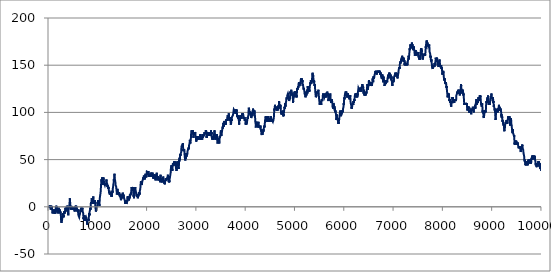
| Category | Series 2 |
|---|---|
| 0.0 | -1 |
| 1.0 | -2 |
| 2.0 | -1 |
| 3.0 | 0 |
| 4.0 | 1 |
| 5.0 | 0 |
| 6.0 | 1 |
| 7.0 | 0 |
| 8.0 | -1 |
| 9.0 | 0 |
| 10.0 | 1 |
| 11.0 | 2 |
| 12.0 | 1 |
| 13.0 | 0 |
| 14.0 | -1 |
| 15.0 | 0 |
| 16.0 | 1 |
| 17.0 | 2 |
| 18.0 | 1 |
| 19.0 | 0 |
| 20.0 | -1 |
| 21.0 | -2 |
| 22.0 | -1 |
| 23.0 | 0 |
| 24.0 | 1 |
| 25.0 | 2 |
| 26.0 | 1 |
| 27.0 | 0 |
| 28.0 | -1 |
| 29.0 | -2 |
| 30.0 | -1 |
| 31.0 | -2 |
| 32.0 | -1 |
| 33.0 | -2 |
| 34.0 | -1 |
| 35.0 | -2 |
| 36.0 | -3 |
| 37.0 | -2 |
| 38.0 | -3 |
| 39.0 | -2 |
| 40.0 | -1 |
| 41.0 | 0 |
| 42.0 | 1 |
| 43.0 | 0 |
| 44.0 | 1 |
| 45.0 | 2 |
| 46.0 | 1 |
| 47.0 | 0 |
| 48.0 | -1 |
| 49.0 | 0 |
| 50.0 | -1 |
| 51.0 | 0 |
| 52.0 | 1 |
| 53.0 | 2 |
| 54.0 | 1 |
| 55.0 | 0 |
| 56.0 | 1 |
| 57.0 | 2 |
| 58.0 | 1 |
| 59.0 | 0 |
| 60.0 | -1 |
| 61.0 | -2 |
| 62.0 | -3 |
| 63.0 | -4 |
| 64.0 | -3 |
| 65.0 | -4 |
| 66.0 | -3 |
| 67.0 | -4 |
| 68.0 | -5 |
| 69.0 | -6 |
| 70.0 | -7 |
| 71.0 | -8 |
| 72.0 | -7 |
| 73.0 | -8 |
| 74.0 | -7 |
| 75.0 | -6 |
| 76.0 | -7 |
| 77.0 | -6 |
| 78.0 | -5 |
| 79.0 | -4 |
| 80.0 | -5 |
| 81.0 | -6 |
| 82.0 | -5 |
| 83.0 | -6 |
| 84.0 | -5 |
| 85.0 | -4 |
| 86.0 | -5 |
| 87.0 | -6 |
| 88.0 | -5 |
| 89.0 | -6 |
| 90.0 | -5 |
| 91.0 | -4 |
| 92.0 | -3 |
| 93.0 | -2 |
| 94.0 | -3 |
| 95.0 | -4 |
| 96.0 | -5 |
| 97.0 | -6 |
| 98.0 | -5 |
| 99.0 | -4 |
| 100.0 | -3 |
| 101.0 | -4 |
| 102.0 | -5 |
| 103.0 | -6 |
| 104.0 | -5 |
| 105.0 | -6 |
| 106.0 | -5 |
| 107.0 | -6 |
| 108.0 | -7 |
| 109.0 | -6 |
| 110.0 | -5 |
| 111.0 | -6 |
| 112.0 | -7 |
| 113.0 | -6 |
| 114.0 | -7 |
| 115.0 | -6 |
| 116.0 | -5 |
| 117.0 | -4 |
| 118.0 | -3 |
| 119.0 | -2 |
| 120.0 | -3 |
| 121.0 | -2 |
| 122.0 | -3 |
| 123.0 | -2 |
| 124.0 | -3 |
| 125.0 | -2 |
| 126.0 | -3 |
| 127.0 | -2 |
| 128.0 | -3 |
| 129.0 | -4 |
| 130.0 | -5 |
| 131.0 | -6 |
| 132.0 | -7 |
| 133.0 | -6 |
| 134.0 | -5 |
| 135.0 | -4 |
| 136.0 | -3 |
| 137.0 | -2 |
| 138.0 | -1 |
| 139.0 | -2 |
| 140.0 | -1 |
| 141.0 | 0 |
| 142.0 | 1 |
| 143.0 | 0 |
| 144.0 | 1 |
| 145.0 | 0 |
| 146.0 | -1 |
| 147.0 | 0 |
| 148.0 | -1 |
| 149.0 | 0 |
| 150.0 | 1 |
| 151.0 | 0 |
| 152.0 | 1 |
| 153.0 | 0 |
| 154.0 | -1 |
| 155.0 | 0 |
| 156.0 | -1 |
| 157.0 | -2 |
| 158.0 | -3 |
| 159.0 | -2 |
| 160.0 | -3 |
| 161.0 | -4 |
| 162.0 | -3 |
| 163.0 | -2 |
| 164.0 | -1 |
| 165.0 | -2 |
| 166.0 | -3 |
| 167.0 | -4 |
| 168.0 | -5 |
| 169.0 | -4 |
| 170.0 | -3 |
| 171.0 | -4 |
| 172.0 | -5 |
| 173.0 | -6 |
| 174.0 | -5 |
| 175.0 | -4 |
| 176.0 | -3 |
| 177.0 | -4 |
| 178.0 | -5 |
| 179.0 | -4 |
| 180.0 | -5 |
| 181.0 | -6 |
| 182.0 | -7 |
| 183.0 | -8 |
| 184.0 | -7 |
| 185.0 | -6 |
| 186.0 | -5 |
| 187.0 | -4 |
| 188.0 | -5 |
| 189.0 | -4 |
| 190.0 | -5 |
| 191.0 | -4 |
| 192.0 | -5 |
| 193.0 | -4 |
| 194.0 | -5 |
| 195.0 | -4 |
| 196.0 | -3 |
| 197.0 | -2 |
| 198.0 | -1 |
| 199.0 | -2 |
| 200.0 | -3 |
| 201.0 | -4 |
| 202.0 | -5 |
| 203.0 | -4 |
| 204.0 | -3 |
| 205.0 | -2 |
| 206.0 | -3 |
| 207.0 | -4 |
| 208.0 | -3 |
| 209.0 | -4 |
| 210.0 | -5 |
| 211.0 | -6 |
| 212.0 | -5 |
| 213.0 | -4 |
| 214.0 | -5 |
| 215.0 | -6 |
| 216.0 | -5 |
| 217.0 | -6 |
| 218.0 | -5 |
| 219.0 | -6 |
| 220.0 | -5 |
| 221.0 | -4 |
| 222.0 | -3 |
| 223.0 | -4 |
| 224.0 | -5 |
| 225.0 | -6 |
| 226.0 | -7 |
| 227.0 | -6 |
| 228.0 | -7 |
| 229.0 | -6 |
| 230.0 | -5 |
| 231.0 | -6 |
| 232.0 | -5 |
| 233.0 | -6 |
| 234.0 | -7 |
| 235.0 | -6 |
| 236.0 | -7 |
| 237.0 | -6 |
| 238.0 | -7 |
| 239.0 | -8 |
| 240.0 | -9 |
| 241.0 | -10 |
| 242.0 | -11 |
| 243.0 | -12 |
| 244.0 | -13 |
| 245.0 | -14 |
| 246.0 | -15 |
| 247.0 | -16 |
| 248.0 | -15 |
| 249.0 | -16 |
| 250.0 | -15 |
| 251.0 | -14 |
| 252.0 | -15 |
| 253.0 | -16 |
| 254.0 | -17 |
| 255.0 | -16 |
| 256.0 | -15 |
| 257.0 | -16 |
| 258.0 | -15 |
| 259.0 | -14 |
| 260.0 | -13 |
| 261.0 | -12 |
| 262.0 | -13 |
| 263.0 | -14 |
| 264.0 | -15 |
| 265.0 | -14 |
| 266.0 | -13 |
| 267.0 | -12 |
| 268.0 | -13 |
| 269.0 | -12 |
| 270.0 | -11 |
| 271.0 | -12 |
| 272.0 | -11 |
| 273.0 | -10 |
| 274.0 | -9 |
| 275.0 | -8 |
| 276.0 | -7 |
| 277.0 | -8 |
| 278.0 | -9 |
| 279.0 | -8 |
| 280.0 | -9 |
| 281.0 | -8 |
| 282.0 | -9 |
| 283.0 | -8 |
| 284.0 | -7 |
| 285.0 | -8 |
| 286.0 | -9 |
| 287.0 | -10 |
| 288.0 | -11 |
| 289.0 | -12 |
| 290.0 | -11 |
| 291.0 | -10 |
| 292.0 | -9 |
| 293.0 | -10 |
| 294.0 | -11 |
| 295.0 | -12 |
| 296.0 | -11 |
| 297.0 | -10 |
| 298.0 | -9 |
| 299.0 | -8 |
| 300.0 | -9 |
| 301.0 | -8 |
| 302.0 | -7 |
| 303.0 | -6 |
| 304.0 | -5 |
| 305.0 | -6 |
| 306.0 | -7 |
| 307.0 | -6 |
| 308.0 | -7 |
| 309.0 | -6 |
| 310.0 | -7 |
| 311.0 | -6 |
| 312.0 | -5 |
| 313.0 | -6 |
| 314.0 | -5 |
| 315.0 | -6 |
| 316.0 | -5 |
| 317.0 | -6 |
| 318.0 | -5 |
| 319.0 | -4 |
| 320.0 | -5 |
| 321.0 | -6 |
| 322.0 | -7 |
| 323.0 | -6 |
| 324.0 | -5 |
| 325.0 | -4 |
| 326.0 | -5 |
| 327.0 | -4 |
| 328.0 | -5 |
| 329.0 | -4 |
| 330.0 | -3 |
| 331.0 | -2 |
| 332.0 | -1 |
| 333.0 | -2 |
| 334.0 | -1 |
| 335.0 | -2 |
| 336.0 | -1 |
| 337.0 | -2 |
| 338.0 | -3 |
| 339.0 | -4 |
| 340.0 | -5 |
| 341.0 | -4 |
| 342.0 | -3 |
| 343.0 | -4 |
| 344.0 | -3 |
| 345.0 | -4 |
| 346.0 | -3 |
| 347.0 | -2 |
| 348.0 | -3 |
| 349.0 | -2 |
| 350.0 | -3 |
| 351.0 | -2 |
| 352.0 | -1 |
| 353.0 | 0 |
| 354.0 | -1 |
| 355.0 | -2 |
| 356.0 | -1 |
| 357.0 | -2 |
| 358.0 | -3 |
| 359.0 | -2 |
| 360.0 | -1 |
| 361.0 | 0 |
| 362.0 | 1 |
| 363.0 | 2 |
| 364.0 | 1 |
| 365.0 | 0 |
| 366.0 | 1 |
| 367.0 | 0 |
| 368.0 | 1 |
| 369.0 | 0 |
| 370.0 | -1 |
| 371.0 | 0 |
| 372.0 | 1 |
| 373.0 | 0 |
| 374.0 | -1 |
| 375.0 | -2 |
| 376.0 | -3 |
| 377.0 | -4 |
| 378.0 | -3 |
| 379.0 | -4 |
| 380.0 | -5 |
| 381.0 | -6 |
| 382.0 | -5 |
| 383.0 | -4 |
| 384.0 | -5 |
| 385.0 | -6 |
| 386.0 | -7 |
| 387.0 | -8 |
| 388.0 | -7 |
| 389.0 | -8 |
| 390.0 | -9 |
| 391.0 | -8 |
| 392.0 | -9 |
| 393.0 | -8 |
| 394.0 | -7 |
| 395.0 | -6 |
| 396.0 | -5 |
| 397.0 | -4 |
| 398.0 | -3 |
| 399.0 | -2 |
| 400.0 | -3 |
| 401.0 | -2 |
| 402.0 | -3 |
| 403.0 | -2 |
| 404.0 | -1 |
| 405.0 | -2 |
| 406.0 | -1 |
| 407.0 | -2 |
| 408.0 | -1 |
| 409.0 | 0 |
| 410.0 | 1 |
| 411.0 | 0 |
| 412.0 | 1 |
| 413.0 | 2 |
| 414.0 | 1 |
| 415.0 | 2 |
| 416.0 | 3 |
| 417.0 | 4 |
| 418.0 | 5 |
| 419.0 | 6 |
| 420.0 | 7 |
| 421.0 | 8 |
| 422.0 | 9 |
| 423.0 | 10 |
| 424.0 | 9 |
| 425.0 | 8 |
| 426.0 | 7 |
| 427.0 | 6 |
| 428.0 | 5 |
| 429.0 | 4 |
| 430.0 | 3 |
| 431.0 | 2 |
| 432.0 | 3 |
| 433.0 | 2 |
| 434.0 | 1 |
| 435.0 | 2 |
| 436.0 | 1 |
| 437.0 | 2 |
| 438.0 | 1 |
| 439.0 | 0 |
| 440.0 | 1 |
| 441.0 | 0 |
| 442.0 | -1 |
| 443.0 | -2 |
| 444.0 | -3 |
| 445.0 | -2 |
| 446.0 | -1 |
| 447.0 | -2 |
| 448.0 | -1 |
| 449.0 | 0 |
| 450.0 | -1 |
| 451.0 | 0 |
| 452.0 | 1 |
| 453.0 | 2 |
| 454.0 | 1 |
| 455.0 | 2 |
| 456.0 | 1 |
| 457.0 | 0 |
| 458.0 | -1 |
| 459.0 | -2 |
| 460.0 | -3 |
| 461.0 | -2 |
| 462.0 | -1 |
| 463.0 | -2 |
| 464.0 | -1 |
| 465.0 | 0 |
| 466.0 | -1 |
| 467.0 | -2 |
| 468.0 | -1 |
| 469.0 | -2 |
| 470.0 | -1 |
| 471.0 | -2 |
| 472.0 | -3 |
| 473.0 | -2 |
| 474.0 | -1 |
| 475.0 | -2 |
| 476.0 | -3 |
| 477.0 | -2 |
| 478.0 | -3 |
| 479.0 | -4 |
| 480.0 | -3 |
| 481.0 | -4 |
| 482.0 | -3 |
| 483.0 | -2 |
| 484.0 | -1 |
| 485.0 | -2 |
| 486.0 | -1 |
| 487.0 | -2 |
| 488.0 | -1 |
| 489.0 | -2 |
| 490.0 | -3 |
| 491.0 | -2 |
| 492.0 | -1 |
| 493.0 | -2 |
| 494.0 | -1 |
| 495.0 | -2 |
| 496.0 | -1 |
| 497.0 | -2 |
| 498.0 | -1 |
| 499.0 | -2 |
| 500.0 | -3 |
| 501.0 | -4 |
| 502.0 | -3 |
| 503.0 | -2 |
| 504.0 | -1 |
| 505.0 | 0 |
| 506.0 | -1 |
| 507.0 | -2 |
| 508.0 | -3 |
| 509.0 | -2 |
| 510.0 | -3 |
| 511.0 | -2 |
| 512.0 | -3 |
| 513.0 | -4 |
| 514.0 | -3 |
| 515.0 | -2 |
| 516.0 | -3 |
| 517.0 | -2 |
| 518.0 | -3 |
| 519.0 | -4 |
| 520.0 | -5 |
| 521.0 | -6 |
| 522.0 | -5 |
| 523.0 | -6 |
| 524.0 | -5 |
| 525.0 | -4 |
| 526.0 | -5 |
| 527.0 | -4 |
| 528.0 | -3 |
| 529.0 | -2 |
| 530.0 | -3 |
| 531.0 | -2 |
| 532.0 | -1 |
| 533.0 | -2 |
| 534.0 | -1 |
| 535.0 | 0 |
| 536.0 | 1 |
| 537.0 | 0 |
| 538.0 | 1 |
| 539.0 | 0 |
| 540.0 | -1 |
| 541.0 | 0 |
| 542.0 | 1 |
| 543.0 | 2 |
| 544.0 | 1 |
| 545.0 | 0 |
| 546.0 | -1 |
| 547.0 | -2 |
| 548.0 | -1 |
| 549.0 | 0 |
| 550.0 | 1 |
| 551.0 | 0 |
| 552.0 | -1 |
| 553.0 | 0 |
| 554.0 | -1 |
| 555.0 | 0 |
| 556.0 | -1 |
| 557.0 | -2 |
| 558.0 | -3 |
| 559.0 | -2 |
| 560.0 | -1 |
| 561.0 | -2 |
| 562.0 | -1 |
| 563.0 | -2 |
| 564.0 | -1 |
| 565.0 | -2 |
| 566.0 | -1 |
| 567.0 | -2 |
| 568.0 | -3 |
| 569.0 | -4 |
| 570.0 | -3 |
| 571.0 | -4 |
| 572.0 | -5 |
| 573.0 | -6 |
| 574.0 | -5 |
| 575.0 | -4 |
| 576.0 | -5 |
| 577.0 | -6 |
| 578.0 | -5 |
| 579.0 | -4 |
| 580.0 | -3 |
| 581.0 | -4 |
| 582.0 | -5 |
| 583.0 | -4 |
| 584.0 | -5 |
| 585.0 | -4 |
| 586.0 | -3 |
| 587.0 | -4 |
| 588.0 | -5 |
| 589.0 | -6 |
| 590.0 | -5 |
| 591.0 | -6 |
| 592.0 | -7 |
| 593.0 | -6 |
| 594.0 | -7 |
| 595.0 | -8 |
| 596.0 | -9 |
| 597.0 | -10 |
| 598.0 | -9 |
| 599.0 | -10 |
| 600.0 | -9 |
| 601.0 | -10 |
| 602.0 | -9 |
| 603.0 | -8 |
| 604.0 | -9 |
| 605.0 | -8 |
| 606.0 | -9 |
| 607.0 | -8 |
| 608.0 | -9 |
| 609.0 | -8 |
| 610.0 | -9 |
| 611.0 | -10 |
| 612.0 | -11 |
| 613.0 | -10 |
| 614.0 | -11 |
| 615.0 | -10 |
| 616.0 | -11 |
| 617.0 | -10 |
| 618.0 | -9 |
| 619.0 | -10 |
| 620.0 | -9 |
| 621.0 | -8 |
| 622.0 | -9 |
| 623.0 | -8 |
| 624.0 | -9 |
| 625.0 | -10 |
| 626.0 | -9 |
| 627.0 | -10 |
| 628.0 | -9 |
| 629.0 | -8 |
| 630.0 | -7 |
| 631.0 | -6 |
| 632.0 | -7 |
| 633.0 | -6 |
| 634.0 | -5 |
| 635.0 | -6 |
| 636.0 | -5 |
| 637.0 | -4 |
| 638.0 | -3 |
| 639.0 | -4 |
| 640.0 | -5 |
| 641.0 | -6 |
| 642.0 | -5 |
| 643.0 | -4 |
| 644.0 | -3 |
| 645.0 | -2 |
| 646.0 | -3 |
| 647.0 | -4 |
| 648.0 | -3 |
| 649.0 | -2 |
| 650.0 | -3 |
| 651.0 | -2 |
| 652.0 | -1 |
| 653.0 | 0 |
| 654.0 | -1 |
| 655.0 | -2 |
| 656.0 | -3 |
| 657.0 | -2 |
| 658.0 | -3 |
| 659.0 | -4 |
| 660.0 | -5 |
| 661.0 | -4 |
| 662.0 | -3 |
| 663.0 | -4 |
| 664.0 | -3 |
| 665.0 | -4 |
| 666.0 | -5 |
| 667.0 | -4 |
| 668.0 | -5 |
| 669.0 | -4 |
| 670.0 | -3 |
| 671.0 | -2 |
| 672.0 | -3 |
| 673.0 | -4 |
| 674.0 | -3 |
| 675.0 | -2 |
| 676.0 | -3 |
| 677.0 | -2 |
| 678.0 | -1 |
| 679.0 | -2 |
| 680.0 | -3 |
| 681.0 | -2 |
| 682.0 | -3 |
| 683.0 | -4 |
| 684.0 | -5 |
| 685.0 | -4 |
| 686.0 | -5 |
| 687.0 | -4 |
| 688.0 | -5 |
| 689.0 | -4 |
| 690.0 | -5 |
| 691.0 | -6 |
| 692.0 | -5 |
| 693.0 | -6 |
| 694.0 | -7 |
| 695.0 | -8 |
| 696.0 | -9 |
| 697.0 | -10 |
| 698.0 | -11 |
| 699.0 | -12 |
| 700.0 | -13 |
| 701.0 | -12 |
| 702.0 | -11 |
| 703.0 | -12 |
| 704.0 | -13 |
| 705.0 | -12 |
| 706.0 | -13 |
| 707.0 | -12 |
| 708.0 | -13 |
| 709.0 | -14 |
| 710.0 | -15 |
| 711.0 | -14 |
| 712.0 | -15 |
| 713.0 | -14 |
| 714.0 | -13 |
| 715.0 | -12 |
| 716.0 | -11 |
| 717.0 | -10 |
| 718.0 | -9 |
| 719.0 | -8 |
| 720.0 | -9 |
| 721.0 | -10 |
| 722.0 | -9 |
| 723.0 | -10 |
| 724.0 | -11 |
| 725.0 | -10 |
| 726.0 | -11 |
| 727.0 | -12 |
| 728.0 | -13 |
| 729.0 | -14 |
| 730.0 | -15 |
| 731.0 | -16 |
| 732.0 | -15 |
| 733.0 | -14 |
| 734.0 | -15 |
| 735.0 | -14 |
| 736.0 | -15 |
| 737.0 | -14 |
| 738.0 | -13 |
| 739.0 | -14 |
| 740.0 | -13 |
| 741.0 | -12 |
| 742.0 | -13 |
| 743.0 | -14 |
| 744.0 | -13 |
| 745.0 | -14 |
| 746.0 | -13 |
| 747.0 | -12 |
| 748.0 | -13 |
| 749.0 | -12 |
| 750.0 | -13 |
| 751.0 | -12 |
| 752.0 | -11 |
| 753.0 | -10 |
| 754.0 | -11 |
| 755.0 | -10 |
| 756.0 | -11 |
| 757.0 | -12 |
| 758.0 | -11 |
| 759.0 | -12 |
| 760.0 | -11 |
| 761.0 | -12 |
| 762.0 | -11 |
| 763.0 | -10 |
| 764.0 | -11 |
| 765.0 | -12 |
| 766.0 | -13 |
| 767.0 | -14 |
| 768.0 | -15 |
| 769.0 | -16 |
| 770.0 | -17 |
| 771.0 | -18 |
| 772.0 | -17 |
| 773.0 | -18 |
| 774.0 | -19 |
| 775.0 | -18 |
| 776.0 | -19 |
| 777.0 | -20 |
| 778.0 | -19 |
| 779.0 | -18 |
| 780.0 | -17 |
| 781.0 | -16 |
| 782.0 | -15 |
| 783.0 | -16 |
| 784.0 | -15 |
| 785.0 | -14 |
| 786.0 | -13 |
| 787.0 | -12 |
| 788.0 | -13 |
| 789.0 | -14 |
| 790.0 | -13 |
| 791.0 | -12 |
| 792.0 | -13 |
| 793.0 | -14 |
| 794.0 | -13 |
| 795.0 | -14 |
| 796.0 | -15 |
| 797.0 | -14 |
| 798.0 | -13 |
| 799.0 | -14 |
| 800.0 | -13 |
| 801.0 | -14 |
| 802.0 | -15 |
| 803.0 | -16 |
| 804.0 | -15 |
| 805.0 | -14 |
| 806.0 | -13 |
| 807.0 | -12 |
| 808.0 | -11 |
| 809.0 | -10 |
| 810.0 | -9 |
| 811.0 | -8 |
| 812.0 | -7 |
| 813.0 | -8 |
| 814.0 | -7 |
| 815.0 | -8 |
| 816.0 | -9 |
| 817.0 | -8 |
| 818.0 | -7 |
| 819.0 | -8 |
| 820.0 | -9 |
| 821.0 | -8 |
| 822.0 | -7 |
| 823.0 | -6 |
| 824.0 | -5 |
| 825.0 | -4 |
| 826.0 | -5 |
| 827.0 | -6 |
| 828.0 | -5 |
| 829.0 | -4 |
| 830.0 | -5 |
| 831.0 | -6 |
| 832.0 | -5 |
| 833.0 | -4 |
| 834.0 | -3 |
| 835.0 | -2 |
| 836.0 | -1 |
| 837.0 | -2 |
| 838.0 | -1 |
| 839.0 | -2 |
| 840.0 | -1 |
| 841.0 | -2 |
| 842.0 | -3 |
| 843.0 | -2 |
| 844.0 | -1 |
| 845.0 | 0 |
| 846.0 | 1 |
| 847.0 | 2 |
| 848.0 | 3 |
| 849.0 | 4 |
| 850.0 | 5 |
| 851.0 | 6 |
| 852.0 | 5 |
| 853.0 | 4 |
| 854.0 | 5 |
| 855.0 | 6 |
| 856.0 | 5 |
| 857.0 | 4 |
| 858.0 | 3 |
| 859.0 | 4 |
| 860.0 | 5 |
| 861.0 | 4 |
| 862.0 | 5 |
| 863.0 | 6 |
| 864.0 | 7 |
| 865.0 | 8 |
| 866.0 | 7 |
| 867.0 | 8 |
| 868.0 | 9 |
| 869.0 | 8 |
| 870.0 | 7 |
| 871.0 | 8 |
| 872.0 | 7 |
| 873.0 | 6 |
| 874.0 | 5 |
| 875.0 | 4 |
| 876.0 | 3 |
| 877.0 | 4 |
| 878.0 | 3 |
| 879.0 | 4 |
| 880.0 | 5 |
| 881.0 | 4 |
| 882.0 | 3 |
| 883.0 | 4 |
| 884.0 | 3 |
| 885.0 | 2 |
| 886.0 | 3 |
| 887.0 | 4 |
| 888.0 | 5 |
| 889.0 | 4 |
| 890.0 | 5 |
| 891.0 | 6 |
| 892.0 | 7 |
| 893.0 | 8 |
| 894.0 | 9 |
| 895.0 | 8 |
| 896.0 | 9 |
| 897.0 | 10 |
| 898.0 | 11 |
| 899.0 | 10 |
| 900.0 | 9 |
| 901.0 | 8 |
| 902.0 | 7 |
| 903.0 | 6 |
| 904.0 | 5 |
| 905.0 | 4 |
| 906.0 | 5 |
| 907.0 | 6 |
| 908.0 | 7 |
| 909.0 | 6 |
| 910.0 | 5 |
| 911.0 | 4 |
| 912.0 | 3 |
| 913.0 | 4 |
| 914.0 | 5 |
| 915.0 | 6 |
| 916.0 | 5 |
| 917.0 | 6 |
| 918.0 | 5 |
| 919.0 | 6 |
| 920.0 | 7 |
| 921.0 | 6 |
| 922.0 | 7 |
| 923.0 | 6 |
| 924.0 | 7 |
| 925.0 | 6 |
| 926.0 | 5 |
| 927.0 | 6 |
| 928.0 | 7 |
| 929.0 | 6 |
| 930.0 | 5 |
| 931.0 | 6 |
| 932.0 | 5 |
| 933.0 | 4 |
| 934.0 | 5 |
| 935.0 | 4 |
| 936.0 | 3 |
| 937.0 | 2 |
| 938.0 | 3 |
| 939.0 | 2 |
| 940.0 | 1 |
| 941.0 | 0 |
| 942.0 | -1 |
| 943.0 | -2 |
| 944.0 | -1 |
| 945.0 | -2 |
| 946.0 | -1 |
| 947.0 | -2 |
| 948.0 | -3 |
| 949.0 | -4 |
| 950.0 | -5 |
| 951.0 | -6 |
| 952.0 | -5 |
| 953.0 | -6 |
| 954.0 | -5 |
| 955.0 | -6 |
| 956.0 | -5 |
| 957.0 | -6 |
| 958.0 | -5 |
| 959.0 | -4 |
| 960.0 | -3 |
| 961.0 | -2 |
| 962.0 | -3 |
| 963.0 | -4 |
| 964.0 | -3 |
| 965.0 | -2 |
| 966.0 | -3 |
| 967.0 | -2 |
| 968.0 | -3 |
| 969.0 | -2 |
| 970.0 | -3 |
| 971.0 | -2 |
| 972.0 | -3 |
| 973.0 | -2 |
| 974.0 | -1 |
| 975.0 | 0 |
| 976.0 | -1 |
| 977.0 | 0 |
| 978.0 | 1 |
| 979.0 | 0 |
| 980.0 | 1 |
| 981.0 | 0 |
| 982.0 | 1 |
| 983.0 | 2 |
| 984.0 | 3 |
| 985.0 | 4 |
| 986.0 | 5 |
| 987.0 | 4 |
| 988.0 | 3 |
| 989.0 | 4 |
| 990.0 | 5 |
| 991.0 | 4 |
| 992.0 | 5 |
| 993.0 | 6 |
| 994.0 | 7 |
| 995.0 | 8 |
| 996.0 | 7 |
| 997.0 | 6 |
| 998.0 | 5 |
| 999.0 | 6 |
| 1000.0 | 5 |
| 1001.0 | 4 |
| 1002.0 | 5 |
| 1003.0 | 6 |
| 1004.0 | 7 |
| 1005.0 | 6 |
| 1006.0 | 5 |
| 1007.0 | 6 |
| 1008.0 | 5 |
| 1009.0 | 6 |
| 1010.0 | 5 |
| 1011.0 | 4 |
| 1012.0 | 5 |
| 1013.0 | 6 |
| 1014.0 | 5 |
| 1015.0 | 4 |
| 1016.0 | 3 |
| 1017.0 | 4 |
| 1018.0 | 3 |
| 1019.0 | 2 |
| 1020.0 | 3 |
| 1021.0 | 2 |
| 1022.0 | 1 |
| 1023.0 | 2 |
| 1024.0 | 3 |
| 1025.0 | 4 |
| 1026.0 | 5 |
| 1027.0 | 6 |
| 1028.0 | 7 |
| 1029.0 | 8 |
| 1030.0 | 9 |
| 1031.0 | 8 |
| 1032.0 | 9 |
| 1033.0 | 10 |
| 1034.0 | 11 |
| 1035.0 | 12 |
| 1036.0 | 11 |
| 1037.0 | 12 |
| 1038.0 | 11 |
| 1039.0 | 12 |
| 1040.0 | 13 |
| 1041.0 | 12 |
| 1042.0 | 13 |
| 1043.0 | 12 |
| 1044.0 | 13 |
| 1045.0 | 14 |
| 1046.0 | 15 |
| 1047.0 | 16 |
| 1048.0 | 17 |
| 1049.0 | 18 |
| 1050.0 | 19 |
| 1051.0 | 20 |
| 1052.0 | 19 |
| 1053.0 | 20 |
| 1054.0 | 21 |
| 1055.0 | 22 |
| 1056.0 | 23 |
| 1057.0 | 24 |
| 1058.0 | 25 |
| 1059.0 | 26 |
| 1060.0 | 27 |
| 1061.0 | 26 |
| 1062.0 | 27 |
| 1063.0 | 26 |
| 1064.0 | 27 |
| 1065.0 | 28 |
| 1066.0 | 29 |
| 1067.0 | 28 |
| 1068.0 | 29 |
| 1069.0 | 28 |
| 1070.0 | 27 |
| 1071.0 | 28 |
| 1072.0 | 29 |
| 1073.0 | 28 |
| 1074.0 | 29 |
| 1075.0 | 28 |
| 1076.0 | 29 |
| 1077.0 | 30 |
| 1078.0 | 31 |
| 1079.0 | 30 |
| 1080.0 | 29 |
| 1081.0 | 30 |
| 1082.0 | 29 |
| 1083.0 | 30 |
| 1084.0 | 31 |
| 1085.0 | 30 |
| 1086.0 | 29 |
| 1087.0 | 28 |
| 1088.0 | 27 |
| 1089.0 | 26 |
| 1090.0 | 27 |
| 1091.0 | 26 |
| 1092.0 | 25 |
| 1093.0 | 24 |
| 1094.0 | 23 |
| 1095.0 | 24 |
| 1096.0 | 25 |
| 1097.0 | 24 |
| 1098.0 | 25 |
| 1099.0 | 26 |
| 1100.0 | 27 |
| 1101.0 | 28 |
| 1102.0 | 27 |
| 1103.0 | 28 |
| 1104.0 | 29 |
| 1105.0 | 30 |
| 1106.0 | 31 |
| 1107.0 | 30 |
| 1108.0 | 29 |
| 1109.0 | 28 |
| 1110.0 | 27 |
| 1111.0 | 28 |
| 1112.0 | 27 |
| 1113.0 | 26 |
| 1114.0 | 25 |
| 1115.0 | 26 |
| 1116.0 | 27 |
| 1117.0 | 26 |
| 1118.0 | 25 |
| 1119.0 | 24 |
| 1120.0 | 23 |
| 1121.0 | 24 |
| 1122.0 | 25 |
| 1123.0 | 26 |
| 1124.0 | 25 |
| 1125.0 | 24 |
| 1126.0 | 25 |
| 1127.0 | 26 |
| 1128.0 | 25 |
| 1129.0 | 26 |
| 1130.0 | 25 |
| 1131.0 | 26 |
| 1132.0 | 25 |
| 1133.0 | 24 |
| 1134.0 | 23 |
| 1135.0 | 22 |
| 1136.0 | 23 |
| 1137.0 | 22 |
| 1138.0 | 23 |
| 1139.0 | 24 |
| 1140.0 | 23 |
| 1141.0 | 24 |
| 1142.0 | 23 |
| 1143.0 | 24 |
| 1144.0 | 25 |
| 1145.0 | 24 |
| 1146.0 | 25 |
| 1147.0 | 24 |
| 1148.0 | 25 |
| 1149.0 | 26 |
| 1150.0 | 25 |
| 1151.0 | 24 |
| 1152.0 | 23 |
| 1153.0 | 24 |
| 1154.0 | 23 |
| 1155.0 | 24 |
| 1156.0 | 25 |
| 1157.0 | 24 |
| 1158.0 | 23 |
| 1159.0 | 24 |
| 1160.0 | 25 |
| 1161.0 | 26 |
| 1162.0 | 27 |
| 1163.0 | 26 |
| 1164.0 | 27 |
| 1165.0 | 28 |
| 1166.0 | 29 |
| 1167.0 | 28 |
| 1168.0 | 27 |
| 1169.0 | 26 |
| 1170.0 | 27 |
| 1171.0 | 28 |
| 1172.0 | 27 |
| 1173.0 | 26 |
| 1174.0 | 25 |
| 1175.0 | 24 |
| 1176.0 | 23 |
| 1177.0 | 24 |
| 1178.0 | 25 |
| 1179.0 | 24 |
| 1180.0 | 23 |
| 1181.0 | 22 |
| 1182.0 | 23 |
| 1183.0 | 24 |
| 1184.0 | 23 |
| 1185.0 | 22 |
| 1186.0 | 21 |
| 1187.0 | 20 |
| 1188.0 | 21 |
| 1189.0 | 22 |
| 1190.0 | 23 |
| 1191.0 | 22 |
| 1192.0 | 21 |
| 1193.0 | 22 |
| 1194.0 | 21 |
| 1195.0 | 22 |
| 1196.0 | 21 |
| 1197.0 | 22 |
| 1198.0 | 21 |
| 1199.0 | 20 |
| 1200.0 | 21 |
| 1201.0 | 20 |
| 1202.0 | 19 |
| 1203.0 | 18 |
| 1204.0 | 19 |
| 1205.0 | 20 |
| 1206.0 | 21 |
| 1207.0 | 20 |
| 1208.0 | 21 |
| 1209.0 | 20 |
| 1210.0 | 21 |
| 1211.0 | 20 |
| 1212.0 | 19 |
| 1213.0 | 18 |
| 1214.0 | 17 |
| 1215.0 | 18 |
| 1216.0 | 17 |
| 1217.0 | 16 |
| 1218.0 | 15 |
| 1219.0 | 16 |
| 1220.0 | 15 |
| 1221.0 | 16 |
| 1222.0 | 17 |
| 1223.0 | 18 |
| 1224.0 | 17 |
| 1225.0 | 16 |
| 1226.0 | 17 |
| 1227.0 | 16 |
| 1228.0 | 15 |
| 1229.0 | 14 |
| 1230.0 | 13 |
| 1231.0 | 12 |
| 1232.0 | 13 |
| 1233.0 | 14 |
| 1234.0 | 15 |
| 1235.0 | 14 |
| 1236.0 | 15 |
| 1237.0 | 16 |
| 1238.0 | 15 |
| 1239.0 | 16 |
| 1240.0 | 15 |
| 1241.0 | 16 |
| 1242.0 | 15 |
| 1243.0 | 14 |
| 1244.0 | 15 |
| 1245.0 | 14 |
| 1246.0 | 13 |
| 1247.0 | 12 |
| 1248.0 | 13 |
| 1249.0 | 12 |
| 1250.0 | 13 |
| 1251.0 | 14 |
| 1252.0 | 13 |
| 1253.0 | 14 |
| 1254.0 | 15 |
| 1255.0 | 14 |
| 1256.0 | 15 |
| 1257.0 | 14 |
| 1258.0 | 13 |
| 1259.0 | 14 |
| 1260.0 | 15 |
| 1261.0 | 14 |
| 1262.0 | 13 |
| 1263.0 | 12 |
| 1264.0 | 11 |
| 1265.0 | 10 |
| 1266.0 | 11 |
| 1267.0 | 12 |
| 1268.0 | 13 |
| 1269.0 | 12 |
| 1270.0 | 11 |
| 1271.0 | 12 |
| 1272.0 | 13 |
| 1273.0 | 12 |
| 1274.0 | 11 |
| 1275.0 | 12 |
| 1276.0 | 13 |
| 1277.0 | 12 |
| 1278.0 | 13 |
| 1279.0 | 12 |
| 1280.0 | 13 |
| 1281.0 | 14 |
| 1282.0 | 15 |
| 1283.0 | 14 |
| 1284.0 | 15 |
| 1285.0 | 16 |
| 1286.0 | 17 |
| 1287.0 | 16 |
| 1288.0 | 15 |
| 1289.0 | 16 |
| 1290.0 | 17 |
| 1291.0 | 18 |
| 1292.0 | 19 |
| 1293.0 | 18 |
| 1294.0 | 19 |
| 1295.0 | 20 |
| 1296.0 | 19 |
| 1297.0 | 18 |
| 1298.0 | 19 |
| 1299.0 | 20 |
| 1300.0 | 21 |
| 1301.0 | 22 |
| 1302.0 | 23 |
| 1303.0 | 22 |
| 1304.0 | 23 |
| 1305.0 | 22 |
| 1306.0 | 23 |
| 1307.0 | 24 |
| 1308.0 | 23 |
| 1309.0 | 24 |
| 1310.0 | 25 |
| 1311.0 | 26 |
| 1312.0 | 27 |
| 1313.0 | 28 |
| 1314.0 | 29 |
| 1315.0 | 28 |
| 1316.0 | 29 |
| 1317.0 | 28 |
| 1318.0 | 27 |
| 1319.0 | 28 |
| 1320.0 | 29 |
| 1321.0 | 30 |
| 1322.0 | 31 |
| 1323.0 | 32 |
| 1324.0 | 31 |
| 1325.0 | 32 |
| 1326.0 | 33 |
| 1327.0 | 34 |
| 1328.0 | 35 |
| 1329.0 | 34 |
| 1330.0 | 33 |
| 1331.0 | 32 |
| 1332.0 | 31 |
| 1333.0 | 32 |
| 1334.0 | 31 |
| 1335.0 | 30 |
| 1336.0 | 29 |
| 1337.0 | 30 |
| 1338.0 | 29 |
| 1339.0 | 28 |
| 1340.0 | 29 |
| 1341.0 | 28 |
| 1342.0 | 29 |
| 1343.0 | 28 |
| 1344.0 | 27 |
| 1345.0 | 28 |
| 1346.0 | 27 |
| 1347.0 | 26 |
| 1348.0 | 25 |
| 1349.0 | 24 |
| 1350.0 | 23 |
| 1351.0 | 24 |
| 1352.0 | 23 |
| 1353.0 | 24 |
| 1354.0 | 23 |
| 1355.0 | 22 |
| 1356.0 | 23 |
| 1357.0 | 24 |
| 1358.0 | 23 |
| 1359.0 | 24 |
| 1360.0 | 23 |
| 1361.0 | 24 |
| 1362.0 | 23 |
| 1363.0 | 22 |
| 1364.0 | 21 |
| 1365.0 | 20 |
| 1366.0 | 19 |
| 1367.0 | 20 |
| 1368.0 | 19 |
| 1369.0 | 18 |
| 1370.0 | 17 |
| 1371.0 | 16 |
| 1372.0 | 17 |
| 1373.0 | 16 |
| 1374.0 | 15 |
| 1375.0 | 14 |
| 1376.0 | 13 |
| 1377.0 | 14 |
| 1378.0 | 13 |
| 1379.0 | 14 |
| 1380.0 | 15 |
| 1381.0 | 16 |
| 1382.0 | 17 |
| 1383.0 | 16 |
| 1384.0 | 15 |
| 1385.0 | 16 |
| 1386.0 | 17 |
| 1387.0 | 18 |
| 1388.0 | 19 |
| 1389.0 | 20 |
| 1390.0 | 19 |
| 1391.0 | 18 |
| 1392.0 | 17 |
| 1393.0 | 18 |
| 1394.0 | 17 |
| 1395.0 | 16 |
| 1396.0 | 17 |
| 1397.0 | 16 |
| 1398.0 | 17 |
| 1399.0 | 16 |
| 1400.0 | 15 |
| 1401.0 | 14 |
| 1402.0 | 13 |
| 1403.0 | 14 |
| 1404.0 | 15 |
| 1405.0 | 16 |
| 1406.0 | 15 |
| 1407.0 | 14 |
| 1408.0 | 15 |
| 1409.0 | 14 |
| 1410.0 | 13 |
| 1411.0 | 14 |
| 1412.0 | 15 |
| 1413.0 | 14 |
| 1414.0 | 13 |
| 1415.0 | 14 |
| 1416.0 | 15 |
| 1417.0 | 14 |
| 1418.0 | 15 |
| 1419.0 | 14 |
| 1420.0 | 15 |
| 1421.0 | 14 |
| 1422.0 | 13 |
| 1423.0 | 14 |
| 1424.0 | 15 |
| 1425.0 | 16 |
| 1426.0 | 15 |
| 1427.0 | 14 |
| 1428.0 | 13 |
| 1429.0 | 14 |
| 1430.0 | 13 |
| 1431.0 | 12 |
| 1432.0 | 13 |
| 1433.0 | 12 |
| 1434.0 | 11 |
| 1435.0 | 12 |
| 1436.0 | 13 |
| 1437.0 | 12 |
| 1438.0 | 13 |
| 1439.0 | 12 |
| 1440.0 | 11 |
| 1441.0 | 12 |
| 1442.0 | 11 |
| 1443.0 | 10 |
| 1444.0 | 11 |
| 1445.0 | 12 |
| 1446.0 | 11 |
| 1447.0 | 10 |
| 1448.0 | 11 |
| 1449.0 | 10 |
| 1450.0 | 11 |
| 1451.0 | 10 |
| 1452.0 | 11 |
| 1453.0 | 10 |
| 1454.0 | 9 |
| 1455.0 | 8 |
| 1456.0 | 9 |
| 1457.0 | 10 |
| 1458.0 | 9 |
| 1459.0 | 8 |
| 1460.0 | 7 |
| 1461.0 | 8 |
| 1462.0 | 7 |
| 1463.0 | 8 |
| 1464.0 | 7 |
| 1465.0 | 8 |
| 1466.0 | 9 |
| 1467.0 | 8 |
| 1468.0 | 9 |
| 1469.0 | 10 |
| 1470.0 | 11 |
| 1471.0 | 12 |
| 1472.0 | 13 |
| 1473.0 | 12 |
| 1474.0 | 11 |
| 1475.0 | 10 |
| 1476.0 | 11 |
| 1477.0 | 10 |
| 1478.0 | 11 |
| 1479.0 | 12 |
| 1480.0 | 11 |
| 1481.0 | 10 |
| 1482.0 | 9 |
| 1483.0 | 10 |
| 1484.0 | 11 |
| 1485.0 | 10 |
| 1486.0 | 11 |
| 1487.0 | 12 |
| 1488.0 | 13 |
| 1489.0 | 12 |
| 1490.0 | 13 |
| 1491.0 | 14 |
| 1492.0 | 13 |
| 1493.0 | 12 |
| 1494.0 | 13 |
| 1495.0 | 14 |
| 1496.0 | 15 |
| 1497.0 | 16 |
| 1498.0 | 15 |
| 1499.0 | 14 |
| 1500.0 | 13 |
| 1501.0 | 14 |
| 1502.0 | 13 |
| 1503.0 | 12 |
| 1504.0 | 13 |
| 1505.0 | 12 |
| 1506.0 | 11 |
| 1507.0 | 10 |
| 1508.0 | 9 |
| 1509.0 | 10 |
| 1510.0 | 11 |
| 1511.0 | 12 |
| 1512.0 | 13 |
| 1513.0 | 14 |
| 1514.0 | 13 |
| 1515.0 | 12 |
| 1516.0 | 11 |
| 1517.0 | 10 |
| 1518.0 | 11 |
| 1519.0 | 10 |
| 1520.0 | 11 |
| 1521.0 | 12 |
| 1522.0 | 11 |
| 1523.0 | 10 |
| 1524.0 | 9 |
| 1525.0 | 10 |
| 1526.0 | 9 |
| 1527.0 | 8 |
| 1528.0 | 9 |
| 1529.0 | 10 |
| 1530.0 | 9 |
| 1531.0 | 10 |
| 1532.0 | 9 |
| 1533.0 | 8 |
| 1534.0 | 9 |
| 1535.0 | 8 |
| 1536.0 | 7 |
| 1537.0 | 6 |
| 1538.0 | 7 |
| 1539.0 | 6 |
| 1540.0 | 7 |
| 1541.0 | 6 |
| 1542.0 | 5 |
| 1543.0 | 4 |
| 1544.0 | 5 |
| 1545.0 | 4 |
| 1546.0 | 3 |
| 1547.0 | 2 |
| 1548.0 | 3 |
| 1549.0 | 4 |
| 1550.0 | 5 |
| 1551.0 | 6 |
| 1552.0 | 7 |
| 1553.0 | 6 |
| 1554.0 | 7 |
| 1555.0 | 8 |
| 1556.0 | 7 |
| 1557.0 | 8 |
| 1558.0 | 7 |
| 1559.0 | 6 |
| 1560.0 | 5 |
| 1561.0 | 4 |
| 1562.0 | 5 |
| 1563.0 | 4 |
| 1564.0 | 3 |
| 1565.0 | 4 |
| 1566.0 | 5 |
| 1567.0 | 4 |
| 1568.0 | 5 |
| 1569.0 | 4 |
| 1570.0 | 3 |
| 1571.0 | 4 |
| 1572.0 | 3 |
| 1573.0 | 4 |
| 1574.0 | 3 |
| 1575.0 | 4 |
| 1576.0 | 3 |
| 1577.0 | 4 |
| 1578.0 | 5 |
| 1579.0 | 6 |
| 1580.0 | 7 |
| 1581.0 | 8 |
| 1582.0 | 7 |
| 1583.0 | 6 |
| 1584.0 | 5 |
| 1585.0 | 6 |
| 1586.0 | 7 |
| 1587.0 | 8 |
| 1588.0 | 9 |
| 1589.0 | 10 |
| 1590.0 | 9 |
| 1591.0 | 10 |
| 1592.0 | 11 |
| 1593.0 | 10 |
| 1594.0 | 11 |
| 1595.0 | 12 |
| 1596.0 | 11 |
| 1597.0 | 10 |
| 1598.0 | 11 |
| 1599.0 | 12 |
| 1600.0 | 11 |
| 1601.0 | 12 |
| 1602.0 | 11 |
| 1603.0 | 12 |
| 1604.0 | 11 |
| 1605.0 | 10 |
| 1606.0 | 9 |
| 1607.0 | 8 |
| 1608.0 | 9 |
| 1609.0 | 10 |
| 1610.0 | 11 |
| 1611.0 | 10 |
| 1612.0 | 11 |
| 1613.0 | 10 |
| 1614.0 | 9 |
| 1615.0 | 8 |
| 1616.0 | 7 |
| 1617.0 | 6 |
| 1618.0 | 7 |
| 1619.0 | 8 |
| 1620.0 | 7 |
| 1621.0 | 8 |
| 1622.0 | 9 |
| 1623.0 | 8 |
| 1624.0 | 7 |
| 1625.0 | 8 |
| 1626.0 | 9 |
| 1627.0 | 10 |
| 1628.0 | 11 |
| 1629.0 | 10 |
| 1630.0 | 11 |
| 1631.0 | 10 |
| 1632.0 | 11 |
| 1633.0 | 10 |
| 1634.0 | 9 |
| 1635.0 | 10 |
| 1636.0 | 11 |
| 1637.0 | 12 |
| 1638.0 | 11 |
| 1639.0 | 12 |
| 1640.0 | 13 |
| 1641.0 | 12 |
| 1642.0 | 13 |
| 1643.0 | 12 |
| 1644.0 | 11 |
| 1645.0 | 12 |
| 1646.0 | 11 |
| 1647.0 | 10 |
| 1648.0 | 11 |
| 1649.0 | 12 |
| 1650.0 | 13 |
| 1651.0 | 14 |
| 1652.0 | 13 |
| 1653.0 | 14 |
| 1654.0 | 13 |
| 1655.0 | 12 |
| 1656.0 | 13 |
| 1657.0 | 12 |
| 1658.0 | 13 |
| 1659.0 | 12 |
| 1660.0 | 13 |
| 1661.0 | 14 |
| 1662.0 | 15 |
| 1663.0 | 14 |
| 1664.0 | 13 |
| 1665.0 | 14 |
| 1666.0 | 15 |
| 1667.0 | 16 |
| 1668.0 | 17 |
| 1669.0 | 16 |
| 1670.0 | 17 |
| 1671.0 | 18 |
| 1672.0 | 19 |
| 1673.0 | 18 |
| 1674.0 | 19 |
| 1675.0 | 20 |
| 1676.0 | 21 |
| 1677.0 | 22 |
| 1678.0 | 21 |
| 1679.0 | 20 |
| 1680.0 | 21 |
| 1681.0 | 20 |
| 1682.0 | 19 |
| 1683.0 | 20 |
| 1684.0 | 19 |
| 1685.0 | 18 |
| 1686.0 | 17 |
| 1687.0 | 18 |
| 1688.0 | 19 |
| 1689.0 | 18 |
| 1690.0 | 17 |
| 1691.0 | 18 |
| 1692.0 | 17 |
| 1693.0 | 18 |
| 1694.0 | 19 |
| 1695.0 | 20 |
| 1696.0 | 21 |
| 1697.0 | 20 |
| 1698.0 | 21 |
| 1699.0 | 20 |
| 1700.0 | 19 |
| 1701.0 | 20 |
| 1702.0 | 21 |
| 1703.0 | 22 |
| 1704.0 | 21 |
| 1705.0 | 20 |
| 1706.0 | 19 |
| 1707.0 | 18 |
| 1708.0 | 17 |
| 1709.0 | 16 |
| 1710.0 | 15 |
| 1711.0 | 14 |
| 1712.0 | 13 |
| 1713.0 | 12 |
| 1714.0 | 13 |
| 1715.0 | 12 |
| 1716.0 | 11 |
| 1717.0 | 12 |
| 1718.0 | 13 |
| 1719.0 | 12 |
| 1720.0 | 11 |
| 1721.0 | 12 |
| 1722.0 | 11 |
| 1723.0 | 10 |
| 1724.0 | 9 |
| 1725.0 | 10 |
| 1726.0 | 11 |
| 1727.0 | 12 |
| 1728.0 | 11 |
| 1729.0 | 12 |
| 1730.0 | 13 |
| 1731.0 | 14 |
| 1732.0 | 13 |
| 1733.0 | 14 |
| 1734.0 | 13 |
| 1735.0 | 12 |
| 1736.0 | 13 |
| 1737.0 | 14 |
| 1738.0 | 15 |
| 1739.0 | 14 |
| 1740.0 | 15 |
| 1741.0 | 14 |
| 1742.0 | 15 |
| 1743.0 | 16 |
| 1744.0 | 17 |
| 1745.0 | 18 |
| 1746.0 | 19 |
| 1747.0 | 20 |
| 1748.0 | 21 |
| 1749.0 | 22 |
| 1750.0 | 21 |
| 1751.0 | 20 |
| 1752.0 | 19 |
| 1753.0 | 18 |
| 1754.0 | 19 |
| 1755.0 | 18 |
| 1756.0 | 19 |
| 1757.0 | 18 |
| 1758.0 | 17 |
| 1759.0 | 18 |
| 1760.0 | 17 |
| 1761.0 | 18 |
| 1762.0 | 17 |
| 1763.0 | 16 |
| 1764.0 | 17 |
| 1765.0 | 16 |
| 1766.0 | 15 |
| 1767.0 | 14 |
| 1768.0 | 13 |
| 1769.0 | 14 |
| 1770.0 | 13 |
| 1771.0 | 14 |
| 1772.0 | 13 |
| 1773.0 | 14 |
| 1774.0 | 13 |
| 1775.0 | 14 |
| 1776.0 | 13 |
| 1777.0 | 14 |
| 1778.0 | 13 |
| 1779.0 | 12 |
| 1780.0 | 11 |
| 1781.0 | 10 |
| 1782.0 | 11 |
| 1783.0 | 12 |
| 1784.0 | 13 |
| 1785.0 | 12 |
| 1786.0 | 11 |
| 1787.0 | 10 |
| 1788.0 | 11 |
| 1789.0 | 12 |
| 1790.0 | 11 |
| 1791.0 | 12 |
| 1792.0 | 13 |
| 1793.0 | 12 |
| 1794.0 | 13 |
| 1795.0 | 14 |
| 1796.0 | 13 |
| 1797.0 | 12 |
| 1798.0 | 11 |
| 1799.0 | 10 |
| 1800.0 | 9 |
| 1801.0 | 8 |
| 1802.0 | 9 |
| 1803.0 | 8 |
| 1804.0 | 9 |
| 1805.0 | 10 |
| 1806.0 | 11 |
| 1807.0 | 12 |
| 1808.0 | 13 |
| 1809.0 | 14 |
| 1810.0 | 13 |
| 1811.0 | 12 |
| 1812.0 | 11 |
| 1813.0 | 10 |
| 1814.0 | 11 |
| 1815.0 | 10 |
| 1816.0 | 11 |
| 1817.0 | 12 |
| 1818.0 | 11 |
| 1819.0 | 12 |
| 1820.0 | 13 |
| 1821.0 | 14 |
| 1822.0 | 15 |
| 1823.0 | 14 |
| 1824.0 | 13 |
| 1825.0 | 14 |
| 1826.0 | 15 |
| 1827.0 | 14 |
| 1828.0 | 13 |
| 1829.0 | 12 |
| 1830.0 | 13 |
| 1831.0 | 14 |
| 1832.0 | 15 |
| 1833.0 | 16 |
| 1834.0 | 15 |
| 1835.0 | 14 |
| 1836.0 | 13 |
| 1837.0 | 12 |
| 1838.0 | 13 |
| 1839.0 | 14 |
| 1840.0 | 15 |
| 1841.0 | 16 |
| 1842.0 | 17 |
| 1843.0 | 18 |
| 1844.0 | 17 |
| 1845.0 | 16 |
| 1846.0 | 17 |
| 1847.0 | 16 |
| 1848.0 | 17 |
| 1849.0 | 16 |
| 1850.0 | 17 |
| 1851.0 | 18 |
| 1852.0 | 19 |
| 1853.0 | 20 |
| 1854.0 | 21 |
| 1855.0 | 22 |
| 1856.0 | 23 |
| 1857.0 | 22 |
| 1858.0 | 23 |
| 1859.0 | 24 |
| 1860.0 | 25 |
| 1861.0 | 24 |
| 1862.0 | 25 |
| 1863.0 | 26 |
| 1864.0 | 27 |
| 1865.0 | 28 |
| 1866.0 | 27 |
| 1867.0 | 26 |
| 1868.0 | 27 |
| 1869.0 | 26 |
| 1870.0 | 25 |
| 1871.0 | 26 |
| 1872.0 | 25 |
| 1873.0 | 24 |
| 1874.0 | 25 |
| 1875.0 | 24 |
| 1876.0 | 25 |
| 1877.0 | 26 |
| 1878.0 | 27 |
| 1879.0 | 26 |
| 1880.0 | 25 |
| 1881.0 | 26 |
| 1882.0 | 25 |
| 1883.0 | 24 |
| 1884.0 | 23 |
| 1885.0 | 24 |
| 1886.0 | 25 |
| 1887.0 | 24 |
| 1888.0 | 25 |
| 1889.0 | 24 |
| 1890.0 | 25 |
| 1891.0 | 26 |
| 1892.0 | 27 |
| 1893.0 | 26 |
| 1894.0 | 27 |
| 1895.0 | 28 |
| 1896.0 | 27 |
| 1897.0 | 26 |
| 1898.0 | 27 |
| 1899.0 | 26 |
| 1900.0 | 27 |
| 1901.0 | 28 |
| 1902.0 | 27 |
| 1903.0 | 28 |
| 1904.0 | 29 |
| 1905.0 | 30 |
| 1906.0 | 31 |
| 1907.0 | 32 |
| 1908.0 | 31 |
| 1909.0 | 32 |
| 1910.0 | 31 |
| 1911.0 | 32 |
| 1912.0 | 31 |
| 1913.0 | 32 |
| 1914.0 | 31 |
| 1915.0 | 30 |
| 1916.0 | 29 |
| 1917.0 | 30 |
| 1918.0 | 31 |
| 1919.0 | 30 |
| 1920.0 | 31 |
| 1921.0 | 30 |
| 1922.0 | 31 |
| 1923.0 | 32 |
| 1924.0 | 33 |
| 1925.0 | 34 |
| 1926.0 | 33 |
| 1927.0 | 32 |
| 1928.0 | 33 |
| 1929.0 | 34 |
| 1930.0 | 33 |
| 1931.0 | 32 |
| 1932.0 | 33 |
| 1933.0 | 32 |
| 1934.0 | 31 |
| 1935.0 | 32 |
| 1936.0 | 33 |
| 1937.0 | 34 |
| 1938.0 | 33 |
| 1939.0 | 32 |
| 1940.0 | 31 |
| 1941.0 | 30 |
| 1942.0 | 31 |
| 1943.0 | 30 |
| 1944.0 | 29 |
| 1945.0 | 30 |
| 1946.0 | 29 |
| 1947.0 | 30 |
| 1948.0 | 29 |
| 1949.0 | 30 |
| 1950.0 | 31 |
| 1951.0 | 30 |
| 1952.0 | 31 |
| 1953.0 | 32 |
| 1954.0 | 31 |
| 1955.0 | 32 |
| 1956.0 | 33 |
| 1957.0 | 34 |
| 1958.0 | 35 |
| 1959.0 | 34 |
| 1960.0 | 33 |
| 1961.0 | 32 |
| 1962.0 | 33 |
| 1963.0 | 32 |
| 1964.0 | 33 |
| 1965.0 | 34 |
| 1966.0 | 33 |
| 1967.0 | 34 |
| 1968.0 | 33 |
| 1969.0 | 32 |
| 1970.0 | 33 |
| 1971.0 | 32 |
| 1972.0 | 33 |
| 1973.0 | 32 |
| 1974.0 | 31 |
| 1975.0 | 32 |
| 1976.0 | 33 |
| 1977.0 | 32 |
| 1978.0 | 33 |
| 1979.0 | 32 |
| 1980.0 | 33 |
| 1981.0 | 34 |
| 1982.0 | 35 |
| 1983.0 | 36 |
| 1984.0 | 37 |
| 1985.0 | 36 |
| 1986.0 | 37 |
| 1987.0 | 38 |
| 1988.0 | 37 |
| 1989.0 | 36 |
| 1990.0 | 37 |
| 1991.0 | 36 |
| 1992.0 | 37 |
| 1993.0 | 36 |
| 1994.0 | 37 |
| 1995.0 | 38 |
| 1996.0 | 37 |
| 1997.0 | 36 |
| 1998.0 | 37 |
| 1999.0 | 38 |
| 2000.0 | 37 |
| 2001.0 | 38 |
| 2002.0 | 37 |
| 2003.0 | 38 |
| 2004.0 | 37 |
| 2005.0 | 36 |
| 2006.0 | 35 |
| 2007.0 | 34 |
| 2008.0 | 35 |
| 2009.0 | 36 |
| 2010.0 | 37 |
| 2011.0 | 36 |
| 2012.0 | 37 |
| 2013.0 | 36 |
| 2014.0 | 37 |
| 2015.0 | 38 |
| 2016.0 | 37 |
| 2017.0 | 36 |
| 2018.0 | 35 |
| 2019.0 | 34 |
| 2020.0 | 33 |
| 2021.0 | 32 |
| 2022.0 | 33 |
| 2023.0 | 32 |
| 2024.0 | 31 |
| 2025.0 | 32 |
| 2026.0 | 33 |
| 2027.0 | 32 |
| 2028.0 | 33 |
| 2029.0 | 34 |
| 2030.0 | 33 |
| 2031.0 | 32 |
| 2032.0 | 31 |
| 2033.0 | 32 |
| 2034.0 | 33 |
| 2035.0 | 32 |
| 2036.0 | 31 |
| 2037.0 | 32 |
| 2038.0 | 31 |
| 2039.0 | 32 |
| 2040.0 | 33 |
| 2041.0 | 32 |
| 2042.0 | 33 |
| 2043.0 | 32 |
| 2044.0 | 31 |
| 2045.0 | 32 |
| 2046.0 | 33 |
| 2047.0 | 32 |
| 2048.0 | 33 |
| 2049.0 | 34 |
| 2050.0 | 33 |
| 2051.0 | 32 |
| 2052.0 | 31 |
| 2053.0 | 32 |
| 2054.0 | 33 |
| 2055.0 | 32 |
| 2056.0 | 33 |
| 2057.0 | 34 |
| 2058.0 | 35 |
| 2059.0 | 36 |
| 2060.0 | 35 |
| 2061.0 | 34 |
| 2062.0 | 35 |
| 2063.0 | 34 |
| 2064.0 | 35 |
| 2065.0 | 34 |
| 2066.0 | 33 |
| 2067.0 | 32 |
| 2068.0 | 33 |
| 2069.0 | 32 |
| 2070.0 | 33 |
| 2071.0 | 34 |
| 2072.0 | 33 |
| 2073.0 | 34 |
| 2074.0 | 33 |
| 2075.0 | 34 |
| 2076.0 | 35 |
| 2077.0 | 36 |
| 2078.0 | 35 |
| 2079.0 | 36 |
| 2080.0 | 35 |
| 2081.0 | 34 |
| 2082.0 | 35 |
| 2083.0 | 34 |
| 2084.0 | 35 |
| 2085.0 | 36 |
| 2086.0 | 35 |
| 2087.0 | 34 |
| 2088.0 | 35 |
| 2089.0 | 34 |
| 2090.0 | 35 |
| 2091.0 | 34 |
| 2092.0 | 33 |
| 2093.0 | 32 |
| 2094.0 | 33 |
| 2095.0 | 34 |
| 2096.0 | 35 |
| 2097.0 | 36 |
| 2098.0 | 37 |
| 2099.0 | 36 |
| 2100.0 | 37 |
| 2101.0 | 36 |
| 2102.0 | 37 |
| 2103.0 | 36 |
| 2104.0 | 35 |
| 2105.0 | 36 |
| 2106.0 | 37 |
| 2107.0 | 36 |
| 2108.0 | 35 |
| 2109.0 | 34 |
| 2110.0 | 33 |
| 2111.0 | 34 |
| 2112.0 | 33 |
| 2113.0 | 32 |
| 2114.0 | 31 |
| 2115.0 | 32 |
| 2116.0 | 31 |
| 2117.0 | 30 |
| 2118.0 | 31 |
| 2119.0 | 32 |
| 2120.0 | 31 |
| 2121.0 | 30 |
| 2122.0 | 31 |
| 2123.0 | 32 |
| 2124.0 | 33 |
| 2125.0 | 32 |
| 2126.0 | 33 |
| 2127.0 | 32 |
| 2128.0 | 33 |
| 2129.0 | 34 |
| 2130.0 | 33 |
| 2131.0 | 34 |
| 2132.0 | 33 |
| 2133.0 | 32 |
| 2134.0 | 33 |
| 2135.0 | 34 |
| 2136.0 | 33 |
| 2137.0 | 32 |
| 2138.0 | 33 |
| 2139.0 | 32 |
| 2140.0 | 31 |
| 2141.0 | 32 |
| 2142.0 | 33 |
| 2143.0 | 34 |
| 2144.0 | 33 |
| 2145.0 | 32 |
| 2146.0 | 33 |
| 2147.0 | 34 |
| 2148.0 | 33 |
| 2149.0 | 32 |
| 2150.0 | 31 |
| 2151.0 | 30 |
| 2152.0 | 29 |
| 2153.0 | 30 |
| 2154.0 | 31 |
| 2155.0 | 32 |
| 2156.0 | 31 |
| 2157.0 | 30 |
| 2158.0 | 29 |
| 2159.0 | 28 |
| 2160.0 | 29 |
| 2161.0 | 28 |
| 2162.0 | 29 |
| 2163.0 | 30 |
| 2164.0 | 31 |
| 2165.0 | 32 |
| 2166.0 | 33 |
| 2167.0 | 32 |
| 2168.0 | 33 |
| 2169.0 | 32 |
| 2170.0 | 33 |
| 2171.0 | 32 |
| 2172.0 | 31 |
| 2173.0 | 32 |
| 2174.0 | 31 |
| 2175.0 | 32 |
| 2176.0 | 31 |
| 2177.0 | 32 |
| 2178.0 | 33 |
| 2179.0 | 32 |
| 2180.0 | 33 |
| 2181.0 | 32 |
| 2182.0 | 33 |
| 2183.0 | 34 |
| 2184.0 | 35 |
| 2185.0 | 36 |
| 2186.0 | 35 |
| 2187.0 | 34 |
| 2188.0 | 33 |
| 2189.0 | 34 |
| 2190.0 | 33 |
| 2191.0 | 34 |
| 2192.0 | 33 |
| 2193.0 | 32 |
| 2194.0 | 31 |
| 2195.0 | 30 |
| 2196.0 | 29 |
| 2197.0 | 30 |
| 2198.0 | 29 |
| 2199.0 | 28 |
| 2200.0 | 29 |
| 2201.0 | 30 |
| 2202.0 | 31 |
| 2203.0 | 32 |
| 2204.0 | 31 |
| 2205.0 | 30 |
| 2206.0 | 29 |
| 2207.0 | 30 |
| 2208.0 | 31 |
| 2209.0 | 32 |
| 2210.0 | 31 |
| 2211.0 | 30 |
| 2212.0 | 31 |
| 2213.0 | 30 |
| 2214.0 | 29 |
| 2215.0 | 30 |
| 2216.0 | 29 |
| 2217.0 | 30 |
| 2218.0 | 31 |
| 2219.0 | 30 |
| 2220.0 | 31 |
| 2221.0 | 32 |
| 2222.0 | 31 |
| 2223.0 | 30 |
| 2224.0 | 29 |
| 2225.0 | 30 |
| 2226.0 | 29 |
| 2227.0 | 30 |
| 2228.0 | 31 |
| 2229.0 | 30 |
| 2230.0 | 29 |
| 2231.0 | 30 |
| 2232.0 | 29 |
| 2233.0 | 28 |
| 2234.0 | 29 |
| 2235.0 | 28 |
| 2236.0 | 29 |
| 2237.0 | 28 |
| 2238.0 | 29 |
| 2239.0 | 30 |
| 2240.0 | 31 |
| 2241.0 | 30 |
| 2242.0 | 31 |
| 2243.0 | 30 |
| 2244.0 | 31 |
| 2245.0 | 30 |
| 2246.0 | 31 |
| 2247.0 | 30 |
| 2248.0 | 29 |
| 2249.0 | 28 |
| 2250.0 | 27 |
| 2251.0 | 28 |
| 2252.0 | 27 |
| 2253.0 | 28 |
| 2254.0 | 27 |
| 2255.0 | 26 |
| 2256.0 | 27 |
| 2257.0 | 28 |
| 2258.0 | 29 |
| 2259.0 | 30 |
| 2260.0 | 31 |
| 2261.0 | 32 |
| 2262.0 | 33 |
| 2263.0 | 34 |
| 2264.0 | 33 |
| 2265.0 | 32 |
| 2266.0 | 33 |
| 2267.0 | 32 |
| 2268.0 | 31 |
| 2269.0 | 30 |
| 2270.0 | 29 |
| 2271.0 | 30 |
| 2272.0 | 29 |
| 2273.0 | 28 |
| 2274.0 | 29 |
| 2275.0 | 30 |
| 2276.0 | 31 |
| 2277.0 | 30 |
| 2278.0 | 29 |
| 2279.0 | 30 |
| 2280.0 | 29 |
| 2281.0 | 28 |
| 2282.0 | 27 |
| 2283.0 | 28 |
| 2284.0 | 27 |
| 2285.0 | 28 |
| 2286.0 | 27 |
| 2287.0 | 26 |
| 2288.0 | 27 |
| 2289.0 | 28 |
| 2290.0 | 29 |
| 2291.0 | 28 |
| 2292.0 | 27 |
| 2293.0 | 26 |
| 2294.0 | 27 |
| 2295.0 | 28 |
| 2296.0 | 27 |
| 2297.0 | 28 |
| 2298.0 | 29 |
| 2299.0 | 30 |
| 2300.0 | 31 |
| 2301.0 | 30 |
| 2302.0 | 31 |
| 2303.0 | 30 |
| 2304.0 | 29 |
| 2305.0 | 30 |
| 2306.0 | 29 |
| 2307.0 | 30 |
| 2308.0 | 29 |
| 2309.0 | 28 |
| 2310.0 | 27 |
| 2311.0 | 28 |
| 2312.0 | 29 |
| 2313.0 | 30 |
| 2314.0 | 31 |
| 2315.0 | 32 |
| 2316.0 | 31 |
| 2317.0 | 32 |
| 2318.0 | 33 |
| 2319.0 | 32 |
| 2320.0 | 31 |
| 2321.0 | 30 |
| 2322.0 | 31 |
| 2323.0 | 30 |
| 2324.0 | 31 |
| 2325.0 | 30 |
| 2326.0 | 31 |
| 2327.0 | 30 |
| 2328.0 | 29 |
| 2329.0 | 28 |
| 2330.0 | 27 |
| 2331.0 | 26 |
| 2332.0 | 27 |
| 2333.0 | 28 |
| 2334.0 | 27 |
| 2335.0 | 26 |
| 2336.0 | 27 |
| 2337.0 | 28 |
| 2338.0 | 27 |
| 2339.0 | 26 |
| 2340.0 | 25 |
| 2341.0 | 24 |
| 2342.0 | 23 |
| 2343.0 | 24 |
| 2344.0 | 23 |
| 2345.0 | 24 |
| 2346.0 | 23 |
| 2347.0 | 24 |
| 2348.0 | 25 |
| 2349.0 | 26 |
| 2350.0 | 25 |
| 2351.0 | 24 |
| 2352.0 | 25 |
| 2353.0 | 26 |
| 2354.0 | 25 |
| 2355.0 | 26 |
| 2356.0 | 27 |
| 2357.0 | 26 |
| 2358.0 | 27 |
| 2359.0 | 26 |
| 2360.0 | 27 |
| 2361.0 | 26 |
| 2362.0 | 27 |
| 2363.0 | 28 |
| 2364.0 | 29 |
| 2365.0 | 28 |
| 2366.0 | 29 |
| 2367.0 | 28 |
| 2368.0 | 29 |
| 2369.0 | 30 |
| 2370.0 | 29 |
| 2371.0 | 30 |
| 2372.0 | 29 |
| 2373.0 | 28 |
| 2374.0 | 27 |
| 2375.0 | 28 |
| 2376.0 | 29 |
| 2377.0 | 28 |
| 2378.0 | 29 |
| 2379.0 | 30 |
| 2380.0 | 29 |
| 2381.0 | 28 |
| 2382.0 | 29 |
| 2383.0 | 28 |
| 2384.0 | 27 |
| 2385.0 | 28 |
| 2386.0 | 27 |
| 2387.0 | 28 |
| 2388.0 | 27 |
| 2389.0 | 28 |
| 2390.0 | 29 |
| 2391.0 | 30 |
| 2392.0 | 29 |
| 2393.0 | 30 |
| 2394.0 | 31 |
| 2395.0 | 30 |
| 2396.0 | 29 |
| 2397.0 | 30 |
| 2398.0 | 31 |
| 2399.0 | 30 |
| 2400.0 | 31 |
| 2401.0 | 30 |
| 2402.0 | 31 |
| 2403.0 | 30 |
| 2404.0 | 31 |
| 2405.0 | 32 |
| 2406.0 | 31 |
| 2407.0 | 32 |
| 2408.0 | 31 |
| 2409.0 | 32 |
| 2410.0 | 33 |
| 2411.0 | 34 |
| 2412.0 | 33 |
| 2413.0 | 32 |
| 2414.0 | 31 |
| 2415.0 | 32 |
| 2416.0 | 33 |
| 2417.0 | 32 |
| 2418.0 | 31 |
| 2419.0 | 30 |
| 2420.0 | 31 |
| 2421.0 | 30 |
| 2422.0 | 29 |
| 2423.0 | 30 |
| 2424.0 | 29 |
| 2425.0 | 28 |
| 2426.0 | 27 |
| 2427.0 | 26 |
| 2428.0 | 27 |
| 2429.0 | 26 |
| 2430.0 | 27 |
| 2431.0 | 26 |
| 2432.0 | 25 |
| 2433.0 | 26 |
| 2434.0 | 25 |
| 2435.0 | 26 |
| 2436.0 | 27 |
| 2437.0 | 28 |
| 2438.0 | 29 |
| 2439.0 | 28 |
| 2440.0 | 27 |
| 2441.0 | 26 |
| 2442.0 | 27 |
| 2443.0 | 28 |
| 2444.0 | 27 |
| 2445.0 | 28 |
| 2446.0 | 29 |
| 2447.0 | 28 |
| 2448.0 | 29 |
| 2449.0 | 30 |
| 2450.0 | 29 |
| 2451.0 | 30 |
| 2452.0 | 29 |
| 2453.0 | 30 |
| 2454.0 | 31 |
| 2455.0 | 32 |
| 2456.0 | 33 |
| 2457.0 | 32 |
| 2458.0 | 33 |
| 2459.0 | 32 |
| 2460.0 | 33 |
| 2461.0 | 34 |
| 2462.0 | 33 |
| 2463.0 | 34 |
| 2464.0 | 35 |
| 2465.0 | 34 |
| 2466.0 | 35 |
| 2467.0 | 36 |
| 2468.0 | 37 |
| 2469.0 | 38 |
| 2470.0 | 39 |
| 2471.0 | 40 |
| 2472.0 | 39 |
| 2473.0 | 40 |
| 2474.0 | 41 |
| 2475.0 | 40 |
| 2476.0 | 41 |
| 2477.0 | 42 |
| 2478.0 | 43 |
| 2479.0 | 42 |
| 2480.0 | 41 |
| 2481.0 | 42 |
| 2482.0 | 43 |
| 2483.0 | 44 |
| 2484.0 | 43 |
| 2485.0 | 42 |
| 2486.0 | 41 |
| 2487.0 | 42 |
| 2488.0 | 41 |
| 2489.0 | 40 |
| 2490.0 | 41 |
| 2491.0 | 42 |
| 2492.0 | 41 |
| 2493.0 | 40 |
| 2494.0 | 39 |
| 2495.0 | 38 |
| 2496.0 | 39 |
| 2497.0 | 40 |
| 2498.0 | 39 |
| 2499.0 | 38 |
| 2500.0 | 37 |
| 2501.0 | 38 |
| 2502.0 | 39 |
| 2503.0 | 38 |
| 2504.0 | 39 |
| 2505.0 | 40 |
| 2506.0 | 41 |
| 2507.0 | 42 |
| 2508.0 | 43 |
| 2509.0 | 44 |
| 2510.0 | 45 |
| 2511.0 | 44 |
| 2512.0 | 45 |
| 2513.0 | 46 |
| 2514.0 | 47 |
| 2515.0 | 46 |
| 2516.0 | 45 |
| 2517.0 | 44 |
| 2518.0 | 45 |
| 2519.0 | 46 |
| 2520.0 | 45 |
| 2521.0 | 44 |
| 2522.0 | 45 |
| 2523.0 | 46 |
| 2524.0 | 47 |
| 2525.0 | 46 |
| 2526.0 | 45 |
| 2527.0 | 44 |
| 2528.0 | 43 |
| 2529.0 | 44 |
| 2530.0 | 45 |
| 2531.0 | 46 |
| 2532.0 | 47 |
| 2533.0 | 46 |
| 2534.0 | 47 |
| 2535.0 | 48 |
| 2536.0 | 47 |
| 2537.0 | 46 |
| 2538.0 | 47 |
| 2539.0 | 46 |
| 2540.0 | 45 |
| 2541.0 | 44 |
| 2542.0 | 45 |
| 2543.0 | 46 |
| 2544.0 | 45 |
| 2545.0 | 46 |
| 2546.0 | 45 |
| 2547.0 | 46 |
| 2548.0 | 47 |
| 2549.0 | 48 |
| 2550.0 | 47 |
| 2551.0 | 46 |
| 2552.0 | 47 |
| 2553.0 | 46 |
| 2554.0 | 45 |
| 2555.0 | 46 |
| 2556.0 | 45 |
| 2557.0 | 44 |
| 2558.0 | 45 |
| 2559.0 | 46 |
| 2560.0 | 47 |
| 2561.0 | 46 |
| 2562.0 | 47 |
| 2563.0 | 46 |
| 2564.0 | 47 |
| 2565.0 | 48 |
| 2566.0 | 47 |
| 2567.0 | 46 |
| 2568.0 | 45 |
| 2569.0 | 44 |
| 2570.0 | 43 |
| 2571.0 | 44 |
| 2572.0 | 43 |
| 2573.0 | 42 |
| 2574.0 | 43 |
| 2575.0 | 42 |
| 2576.0 | 41 |
| 2577.0 | 40 |
| 2578.0 | 41 |
| 2579.0 | 40 |
| 2580.0 | 41 |
| 2581.0 | 40 |
| 2582.0 | 41 |
| 2583.0 | 42 |
| 2584.0 | 41 |
| 2585.0 | 40 |
| 2586.0 | 39 |
| 2587.0 | 38 |
| 2588.0 | 39 |
| 2589.0 | 40 |
| 2590.0 | 41 |
| 2591.0 | 40 |
| 2592.0 | 41 |
| 2593.0 | 42 |
| 2594.0 | 43 |
| 2595.0 | 44 |
| 2596.0 | 45 |
| 2597.0 | 46 |
| 2598.0 | 45 |
| 2599.0 | 46 |
| 2600.0 | 47 |
| 2601.0 | 46 |
| 2602.0 | 45 |
| 2603.0 | 46 |
| 2604.0 | 47 |
| 2605.0 | 46 |
| 2606.0 | 47 |
| 2607.0 | 48 |
| 2608.0 | 47 |
| 2609.0 | 46 |
| 2610.0 | 47 |
| 2611.0 | 46 |
| 2612.0 | 47 |
| 2613.0 | 46 |
| 2614.0 | 47 |
| 2615.0 | 48 |
| 2616.0 | 49 |
| 2617.0 | 48 |
| 2618.0 | 47 |
| 2619.0 | 46 |
| 2620.0 | 45 |
| 2621.0 | 46 |
| 2622.0 | 45 |
| 2623.0 | 44 |
| 2624.0 | 43 |
| 2625.0 | 42 |
| 2626.0 | 41 |
| 2627.0 | 42 |
| 2628.0 | 41 |
| 2629.0 | 40 |
| 2630.0 | 41 |
| 2631.0 | 42 |
| 2632.0 | 43 |
| 2633.0 | 42 |
| 2634.0 | 43 |
| 2635.0 | 44 |
| 2636.0 | 45 |
| 2637.0 | 46 |
| 2638.0 | 47 |
| 2639.0 | 48 |
| 2640.0 | 49 |
| 2641.0 | 50 |
| 2642.0 | 49 |
| 2643.0 | 48 |
| 2644.0 | 49 |
| 2645.0 | 50 |
| 2646.0 | 51 |
| 2647.0 | 50 |
| 2648.0 | 51 |
| 2649.0 | 52 |
| 2650.0 | 51 |
| 2651.0 | 50 |
| 2652.0 | 49 |
| 2653.0 | 50 |
| 2654.0 | 51 |
| 2655.0 | 52 |
| 2656.0 | 53 |
| 2657.0 | 54 |
| 2658.0 | 55 |
| 2659.0 | 54 |
| 2660.0 | 55 |
| 2661.0 | 54 |
| 2662.0 | 55 |
| 2663.0 | 56 |
| 2664.0 | 55 |
| 2665.0 | 54 |
| 2666.0 | 55 |
| 2667.0 | 54 |
| 2668.0 | 53 |
| 2669.0 | 54 |
| 2670.0 | 55 |
| 2671.0 | 56 |
| 2672.0 | 57 |
| 2673.0 | 56 |
| 2674.0 | 55 |
| 2675.0 | 56 |
| 2676.0 | 57 |
| 2677.0 | 56 |
| 2678.0 | 57 |
| 2679.0 | 56 |
| 2680.0 | 57 |
| 2681.0 | 58 |
| 2682.0 | 59 |
| 2683.0 | 60 |
| 2684.0 | 61 |
| 2685.0 | 62 |
| 2686.0 | 63 |
| 2687.0 | 64 |
| 2688.0 | 65 |
| 2689.0 | 64 |
| 2690.0 | 63 |
| 2691.0 | 64 |
| 2692.0 | 63 |
| 2693.0 | 64 |
| 2694.0 | 65 |
| 2695.0 | 64 |
| 2696.0 | 63 |
| 2697.0 | 64 |
| 2698.0 | 63 |
| 2699.0 | 64 |
| 2700.0 | 63 |
| 2701.0 | 64 |
| 2702.0 | 63 |
| 2703.0 | 64 |
| 2704.0 | 65 |
| 2705.0 | 64 |
| 2706.0 | 65 |
| 2707.0 | 64 |
| 2708.0 | 65 |
| 2709.0 | 64 |
| 2710.0 | 65 |
| 2711.0 | 66 |
| 2712.0 | 67 |
| 2713.0 | 66 |
| 2714.0 | 65 |
| 2715.0 | 66 |
| 2716.0 | 67 |
| 2717.0 | 66 |
| 2718.0 | 65 |
| 2719.0 | 64 |
| 2720.0 | 63 |
| 2721.0 | 62 |
| 2722.0 | 61 |
| 2723.0 | 60 |
| 2724.0 | 61 |
| 2725.0 | 60 |
| 2726.0 | 59 |
| 2727.0 | 58 |
| 2728.0 | 59 |
| 2729.0 | 60 |
| 2730.0 | 61 |
| 2731.0 | 60 |
| 2732.0 | 59 |
| 2733.0 | 60 |
| 2734.0 | 61 |
| 2735.0 | 60 |
| 2736.0 | 59 |
| 2737.0 | 60 |
| 2738.0 | 59 |
| 2739.0 | 60 |
| 2740.0 | 61 |
| 2741.0 | 62 |
| 2742.0 | 61 |
| 2743.0 | 62 |
| 2744.0 | 61 |
| 2745.0 | 60 |
| 2746.0 | 59 |
| 2747.0 | 58 |
| 2748.0 | 57 |
| 2749.0 | 56 |
| 2750.0 | 55 |
| 2751.0 | 56 |
| 2752.0 | 55 |
| 2753.0 | 54 |
| 2754.0 | 53 |
| 2755.0 | 54 |
| 2756.0 | 53 |
| 2757.0 | 52 |
| 2758.0 | 51 |
| 2759.0 | 50 |
| 2760.0 | 51 |
| 2761.0 | 50 |
| 2762.0 | 49 |
| 2763.0 | 50 |
| 2764.0 | 49 |
| 2765.0 | 50 |
| 2766.0 | 51 |
| 2767.0 | 50 |
| 2768.0 | 51 |
| 2769.0 | 52 |
| 2770.0 | 53 |
| 2771.0 | 52 |
| 2772.0 | 51 |
| 2773.0 | 52 |
| 2774.0 | 53 |
| 2775.0 | 52 |
| 2776.0 | 51 |
| 2777.0 | 52 |
| 2778.0 | 53 |
| 2779.0 | 54 |
| 2780.0 | 53 |
| 2781.0 | 54 |
| 2782.0 | 55 |
| 2783.0 | 56 |
| 2784.0 | 57 |
| 2785.0 | 58 |
| 2786.0 | 57 |
| 2787.0 | 56 |
| 2788.0 | 55 |
| 2789.0 | 54 |
| 2790.0 | 53 |
| 2791.0 | 52 |
| 2792.0 | 53 |
| 2793.0 | 54 |
| 2794.0 | 55 |
| 2795.0 | 56 |
| 2796.0 | 57 |
| 2797.0 | 58 |
| 2798.0 | 57 |
| 2799.0 | 56 |
| 2800.0 | 55 |
| 2801.0 | 56 |
| 2802.0 | 55 |
| 2803.0 | 54 |
| 2804.0 | 55 |
| 2805.0 | 56 |
| 2806.0 | 57 |
| 2807.0 | 58 |
| 2808.0 | 57 |
| 2809.0 | 58 |
| 2810.0 | 59 |
| 2811.0 | 58 |
| 2812.0 | 59 |
| 2813.0 | 60 |
| 2814.0 | 59 |
| 2815.0 | 58 |
| 2816.0 | 59 |
| 2817.0 | 58 |
| 2818.0 | 59 |
| 2819.0 | 60 |
| 2820.0 | 59 |
| 2821.0 | 60 |
| 2822.0 | 61 |
| 2823.0 | 60 |
| 2824.0 | 61 |
| 2825.0 | 62 |
| 2826.0 | 61 |
| 2827.0 | 60 |
| 2828.0 | 61 |
| 2829.0 | 60 |
| 2830.0 | 61 |
| 2831.0 | 62 |
| 2832.0 | 61 |
| 2833.0 | 62 |
| 2834.0 | 63 |
| 2835.0 | 62 |
| 2836.0 | 61 |
| 2837.0 | 62 |
| 2838.0 | 63 |
| 2839.0 | 64 |
| 2840.0 | 65 |
| 2841.0 | 66 |
| 2842.0 | 65 |
| 2843.0 | 66 |
| 2844.0 | 65 |
| 2845.0 | 64 |
| 2846.0 | 65 |
| 2847.0 | 66 |
| 2848.0 | 65 |
| 2849.0 | 66 |
| 2850.0 | 67 |
| 2851.0 | 66 |
| 2852.0 | 67 |
| 2853.0 | 68 |
| 2854.0 | 69 |
| 2855.0 | 70 |
| 2856.0 | 71 |
| 2857.0 | 72 |
| 2858.0 | 71 |
| 2859.0 | 72 |
| 2860.0 | 71 |
| 2861.0 | 70 |
| 2862.0 | 69 |
| 2863.0 | 68 |
| 2864.0 | 67 |
| 2865.0 | 66 |
| 2866.0 | 67 |
| 2867.0 | 68 |
| 2868.0 | 67 |
| 2869.0 | 68 |
| 2870.0 | 69 |
| 2871.0 | 70 |
| 2872.0 | 69 |
| 2873.0 | 70 |
| 2874.0 | 69 |
| 2875.0 | 70 |
| 2876.0 | 71 |
| 2877.0 | 72 |
| 2878.0 | 73 |
| 2879.0 | 74 |
| 2880.0 | 75 |
| 2881.0 | 76 |
| 2882.0 | 77 |
| 2883.0 | 76 |
| 2884.0 | 77 |
| 2885.0 | 78 |
| 2886.0 | 79 |
| 2887.0 | 78 |
| 2888.0 | 79 |
| 2889.0 | 78 |
| 2890.0 | 79 |
| 2891.0 | 80 |
| 2892.0 | 81 |
| 2893.0 | 82 |
| 2894.0 | 81 |
| 2895.0 | 80 |
| 2896.0 | 81 |
| 2897.0 | 82 |
| 2898.0 | 81 |
| 2899.0 | 80 |
| 2900.0 | 79 |
| 2901.0 | 80 |
| 2902.0 | 81 |
| 2903.0 | 80 |
| 2904.0 | 81 |
| 2905.0 | 80 |
| 2906.0 | 81 |
| 2907.0 | 80 |
| 2908.0 | 79 |
| 2909.0 | 78 |
| 2910.0 | 79 |
| 2911.0 | 78 |
| 2912.0 | 79 |
| 2913.0 | 78 |
| 2914.0 | 79 |
| 2915.0 | 80 |
| 2916.0 | 79 |
| 2917.0 | 80 |
| 2918.0 | 81 |
| 2919.0 | 80 |
| 2920.0 | 79 |
| 2921.0 | 78 |
| 2922.0 | 77 |
| 2923.0 | 78 |
| 2924.0 | 77 |
| 2925.0 | 76 |
| 2926.0 | 75 |
| 2927.0 | 74 |
| 2928.0 | 75 |
| 2929.0 | 74 |
| 2930.0 | 73 |
| 2931.0 | 74 |
| 2932.0 | 73 |
| 2933.0 | 74 |
| 2934.0 | 75 |
| 2935.0 | 76 |
| 2936.0 | 75 |
| 2937.0 | 76 |
| 2938.0 | 75 |
| 2939.0 | 74 |
| 2940.0 | 75 |
| 2941.0 | 74 |
| 2942.0 | 75 |
| 2943.0 | 76 |
| 2944.0 | 77 |
| 2945.0 | 78 |
| 2946.0 | 79 |
| 2947.0 | 80 |
| 2948.0 | 79 |
| 2949.0 | 80 |
| 2950.0 | 79 |
| 2951.0 | 80 |
| 2952.0 | 79 |
| 2953.0 | 80 |
| 2954.0 | 79 |
| 2955.0 | 80 |
| 2956.0 | 79 |
| 2957.0 | 80 |
| 2958.0 | 79 |
| 2959.0 | 80 |
| 2960.0 | 79 |
| 2961.0 | 78 |
| 2962.0 | 77 |
| 2963.0 | 78 |
| 2964.0 | 79 |
| 2965.0 | 80 |
| 2966.0 | 79 |
| 2967.0 | 78 |
| 2968.0 | 77 |
| 2969.0 | 78 |
| 2970.0 | 77 |
| 2971.0 | 76 |
| 2972.0 | 77 |
| 2973.0 | 76 |
| 2974.0 | 75 |
| 2975.0 | 74 |
| 2976.0 | 75 |
| 2977.0 | 74 |
| 2978.0 | 75 |
| 2979.0 | 76 |
| 2980.0 | 75 |
| 2981.0 | 74 |
| 2982.0 | 73 |
| 2983.0 | 72 |
| 2984.0 | 71 |
| 2985.0 | 70 |
| 2986.0 | 69 |
| 2987.0 | 68 |
| 2988.0 | 69 |
| 2989.0 | 68 |
| 2990.0 | 69 |
| 2991.0 | 70 |
| 2992.0 | 71 |
| 2993.0 | 72 |
| 2994.0 | 73 |
| 2995.0 | 74 |
| 2996.0 | 75 |
| 2997.0 | 74 |
| 2998.0 | 73 |
| 2999.0 | 72 |
| 3000.0 | 73 |
| 3001.0 | 74 |
| 3002.0 | 75 |
| 3003.0 | 74 |
| 3004.0 | 75 |
| 3005.0 | 74 |
| 3006.0 | 73 |
| 3007.0 | 74 |
| 3008.0 | 75 |
| 3009.0 | 76 |
| 3010.0 | 75 |
| 3011.0 | 74 |
| 3012.0 | 73 |
| 3013.0 | 72 |
| 3014.0 | 73 |
| 3015.0 | 72 |
| 3016.0 | 71 |
| 3017.0 | 72 |
| 3018.0 | 71 |
| 3019.0 | 72 |
| 3020.0 | 71 |
| 3021.0 | 70 |
| 3022.0 | 71 |
| 3023.0 | 72 |
| 3024.0 | 71 |
| 3025.0 | 72 |
| 3026.0 | 73 |
| 3027.0 | 74 |
| 3028.0 | 73 |
| 3029.0 | 74 |
| 3030.0 | 75 |
| 3031.0 | 76 |
| 3032.0 | 75 |
| 3033.0 | 74 |
| 3034.0 | 73 |
| 3035.0 | 72 |
| 3036.0 | 71 |
| 3037.0 | 70 |
| 3038.0 | 71 |
| 3039.0 | 72 |
| 3040.0 | 71 |
| 3041.0 | 70 |
| 3042.0 | 71 |
| 3043.0 | 72 |
| 3044.0 | 73 |
| 3045.0 | 74 |
| 3046.0 | 75 |
| 3047.0 | 76 |
| 3048.0 | 75 |
| 3049.0 | 74 |
| 3050.0 | 73 |
| 3051.0 | 74 |
| 3052.0 | 75 |
| 3053.0 | 74 |
| 3054.0 | 75 |
| 3055.0 | 76 |
| 3056.0 | 75 |
| 3057.0 | 74 |
| 3058.0 | 73 |
| 3059.0 | 74 |
| 3060.0 | 73 |
| 3061.0 | 72 |
| 3062.0 | 73 |
| 3063.0 | 74 |
| 3064.0 | 75 |
| 3065.0 | 76 |
| 3066.0 | 75 |
| 3067.0 | 76 |
| 3068.0 | 77 |
| 3069.0 | 76 |
| 3070.0 | 75 |
| 3071.0 | 76 |
| 3072.0 | 75 |
| 3073.0 | 74 |
| 3074.0 | 73 |
| 3075.0 | 72 |
| 3076.0 | 73 |
| 3077.0 | 74 |
| 3078.0 | 73 |
| 3079.0 | 72 |
| 3080.0 | 71 |
| 3081.0 | 72 |
| 3082.0 | 73 |
| 3083.0 | 72 |
| 3084.0 | 71 |
| 3085.0 | 70 |
| 3086.0 | 71 |
| 3087.0 | 72 |
| 3088.0 | 71 |
| 3089.0 | 72 |
| 3090.0 | 73 |
| 3091.0 | 72 |
| 3092.0 | 73 |
| 3093.0 | 72 |
| 3094.0 | 73 |
| 3095.0 | 72 |
| 3096.0 | 73 |
| 3097.0 | 72 |
| 3098.0 | 73 |
| 3099.0 | 72 |
| 3100.0 | 73 |
| 3101.0 | 74 |
| 3102.0 | 73 |
| 3103.0 | 74 |
| 3104.0 | 73 |
| 3105.0 | 72 |
| 3106.0 | 71 |
| 3107.0 | 72 |
| 3108.0 | 73 |
| 3109.0 | 74 |
| 3110.0 | 75 |
| 3111.0 | 76 |
| 3112.0 | 75 |
| 3113.0 | 76 |
| 3114.0 | 77 |
| 3115.0 | 76 |
| 3116.0 | 77 |
| 3117.0 | 78 |
| 3118.0 | 77 |
| 3119.0 | 76 |
| 3120.0 | 75 |
| 3121.0 | 74 |
| 3122.0 | 73 |
| 3123.0 | 74 |
| 3124.0 | 73 |
| 3125.0 | 74 |
| 3126.0 | 73 |
| 3127.0 | 74 |
| 3128.0 | 73 |
| 3129.0 | 74 |
| 3130.0 | 75 |
| 3131.0 | 76 |
| 3132.0 | 75 |
| 3133.0 | 76 |
| 3134.0 | 77 |
| 3135.0 | 76 |
| 3136.0 | 77 |
| 3137.0 | 78 |
| 3138.0 | 77 |
| 3139.0 | 78 |
| 3140.0 | 77 |
| 3141.0 | 78 |
| 3142.0 | 77 |
| 3143.0 | 76 |
| 3144.0 | 75 |
| 3145.0 | 76 |
| 3146.0 | 75 |
| 3147.0 | 74 |
| 3148.0 | 75 |
| 3149.0 | 74 |
| 3150.0 | 75 |
| 3151.0 | 76 |
| 3152.0 | 77 |
| 3153.0 | 78 |
| 3154.0 | 79 |
| 3155.0 | 80 |
| 3156.0 | 79 |
| 3157.0 | 78 |
| 3158.0 | 77 |
| 3159.0 | 78 |
| 3160.0 | 77 |
| 3161.0 | 78 |
| 3162.0 | 79 |
| 3163.0 | 80 |
| 3164.0 | 79 |
| 3165.0 | 80 |
| 3166.0 | 79 |
| 3167.0 | 78 |
| 3168.0 | 79 |
| 3169.0 | 80 |
| 3170.0 | 79 |
| 3171.0 | 78 |
| 3172.0 | 77 |
| 3173.0 | 78 |
| 3174.0 | 77 |
| 3175.0 | 78 |
| 3176.0 | 79 |
| 3177.0 | 80 |
| 3178.0 | 79 |
| 3179.0 | 80 |
| 3180.0 | 81 |
| 3181.0 | 82 |
| 3182.0 | 81 |
| 3183.0 | 80 |
| 3184.0 | 79 |
| 3185.0 | 80 |
| 3186.0 | 81 |
| 3187.0 | 80 |
| 3188.0 | 81 |
| 3189.0 | 80 |
| 3190.0 | 79 |
| 3191.0 | 78 |
| 3192.0 | 77 |
| 3193.0 | 76 |
| 3194.0 | 75 |
| 3195.0 | 74 |
| 3196.0 | 73 |
| 3197.0 | 72 |
| 3198.0 | 73 |
| 3199.0 | 74 |
| 3200.0 | 75 |
| 3201.0 | 74 |
| 3202.0 | 75 |
| 3203.0 | 74 |
| 3204.0 | 73 |
| 3205.0 | 74 |
| 3206.0 | 75 |
| 3207.0 | 76 |
| 3208.0 | 75 |
| 3209.0 | 76 |
| 3210.0 | 77 |
| 3211.0 | 78 |
| 3212.0 | 77 |
| 3213.0 | 78 |
| 3214.0 | 77 |
| 3215.0 | 78 |
| 3216.0 | 77 |
| 3217.0 | 78 |
| 3218.0 | 79 |
| 3219.0 | 80 |
| 3220.0 | 79 |
| 3221.0 | 78 |
| 3222.0 | 79 |
| 3223.0 | 80 |
| 3224.0 | 79 |
| 3225.0 | 78 |
| 3226.0 | 77 |
| 3227.0 | 78 |
| 3228.0 | 79 |
| 3229.0 | 78 |
| 3230.0 | 79 |
| 3231.0 | 78 |
| 3232.0 | 79 |
| 3233.0 | 78 |
| 3234.0 | 77 |
| 3235.0 | 78 |
| 3236.0 | 77 |
| 3237.0 | 76 |
| 3238.0 | 75 |
| 3239.0 | 76 |
| 3240.0 | 75 |
| 3241.0 | 76 |
| 3242.0 | 77 |
| 3243.0 | 76 |
| 3244.0 | 75 |
| 3245.0 | 76 |
| 3246.0 | 77 |
| 3247.0 | 78 |
| 3248.0 | 77 |
| 3249.0 | 76 |
| 3250.0 | 77 |
| 3251.0 | 76 |
| 3252.0 | 77 |
| 3253.0 | 76 |
| 3254.0 | 77 |
| 3255.0 | 78 |
| 3256.0 | 79 |
| 3257.0 | 80 |
| 3258.0 | 79 |
| 3259.0 | 78 |
| 3260.0 | 77 |
| 3261.0 | 78 |
| 3262.0 | 77 |
| 3263.0 | 76 |
| 3264.0 | 75 |
| 3265.0 | 74 |
| 3266.0 | 75 |
| 3267.0 | 74 |
| 3268.0 | 75 |
| 3269.0 | 74 |
| 3270.0 | 75 |
| 3271.0 | 76 |
| 3272.0 | 77 |
| 3273.0 | 76 |
| 3274.0 | 75 |
| 3275.0 | 76 |
| 3276.0 | 77 |
| 3277.0 | 76 |
| 3278.0 | 75 |
| 3279.0 | 76 |
| 3280.0 | 75 |
| 3281.0 | 76 |
| 3282.0 | 77 |
| 3283.0 | 78 |
| 3284.0 | 79 |
| 3285.0 | 80 |
| 3286.0 | 81 |
| 3287.0 | 80 |
| 3288.0 | 79 |
| 3289.0 | 78 |
| 3290.0 | 77 |
| 3291.0 | 78 |
| 3292.0 | 79 |
| 3293.0 | 78 |
| 3294.0 | 77 |
| 3295.0 | 78 |
| 3296.0 | 79 |
| 3297.0 | 78 |
| 3298.0 | 77 |
| 3299.0 | 78 |
| 3300.0 | 77 |
| 3301.0 | 76 |
| 3302.0 | 75 |
| 3303.0 | 74 |
| 3304.0 | 73 |
| 3305.0 | 74 |
| 3306.0 | 73 |
| 3307.0 | 74 |
| 3308.0 | 73 |
| 3309.0 | 72 |
| 3310.0 | 73 |
| 3311.0 | 72 |
| 3312.0 | 71 |
| 3313.0 | 72 |
| 3314.0 | 71 |
| 3315.0 | 70 |
| 3316.0 | 71 |
| 3317.0 | 72 |
| 3318.0 | 71 |
| 3319.0 | 70 |
| 3320.0 | 71 |
| 3321.0 | 72 |
| 3322.0 | 73 |
| 3323.0 | 74 |
| 3324.0 | 75 |
| 3325.0 | 74 |
| 3326.0 | 73 |
| 3327.0 | 72 |
| 3328.0 | 73 |
| 3329.0 | 74 |
| 3330.0 | 73 |
| 3331.0 | 74 |
| 3332.0 | 75 |
| 3333.0 | 74 |
| 3334.0 | 73 |
| 3335.0 | 72 |
| 3336.0 | 71 |
| 3337.0 | 72 |
| 3338.0 | 71 |
| 3339.0 | 70 |
| 3340.0 | 71 |
| 3341.0 | 72 |
| 3342.0 | 73 |
| 3343.0 | 74 |
| 3344.0 | 73 |
| 3345.0 | 74 |
| 3346.0 | 75 |
| 3347.0 | 76 |
| 3348.0 | 77 |
| 3349.0 | 76 |
| 3350.0 | 77 |
| 3351.0 | 76 |
| 3352.0 | 77 |
| 3353.0 | 78 |
| 3354.0 | 79 |
| 3355.0 | 80 |
| 3356.0 | 81 |
| 3357.0 | 82 |
| 3358.0 | 81 |
| 3359.0 | 80 |
| 3360.0 | 79 |
| 3361.0 | 80 |
| 3362.0 | 79 |
| 3363.0 | 80 |
| 3364.0 | 79 |
| 3365.0 | 78 |
| 3366.0 | 77 |
| 3367.0 | 78 |
| 3368.0 | 77 |
| 3369.0 | 76 |
| 3370.0 | 75 |
| 3371.0 | 76 |
| 3372.0 | 75 |
| 3373.0 | 74 |
| 3374.0 | 73 |
| 3375.0 | 74 |
| 3376.0 | 75 |
| 3377.0 | 74 |
| 3378.0 | 73 |
| 3379.0 | 72 |
| 3380.0 | 73 |
| 3381.0 | 72 |
| 3382.0 | 71 |
| 3383.0 | 70 |
| 3384.0 | 71 |
| 3385.0 | 72 |
| 3386.0 | 73 |
| 3387.0 | 74 |
| 3388.0 | 75 |
| 3389.0 | 74 |
| 3390.0 | 75 |
| 3391.0 | 74 |
| 3392.0 | 73 |
| 3393.0 | 74 |
| 3394.0 | 73 |
| 3395.0 | 74 |
| 3396.0 | 73 |
| 3397.0 | 72 |
| 3398.0 | 73 |
| 3399.0 | 74 |
| 3400.0 | 75 |
| 3401.0 | 74 |
| 3402.0 | 73 |
| 3403.0 | 74 |
| 3404.0 | 75 |
| 3405.0 | 76 |
| 3406.0 | 77 |
| 3407.0 | 76 |
| 3408.0 | 75 |
| 3409.0 | 74 |
| 3410.0 | 75 |
| 3411.0 | 74 |
| 3412.0 | 73 |
| 3413.0 | 72 |
| 3414.0 | 71 |
| 3415.0 | 70 |
| 3416.0 | 69 |
| 3417.0 | 68 |
| 3418.0 | 69 |
| 3419.0 | 68 |
| 3420.0 | 67 |
| 3421.0 | 68 |
| 3422.0 | 69 |
| 3423.0 | 68 |
| 3424.0 | 69 |
| 3425.0 | 70 |
| 3426.0 | 69 |
| 3427.0 | 68 |
| 3428.0 | 69 |
| 3429.0 | 70 |
| 3430.0 | 71 |
| 3431.0 | 72 |
| 3432.0 | 73 |
| 3433.0 | 72 |
| 3434.0 | 71 |
| 3435.0 | 70 |
| 3436.0 | 69 |
| 3437.0 | 70 |
| 3438.0 | 69 |
| 3439.0 | 68 |
| 3440.0 | 69 |
| 3441.0 | 68 |
| 3442.0 | 69 |
| 3443.0 | 70 |
| 3444.0 | 69 |
| 3445.0 | 70 |
| 3446.0 | 71 |
| 3447.0 | 72 |
| 3448.0 | 71 |
| 3449.0 | 70 |
| 3450.0 | 69 |
| 3451.0 | 70 |
| 3452.0 | 69 |
| 3453.0 | 68 |
| 3454.0 | 67 |
| 3455.0 | 68 |
| 3456.0 | 69 |
| 3457.0 | 70 |
| 3458.0 | 71 |
| 3459.0 | 72 |
| 3460.0 | 71 |
| 3461.0 | 72 |
| 3462.0 | 73 |
| 3463.0 | 74 |
| 3464.0 | 75 |
| 3465.0 | 74 |
| 3466.0 | 73 |
| 3467.0 | 74 |
| 3468.0 | 73 |
| 3469.0 | 72 |
| 3470.0 | 73 |
| 3471.0 | 72 |
| 3472.0 | 73 |
| 3473.0 | 74 |
| 3474.0 | 75 |
| 3475.0 | 74 |
| 3476.0 | 75 |
| 3477.0 | 76 |
| 3478.0 | 77 |
| 3479.0 | 78 |
| 3480.0 | 79 |
| 3481.0 | 80 |
| 3482.0 | 79 |
| 3483.0 | 78 |
| 3484.0 | 79 |
| 3485.0 | 80 |
| 3486.0 | 81 |
| 3487.0 | 80 |
| 3488.0 | 81 |
| 3489.0 | 82 |
| 3490.0 | 81 |
| 3491.0 | 80 |
| 3492.0 | 79 |
| 3493.0 | 78 |
| 3494.0 | 77 |
| 3495.0 | 76 |
| 3496.0 | 75 |
| 3497.0 | 76 |
| 3498.0 | 77 |
| 3499.0 | 78 |
| 3500.0 | 77 |
| 3501.0 | 76 |
| 3502.0 | 77 |
| 3503.0 | 78 |
| 3504.0 | 77 |
| 3505.0 | 78 |
| 3506.0 | 79 |
| 3507.0 | 80 |
| 3508.0 | 79 |
| 3509.0 | 80 |
| 3510.0 | 79 |
| 3511.0 | 80 |
| 3512.0 | 81 |
| 3513.0 | 80 |
| 3514.0 | 81 |
| 3515.0 | 82 |
| 3516.0 | 83 |
| 3517.0 | 84 |
| 3518.0 | 83 |
| 3519.0 | 84 |
| 3520.0 | 83 |
| 3521.0 | 84 |
| 3522.0 | 85 |
| 3523.0 | 84 |
| 3524.0 | 85 |
| 3525.0 | 84 |
| 3526.0 | 85 |
| 3527.0 | 84 |
| 3528.0 | 83 |
| 3529.0 | 84 |
| 3530.0 | 85 |
| 3531.0 | 86 |
| 3532.0 | 87 |
| 3533.0 | 88 |
| 3534.0 | 89 |
| 3535.0 | 90 |
| 3536.0 | 89 |
| 3537.0 | 88 |
| 3538.0 | 89 |
| 3539.0 | 88 |
| 3540.0 | 87 |
| 3541.0 | 86 |
| 3542.0 | 85 |
| 3543.0 | 86 |
| 3544.0 | 87 |
| 3545.0 | 86 |
| 3546.0 | 85 |
| 3547.0 | 86 |
| 3548.0 | 87 |
| 3549.0 | 88 |
| 3550.0 | 87 |
| 3551.0 | 88 |
| 3552.0 | 89 |
| 3553.0 | 90 |
| 3554.0 | 91 |
| 3555.0 | 90 |
| 3556.0 | 91 |
| 3557.0 | 90 |
| 3558.0 | 89 |
| 3559.0 | 88 |
| 3560.0 | 89 |
| 3561.0 | 88 |
| 3562.0 | 89 |
| 3563.0 | 88 |
| 3564.0 | 87 |
| 3565.0 | 88 |
| 3566.0 | 87 |
| 3567.0 | 86 |
| 3568.0 | 87 |
| 3569.0 | 88 |
| 3570.0 | 87 |
| 3571.0 | 88 |
| 3572.0 | 87 |
| 3573.0 | 88 |
| 3574.0 | 89 |
| 3575.0 | 88 |
| 3576.0 | 87 |
| 3577.0 | 88 |
| 3578.0 | 89 |
| 3579.0 | 88 |
| 3580.0 | 89 |
| 3581.0 | 88 |
| 3582.0 | 87 |
| 3583.0 | 88 |
| 3584.0 | 87 |
| 3585.0 | 86 |
| 3586.0 | 87 |
| 3587.0 | 86 |
| 3588.0 | 87 |
| 3589.0 | 88 |
| 3590.0 | 89 |
| 3591.0 | 90 |
| 3592.0 | 91 |
| 3593.0 | 92 |
| 3594.0 | 91 |
| 3595.0 | 92 |
| 3596.0 | 93 |
| 3597.0 | 94 |
| 3598.0 | 93 |
| 3599.0 | 92 |
| 3600.0 | 93 |
| 3601.0 | 92 |
| 3602.0 | 93 |
| 3603.0 | 92 |
| 3604.0 | 91 |
| 3605.0 | 90 |
| 3606.0 | 91 |
| 3607.0 | 90 |
| 3608.0 | 91 |
| 3609.0 | 92 |
| 3610.0 | 93 |
| 3611.0 | 92 |
| 3612.0 | 91 |
| 3613.0 | 90 |
| 3614.0 | 91 |
| 3615.0 | 92 |
| 3616.0 | 93 |
| 3617.0 | 94 |
| 3618.0 | 95 |
| 3619.0 | 96 |
| 3620.0 | 95 |
| 3621.0 | 96 |
| 3622.0 | 97 |
| 3623.0 | 98 |
| 3624.0 | 97 |
| 3625.0 | 98 |
| 3626.0 | 97 |
| 3627.0 | 98 |
| 3628.0 | 97 |
| 3629.0 | 98 |
| 3630.0 | 97 |
| 3631.0 | 98 |
| 3632.0 | 97 |
| 3633.0 | 96 |
| 3634.0 | 97 |
| 3635.0 | 96 |
| 3636.0 | 95 |
| 3637.0 | 94 |
| 3638.0 | 95 |
| 3639.0 | 94 |
| 3640.0 | 95 |
| 3641.0 | 96 |
| 3642.0 | 95 |
| 3643.0 | 96 |
| 3644.0 | 97 |
| 3645.0 | 98 |
| 3646.0 | 99 |
| 3647.0 | 98 |
| 3648.0 | 99 |
| 3649.0 | 98 |
| 3650.0 | 97 |
| 3651.0 | 96 |
| 3652.0 | 95 |
| 3653.0 | 94 |
| 3654.0 | 93 |
| 3655.0 | 94 |
| 3656.0 | 93 |
| 3657.0 | 92 |
| 3658.0 | 93 |
| 3659.0 | 92 |
| 3660.0 | 91 |
| 3661.0 | 90 |
| 3662.0 | 91 |
| 3663.0 | 90 |
| 3664.0 | 91 |
| 3665.0 | 92 |
| 3666.0 | 93 |
| 3667.0 | 92 |
| 3668.0 | 93 |
| 3669.0 | 94 |
| 3670.0 | 95 |
| 3671.0 | 94 |
| 3672.0 | 95 |
| 3673.0 | 94 |
| 3674.0 | 93 |
| 3675.0 | 92 |
| 3676.0 | 93 |
| 3677.0 | 92 |
| 3678.0 | 91 |
| 3679.0 | 92 |
| 3680.0 | 93 |
| 3681.0 | 92 |
| 3682.0 | 91 |
| 3683.0 | 90 |
| 3684.0 | 89 |
| 3685.0 | 88 |
| 3686.0 | 87 |
| 3687.0 | 88 |
| 3688.0 | 87 |
| 3689.0 | 88 |
| 3690.0 | 87 |
| 3691.0 | 86 |
| 3692.0 | 87 |
| 3693.0 | 88 |
| 3694.0 | 87 |
| 3695.0 | 88 |
| 3696.0 | 89 |
| 3697.0 | 90 |
| 3698.0 | 91 |
| 3699.0 | 90 |
| 3700.0 | 91 |
| 3701.0 | 92 |
| 3702.0 | 93 |
| 3703.0 | 92 |
| 3704.0 | 93 |
| 3705.0 | 92 |
| 3706.0 | 91 |
| 3707.0 | 92 |
| 3708.0 | 93 |
| 3709.0 | 94 |
| 3710.0 | 95 |
| 3711.0 | 96 |
| 3712.0 | 95 |
| 3713.0 | 96 |
| 3714.0 | 95 |
| 3715.0 | 96 |
| 3716.0 | 95 |
| 3717.0 | 96 |
| 3718.0 | 95 |
| 3719.0 | 94 |
| 3720.0 | 95 |
| 3721.0 | 94 |
| 3722.0 | 95 |
| 3723.0 | 96 |
| 3724.0 | 95 |
| 3725.0 | 96 |
| 3726.0 | 95 |
| 3727.0 | 94 |
| 3728.0 | 95 |
| 3729.0 | 96 |
| 3730.0 | 97 |
| 3731.0 | 98 |
| 3732.0 | 97 |
| 3733.0 | 98 |
| 3734.0 | 97 |
| 3735.0 | 98 |
| 3736.0 | 97 |
| 3737.0 | 98 |
| 3738.0 | 99 |
| 3739.0 | 98 |
| 3740.0 | 99 |
| 3741.0 | 100 |
| 3742.0 | 101 |
| 3743.0 | 100 |
| 3744.0 | 101 |
| 3745.0 | 102 |
| 3746.0 | 101 |
| 3747.0 | 102 |
| 3748.0 | 103 |
| 3749.0 | 104 |
| 3750.0 | 103 |
| 3751.0 | 102 |
| 3752.0 | 103 |
| 3753.0 | 104 |
| 3754.0 | 103 |
| 3755.0 | 104 |
| 3756.0 | 103 |
| 3757.0 | 102 |
| 3758.0 | 103 |
| 3759.0 | 104 |
| 3760.0 | 103 |
| 3761.0 | 104 |
| 3762.0 | 103 |
| 3763.0 | 102 |
| 3764.0 | 103 |
| 3765.0 | 104 |
| 3766.0 | 103 |
| 3767.0 | 102 |
| 3768.0 | 101 |
| 3769.0 | 100 |
| 3770.0 | 101 |
| 3771.0 | 102 |
| 3772.0 | 101 |
| 3773.0 | 100 |
| 3774.0 | 99 |
| 3775.0 | 100 |
| 3776.0 | 101 |
| 3777.0 | 102 |
| 3778.0 | 103 |
| 3779.0 | 102 |
| 3780.0 | 101 |
| 3781.0 | 100 |
| 3782.0 | 99 |
| 3783.0 | 100 |
| 3784.0 | 101 |
| 3785.0 | 102 |
| 3786.0 | 101 |
| 3787.0 | 100 |
| 3788.0 | 99 |
| 3789.0 | 98 |
| 3790.0 | 99 |
| 3791.0 | 100 |
| 3792.0 | 101 |
| 3793.0 | 102 |
| 3794.0 | 103 |
| 3795.0 | 102 |
| 3796.0 | 103 |
| 3797.0 | 102 |
| 3798.0 | 103 |
| 3799.0 | 102 |
| 3800.0 | 101 |
| 3801.0 | 102 |
| 3802.0 | 101 |
| 3803.0 | 102 |
| 3804.0 | 101 |
| 3805.0 | 102 |
| 3806.0 | 103 |
| 3807.0 | 102 |
| 3808.0 | 101 |
| 3809.0 | 100 |
| 3810.0 | 101 |
| 3811.0 | 100 |
| 3812.0 | 99 |
| 3813.0 | 100 |
| 3814.0 | 99 |
| 3815.0 | 98 |
| 3816.0 | 97 |
| 3817.0 | 96 |
| 3818.0 | 95 |
| 3819.0 | 96 |
| 3820.0 | 97 |
| 3821.0 | 98 |
| 3822.0 | 97 |
| 3823.0 | 96 |
| 3824.0 | 95 |
| 3825.0 | 94 |
| 3826.0 | 95 |
| 3827.0 | 96 |
| 3828.0 | 97 |
| 3829.0 | 98 |
| 3830.0 | 97 |
| 3831.0 | 96 |
| 3832.0 | 95 |
| 3833.0 | 96 |
| 3834.0 | 95 |
| 3835.0 | 94 |
| 3836.0 | 95 |
| 3837.0 | 96 |
| 3838.0 | 95 |
| 3839.0 | 94 |
| 3840.0 | 93 |
| 3841.0 | 92 |
| 3842.0 | 93 |
| 3843.0 | 94 |
| 3844.0 | 95 |
| 3845.0 | 94 |
| 3846.0 | 95 |
| 3847.0 | 94 |
| 3848.0 | 93 |
| 3849.0 | 92 |
| 3850.0 | 93 |
| 3851.0 | 92 |
| 3852.0 | 91 |
| 3853.0 | 90 |
| 3854.0 | 89 |
| 3855.0 | 88 |
| 3856.0 | 87 |
| 3857.0 | 88 |
| 3858.0 | 87 |
| 3859.0 | 88 |
| 3860.0 | 89 |
| 3861.0 | 90 |
| 3862.0 | 91 |
| 3863.0 | 92 |
| 3864.0 | 93 |
| 3865.0 | 92 |
| 3866.0 | 93 |
| 3867.0 | 92 |
| 3868.0 | 91 |
| 3869.0 | 92 |
| 3870.0 | 93 |
| 3871.0 | 94 |
| 3872.0 | 95 |
| 3873.0 | 96 |
| 3874.0 | 95 |
| 3875.0 | 94 |
| 3876.0 | 95 |
| 3877.0 | 94 |
| 3878.0 | 93 |
| 3879.0 | 94 |
| 3880.0 | 95 |
| 3881.0 | 96 |
| 3882.0 | 97 |
| 3883.0 | 98 |
| 3884.0 | 97 |
| 3885.0 | 96 |
| 3886.0 | 95 |
| 3887.0 | 96 |
| 3888.0 | 97 |
| 3889.0 | 96 |
| 3890.0 | 95 |
| 3891.0 | 94 |
| 3892.0 | 93 |
| 3893.0 | 94 |
| 3894.0 | 95 |
| 3895.0 | 96 |
| 3896.0 | 97 |
| 3897.0 | 96 |
| 3898.0 | 97 |
| 3899.0 | 96 |
| 3900.0 | 95 |
| 3901.0 | 94 |
| 3902.0 | 95 |
| 3903.0 | 96 |
| 3904.0 | 95 |
| 3905.0 | 94 |
| 3906.0 | 93 |
| 3907.0 | 94 |
| 3908.0 | 95 |
| 3909.0 | 94 |
| 3910.0 | 95 |
| 3911.0 | 96 |
| 3912.0 | 97 |
| 3913.0 | 96 |
| 3914.0 | 97 |
| 3915.0 | 96 |
| 3916.0 | 97 |
| 3917.0 | 98 |
| 3918.0 | 99 |
| 3919.0 | 100 |
| 3920.0 | 99 |
| 3921.0 | 100 |
| 3922.0 | 99 |
| 3923.0 | 100 |
| 3924.0 | 99 |
| 3925.0 | 98 |
| 3926.0 | 99 |
| 3927.0 | 98 |
| 3928.0 | 97 |
| 3929.0 | 98 |
| 3930.0 | 99 |
| 3931.0 | 98 |
| 3932.0 | 97 |
| 3933.0 | 98 |
| 3934.0 | 99 |
| 3935.0 | 98 |
| 3936.0 | 99 |
| 3937.0 | 100 |
| 3938.0 | 99 |
| 3939.0 | 98 |
| 3940.0 | 97 |
| 3941.0 | 96 |
| 3942.0 | 97 |
| 3943.0 | 96 |
| 3944.0 | 97 |
| 3945.0 | 96 |
| 3946.0 | 97 |
| 3947.0 | 96 |
| 3948.0 | 97 |
| 3949.0 | 96 |
| 3950.0 | 95 |
| 3951.0 | 96 |
| 3952.0 | 95 |
| 3953.0 | 94 |
| 3954.0 | 95 |
| 3955.0 | 94 |
| 3956.0 | 93 |
| 3957.0 | 94 |
| 3958.0 | 95 |
| 3959.0 | 94 |
| 3960.0 | 93 |
| 3961.0 | 94 |
| 3962.0 | 93 |
| 3963.0 | 94 |
| 3964.0 | 95 |
| 3965.0 | 94 |
| 3966.0 | 93 |
| 3967.0 | 94 |
| 3968.0 | 93 |
| 3969.0 | 92 |
| 3970.0 | 91 |
| 3971.0 | 90 |
| 3972.0 | 91 |
| 3973.0 | 92 |
| 3974.0 | 91 |
| 3975.0 | 92 |
| 3976.0 | 93 |
| 3977.0 | 92 |
| 3978.0 | 91 |
| 3979.0 | 90 |
| 3980.0 | 91 |
| 3981.0 | 92 |
| 3982.0 | 93 |
| 3983.0 | 92 |
| 3984.0 | 93 |
| 3985.0 | 92 |
| 3986.0 | 91 |
| 3987.0 | 90 |
| 3988.0 | 89 |
| 3989.0 | 88 |
| 3990.0 | 87 |
| 3991.0 | 88 |
| 3992.0 | 89 |
| 3993.0 | 90 |
| 3994.0 | 89 |
| 3995.0 | 88 |
| 3996.0 | 87 |
| 3997.0 | 86 |
| 3998.0 | 87 |
| 3999.0 | 88 |
| 4000.0 | 89 |
| 4001.0 | 88 |
| 4002.0 | 87 |
| 4003.0 | 86 |
| 4004.0 | 87 |
| 4005.0 | 88 |
| 4006.0 | 89 |
| 4007.0 | 90 |
| 4008.0 | 91 |
| 4009.0 | 90 |
| 4010.0 | 89 |
| 4011.0 | 90 |
| 4012.0 | 89 |
| 4013.0 | 90 |
| 4014.0 | 89 |
| 4015.0 | 88 |
| 4016.0 | 89 |
| 4017.0 | 90 |
| 4018.0 | 89 |
| 4019.0 | 90 |
| 4020.0 | 91 |
| 4021.0 | 90 |
| 4022.0 | 91 |
| 4023.0 | 92 |
| 4024.0 | 93 |
| 4025.0 | 94 |
| 4026.0 | 95 |
| 4027.0 | 96 |
| 4028.0 | 95 |
| 4029.0 | 96 |
| 4030.0 | 95 |
| 4031.0 | 94 |
| 4032.0 | 95 |
| 4033.0 | 94 |
| 4034.0 | 93 |
| 4035.0 | 94 |
| 4036.0 | 95 |
| 4037.0 | 94 |
| 4038.0 | 95 |
| 4039.0 | 94 |
| 4040.0 | 95 |
| 4041.0 | 94 |
| 4042.0 | 95 |
| 4043.0 | 96 |
| 4044.0 | 97 |
| 4045.0 | 98 |
| 4046.0 | 99 |
| 4047.0 | 100 |
| 4048.0 | 101 |
| 4049.0 | 102 |
| 4050.0 | 103 |
| 4051.0 | 104 |
| 4052.0 | 105 |
| 4053.0 | 104 |
| 4054.0 | 105 |
| 4055.0 | 104 |
| 4056.0 | 105 |
| 4057.0 | 104 |
| 4058.0 | 105 |
| 4059.0 | 104 |
| 4060.0 | 103 |
| 4061.0 | 102 |
| 4062.0 | 101 |
| 4063.0 | 100 |
| 4064.0 | 99 |
| 4065.0 | 100 |
| 4066.0 | 101 |
| 4067.0 | 100 |
| 4068.0 | 99 |
| 4069.0 | 100 |
| 4070.0 | 99 |
| 4071.0 | 100 |
| 4072.0 | 99 |
| 4073.0 | 100 |
| 4074.0 | 99 |
| 4075.0 | 100 |
| 4076.0 | 99 |
| 4077.0 | 100 |
| 4078.0 | 99 |
| 4079.0 | 100 |
| 4080.0 | 99 |
| 4081.0 | 100 |
| 4082.0 | 99 |
| 4083.0 | 98 |
| 4084.0 | 99 |
| 4085.0 | 98 |
| 4086.0 | 99 |
| 4087.0 | 98 |
| 4088.0 | 99 |
| 4089.0 | 100 |
| 4090.0 | 99 |
| 4091.0 | 98 |
| 4092.0 | 97 |
| 4093.0 | 96 |
| 4094.0 | 97 |
| 4095.0 | 96 |
| 4096.0 | 97 |
| 4097.0 | 98 |
| 4098.0 | 97 |
| 4099.0 | 96 |
| 4100.0 | 95 |
| 4101.0 | 94 |
| 4102.0 | 93 |
| 4103.0 | 94 |
| 4104.0 | 95 |
| 4105.0 | 94 |
| 4106.0 | 93 |
| 4107.0 | 94 |
| 4108.0 | 95 |
| 4109.0 | 96 |
| 4110.0 | 95 |
| 4111.0 | 96 |
| 4112.0 | 97 |
| 4113.0 | 98 |
| 4114.0 | 99 |
| 4115.0 | 98 |
| 4116.0 | 99 |
| 4117.0 | 100 |
| 4118.0 | 99 |
| 4119.0 | 100 |
| 4120.0 | 99 |
| 4121.0 | 98 |
| 4122.0 | 99 |
| 4123.0 | 98 |
| 4124.0 | 97 |
| 4125.0 | 98 |
| 4126.0 | 97 |
| 4127.0 | 96 |
| 4128.0 | 97 |
| 4129.0 | 98 |
| 4130.0 | 99 |
| 4131.0 | 100 |
| 4132.0 | 99 |
| 4133.0 | 100 |
| 4134.0 | 99 |
| 4135.0 | 100 |
| 4136.0 | 101 |
| 4137.0 | 102 |
| 4138.0 | 103 |
| 4139.0 | 104 |
| 4140.0 | 103 |
| 4141.0 | 104 |
| 4142.0 | 103 |
| 4143.0 | 102 |
| 4144.0 | 101 |
| 4145.0 | 102 |
| 4146.0 | 101 |
| 4147.0 | 100 |
| 4148.0 | 101 |
| 4149.0 | 102 |
| 4150.0 | 103 |
| 4151.0 | 102 |
| 4152.0 | 101 |
| 4153.0 | 100 |
| 4154.0 | 99 |
| 4155.0 | 100 |
| 4156.0 | 99 |
| 4157.0 | 100 |
| 4158.0 | 101 |
| 4159.0 | 100 |
| 4160.0 | 99 |
| 4161.0 | 100 |
| 4162.0 | 99 |
| 4163.0 | 98 |
| 4164.0 | 99 |
| 4165.0 | 100 |
| 4166.0 | 101 |
| 4167.0 | 102 |
| 4168.0 | 101 |
| 4169.0 | 102 |
| 4170.0 | 101 |
| 4171.0 | 100 |
| 4172.0 | 99 |
| 4173.0 | 98 |
| 4174.0 | 97 |
| 4175.0 | 98 |
| 4176.0 | 99 |
| 4177.0 | 98 |
| 4178.0 | 97 |
| 4179.0 | 96 |
| 4180.0 | 95 |
| 4181.0 | 94 |
| 4182.0 | 93 |
| 4183.0 | 92 |
| 4184.0 | 91 |
| 4185.0 | 90 |
| 4186.0 | 89 |
| 4187.0 | 90 |
| 4188.0 | 91 |
| 4189.0 | 90 |
| 4190.0 | 89 |
| 4191.0 | 88 |
| 4192.0 | 87 |
| 4193.0 | 86 |
| 4194.0 | 85 |
| 4195.0 | 84 |
| 4196.0 | 83 |
| 4197.0 | 84 |
| 4198.0 | 85 |
| 4199.0 | 86 |
| 4200.0 | 87 |
| 4201.0 | 88 |
| 4202.0 | 87 |
| 4203.0 | 86 |
| 4204.0 | 87 |
| 4205.0 | 88 |
| 4206.0 | 89 |
| 4207.0 | 90 |
| 4208.0 | 89 |
| 4209.0 | 88 |
| 4210.0 | 87 |
| 4211.0 | 88 |
| 4212.0 | 89 |
| 4213.0 | 90 |
| 4214.0 | 91 |
| 4215.0 | 90 |
| 4216.0 | 91 |
| 4217.0 | 90 |
| 4218.0 | 91 |
| 4219.0 | 90 |
| 4220.0 | 89 |
| 4221.0 | 90 |
| 4222.0 | 89 |
| 4223.0 | 88 |
| 4224.0 | 87 |
| 4225.0 | 86 |
| 4226.0 | 87 |
| 4227.0 | 88 |
| 4228.0 | 87 |
| 4229.0 | 86 |
| 4230.0 | 87 |
| 4231.0 | 88 |
| 4232.0 | 87 |
| 4233.0 | 86 |
| 4234.0 | 85 |
| 4235.0 | 86 |
| 4236.0 | 85 |
| 4237.0 | 84 |
| 4238.0 | 85 |
| 4239.0 | 86 |
| 4240.0 | 87 |
| 4241.0 | 86 |
| 4242.0 | 87 |
| 4243.0 | 86 |
| 4244.0 | 87 |
| 4245.0 | 88 |
| 4246.0 | 87 |
| 4247.0 | 88 |
| 4248.0 | 89 |
| 4249.0 | 90 |
| 4250.0 | 89 |
| 4251.0 | 88 |
| 4252.0 | 89 |
| 4253.0 | 88 |
| 4254.0 | 87 |
| 4255.0 | 86 |
| 4256.0 | 87 |
| 4257.0 | 86 |
| 4258.0 | 85 |
| 4259.0 | 86 |
| 4260.0 | 85 |
| 4261.0 | 84 |
| 4262.0 | 83 |
| 4263.0 | 84 |
| 4264.0 | 85 |
| 4265.0 | 86 |
| 4266.0 | 85 |
| 4267.0 | 86 |
| 4268.0 | 85 |
| 4269.0 | 86 |
| 4270.0 | 85 |
| 4271.0 | 86 |
| 4272.0 | 87 |
| 4273.0 | 86 |
| 4274.0 | 85 |
| 4275.0 | 86 |
| 4276.0 | 87 |
| 4277.0 | 86 |
| 4278.0 | 85 |
| 4279.0 | 86 |
| 4280.0 | 85 |
| 4281.0 | 84 |
| 4282.0 | 85 |
| 4283.0 | 84 |
| 4284.0 | 85 |
| 4285.0 | 84 |
| 4286.0 | 83 |
| 4287.0 | 84 |
| 4288.0 | 85 |
| 4289.0 | 86 |
| 4290.0 | 87 |
| 4291.0 | 86 |
| 4292.0 | 85 |
| 4293.0 | 86 |
| 4294.0 | 85 |
| 4295.0 | 84 |
| 4296.0 | 83 |
| 4297.0 | 82 |
| 4298.0 | 81 |
| 4299.0 | 80 |
| 4300.0 | 81 |
| 4301.0 | 80 |
| 4302.0 | 81 |
| 4303.0 | 82 |
| 4304.0 | 81 |
| 4305.0 | 82 |
| 4306.0 | 81 |
| 4307.0 | 80 |
| 4308.0 | 79 |
| 4309.0 | 78 |
| 4310.0 | 79 |
| 4311.0 | 78 |
| 4312.0 | 77 |
| 4313.0 | 78 |
| 4314.0 | 77 |
| 4315.0 | 76 |
| 4316.0 | 77 |
| 4317.0 | 78 |
| 4318.0 | 79 |
| 4319.0 | 80 |
| 4320.0 | 81 |
| 4321.0 | 80 |
| 4322.0 | 79 |
| 4323.0 | 78 |
| 4324.0 | 77 |
| 4325.0 | 78 |
| 4326.0 | 79 |
| 4327.0 | 78 |
| 4328.0 | 77 |
| 4329.0 | 78 |
| 4330.0 | 77 |
| 4331.0 | 76 |
| 4332.0 | 77 |
| 4333.0 | 78 |
| 4334.0 | 79 |
| 4335.0 | 80 |
| 4336.0 | 81 |
| 4337.0 | 80 |
| 4338.0 | 79 |
| 4339.0 | 78 |
| 4340.0 | 77 |
| 4341.0 | 78 |
| 4342.0 | 77 |
| 4343.0 | 78 |
| 4344.0 | 79 |
| 4345.0 | 80 |
| 4346.0 | 81 |
| 4347.0 | 82 |
| 4348.0 | 81 |
| 4349.0 | 80 |
| 4350.0 | 81 |
| 4351.0 | 80 |
| 4352.0 | 79 |
| 4353.0 | 80 |
| 4354.0 | 81 |
| 4355.0 | 80 |
| 4356.0 | 81 |
| 4357.0 | 82 |
| 4358.0 | 83 |
| 4359.0 | 84 |
| 4360.0 | 85 |
| 4361.0 | 86 |
| 4362.0 | 85 |
| 4363.0 | 86 |
| 4364.0 | 85 |
| 4365.0 | 86 |
| 4366.0 | 87 |
| 4367.0 | 86 |
| 4368.0 | 85 |
| 4369.0 | 86 |
| 4370.0 | 87 |
| 4371.0 | 86 |
| 4372.0 | 85 |
| 4373.0 | 84 |
| 4374.0 | 85 |
| 4375.0 | 86 |
| 4376.0 | 87 |
| 4377.0 | 88 |
| 4378.0 | 89 |
| 4379.0 | 88 |
| 4380.0 | 89 |
| 4381.0 | 90 |
| 4382.0 | 91 |
| 4383.0 | 92 |
| 4384.0 | 91 |
| 4385.0 | 92 |
| 4386.0 | 91 |
| 4387.0 | 92 |
| 4388.0 | 91 |
| 4389.0 | 92 |
| 4390.0 | 93 |
| 4391.0 | 94 |
| 4392.0 | 95 |
| 4393.0 | 94 |
| 4394.0 | 95 |
| 4395.0 | 94 |
| 4396.0 | 95 |
| 4397.0 | 96 |
| 4398.0 | 95 |
| 4399.0 | 94 |
| 4400.0 | 93 |
| 4401.0 | 94 |
| 4402.0 | 93 |
| 4403.0 | 94 |
| 4404.0 | 95 |
| 4405.0 | 96 |
| 4406.0 | 95 |
| 4407.0 | 94 |
| 4408.0 | 93 |
| 4409.0 | 94 |
| 4410.0 | 95 |
| 4411.0 | 94 |
| 4412.0 | 93 |
| 4413.0 | 92 |
| 4414.0 | 91 |
| 4415.0 | 92 |
| 4416.0 | 91 |
| 4417.0 | 92 |
| 4418.0 | 93 |
| 4419.0 | 92 |
| 4420.0 | 91 |
| 4421.0 | 92 |
| 4422.0 | 91 |
| 4423.0 | 92 |
| 4424.0 | 91 |
| 4425.0 | 92 |
| 4426.0 | 91 |
| 4427.0 | 90 |
| 4428.0 | 89 |
| 4429.0 | 90 |
| 4430.0 | 91 |
| 4431.0 | 92 |
| 4432.0 | 93 |
| 4433.0 | 94 |
| 4434.0 | 95 |
| 4435.0 | 96 |
| 4436.0 | 97 |
| 4437.0 | 96 |
| 4438.0 | 95 |
| 4439.0 | 94 |
| 4440.0 | 93 |
| 4441.0 | 94 |
| 4442.0 | 95 |
| 4443.0 | 94 |
| 4444.0 | 95 |
| 4445.0 | 96 |
| 4446.0 | 95 |
| 4447.0 | 96 |
| 4448.0 | 97 |
| 4449.0 | 96 |
| 4450.0 | 95 |
| 4451.0 | 94 |
| 4452.0 | 93 |
| 4453.0 | 92 |
| 4454.0 | 93 |
| 4455.0 | 92 |
| 4456.0 | 93 |
| 4457.0 | 94 |
| 4458.0 | 93 |
| 4459.0 | 92 |
| 4460.0 | 91 |
| 4461.0 | 92 |
| 4462.0 | 93 |
| 4463.0 | 92 |
| 4464.0 | 91 |
| 4465.0 | 90 |
| 4466.0 | 89 |
| 4467.0 | 90 |
| 4468.0 | 91 |
| 4469.0 | 90 |
| 4470.0 | 89 |
| 4471.0 | 90 |
| 4472.0 | 91 |
| 4473.0 | 92 |
| 4474.0 | 91 |
| 4475.0 | 90 |
| 4476.0 | 91 |
| 4477.0 | 92 |
| 4478.0 | 93 |
| 4479.0 | 92 |
| 4480.0 | 93 |
| 4481.0 | 94 |
| 4482.0 | 93 |
| 4483.0 | 92 |
| 4484.0 | 91 |
| 4485.0 | 92 |
| 4486.0 | 93 |
| 4487.0 | 94 |
| 4488.0 | 93 |
| 4489.0 | 92 |
| 4490.0 | 93 |
| 4491.0 | 92 |
| 4492.0 | 93 |
| 4493.0 | 94 |
| 4494.0 | 95 |
| 4495.0 | 94 |
| 4496.0 | 93 |
| 4497.0 | 94 |
| 4498.0 | 95 |
| 4499.0 | 96 |
| 4500.0 | 95 |
| 4501.0 | 96 |
| 4502.0 | 95 |
| 4503.0 | 94 |
| 4504.0 | 93 |
| 4505.0 | 94 |
| 4506.0 | 95 |
| 4507.0 | 94 |
| 4508.0 | 93 |
| 4509.0 | 94 |
| 4510.0 | 93 |
| 4511.0 | 92 |
| 4512.0 | 91 |
| 4513.0 | 92 |
| 4514.0 | 91 |
| 4515.0 | 92 |
| 4516.0 | 93 |
| 4517.0 | 92 |
| 4518.0 | 91 |
| 4519.0 | 90 |
| 4520.0 | 91 |
| 4521.0 | 92 |
| 4522.0 | 93 |
| 4523.0 | 92 |
| 4524.0 | 93 |
| 4525.0 | 92 |
| 4526.0 | 91 |
| 4527.0 | 92 |
| 4528.0 | 93 |
| 4529.0 | 92 |
| 4530.0 | 93 |
| 4531.0 | 92 |
| 4532.0 | 93 |
| 4533.0 | 92 |
| 4534.0 | 91 |
| 4535.0 | 92 |
| 4536.0 | 93 |
| 4537.0 | 92 |
| 4538.0 | 91 |
| 4539.0 | 92 |
| 4540.0 | 91 |
| 4541.0 | 90 |
| 4542.0 | 89 |
| 4543.0 | 90 |
| 4544.0 | 91 |
| 4545.0 | 90 |
| 4546.0 | 91 |
| 4547.0 | 90 |
| 4548.0 | 91 |
| 4549.0 | 90 |
| 4550.0 | 91 |
| 4551.0 | 90 |
| 4552.0 | 91 |
| 4553.0 | 92 |
| 4554.0 | 93 |
| 4555.0 | 92 |
| 4556.0 | 93 |
| 4557.0 | 92 |
| 4558.0 | 93 |
| 4559.0 | 94 |
| 4560.0 | 95 |
| 4561.0 | 94 |
| 4562.0 | 95 |
| 4563.0 | 96 |
| 4564.0 | 97 |
| 4565.0 | 98 |
| 4566.0 | 99 |
| 4567.0 | 100 |
| 4568.0 | 101 |
| 4569.0 | 102 |
| 4570.0 | 103 |
| 4571.0 | 104 |
| 4572.0 | 105 |
| 4573.0 | 104 |
| 4574.0 | 103 |
| 4575.0 | 102 |
| 4576.0 | 101 |
| 4577.0 | 102 |
| 4578.0 | 103 |
| 4579.0 | 104 |
| 4580.0 | 105 |
| 4581.0 | 106 |
| 4582.0 | 107 |
| 4583.0 | 108 |
| 4584.0 | 107 |
| 4585.0 | 106 |
| 4586.0 | 105 |
| 4587.0 | 106 |
| 4588.0 | 105 |
| 4589.0 | 106 |
| 4590.0 | 105 |
| 4591.0 | 104 |
| 4592.0 | 105 |
| 4593.0 | 104 |
| 4594.0 | 105 |
| 4595.0 | 104 |
| 4596.0 | 105 |
| 4597.0 | 104 |
| 4598.0 | 105 |
| 4599.0 | 106 |
| 4600.0 | 107 |
| 4601.0 | 106 |
| 4602.0 | 105 |
| 4603.0 | 106 |
| 4604.0 | 107 |
| 4605.0 | 106 |
| 4606.0 | 107 |
| 4607.0 | 106 |
| 4608.0 | 105 |
| 4609.0 | 104 |
| 4610.0 | 103 |
| 4611.0 | 104 |
| 4612.0 | 105 |
| 4613.0 | 106 |
| 4614.0 | 107 |
| 4615.0 | 106 |
| 4616.0 | 107 |
| 4617.0 | 106 |
| 4618.0 | 107 |
| 4619.0 | 106 |
| 4620.0 | 105 |
| 4621.0 | 104 |
| 4622.0 | 103 |
| 4623.0 | 104 |
| 4624.0 | 103 |
| 4625.0 | 102 |
| 4626.0 | 103 |
| 4627.0 | 104 |
| 4628.0 | 103 |
| 4629.0 | 104 |
| 4630.0 | 103 |
| 4631.0 | 102 |
| 4632.0 | 103 |
| 4633.0 | 102 |
| 4634.0 | 103 |
| 4635.0 | 104 |
| 4636.0 | 103 |
| 4637.0 | 102 |
| 4638.0 | 103 |
| 4639.0 | 104 |
| 4640.0 | 105 |
| 4641.0 | 104 |
| 4642.0 | 103 |
| 4643.0 | 104 |
| 4644.0 | 105 |
| 4645.0 | 106 |
| 4646.0 | 105 |
| 4647.0 | 104 |
| 4648.0 | 105 |
| 4649.0 | 106 |
| 4650.0 | 105 |
| 4651.0 | 104 |
| 4652.0 | 103 |
| 4653.0 | 104 |
| 4654.0 | 105 |
| 4655.0 | 104 |
| 4656.0 | 105 |
| 4657.0 | 106 |
| 4658.0 | 107 |
| 4659.0 | 108 |
| 4660.0 | 107 |
| 4661.0 | 106 |
| 4662.0 | 107 |
| 4663.0 | 108 |
| 4664.0 | 109 |
| 4665.0 | 110 |
| 4666.0 | 111 |
| 4667.0 | 112 |
| 4668.0 | 111 |
| 4669.0 | 112 |
| 4670.0 | 111 |
| 4671.0 | 110 |
| 4672.0 | 111 |
| 4673.0 | 110 |
| 4674.0 | 109 |
| 4675.0 | 108 |
| 4676.0 | 107 |
| 4677.0 | 106 |
| 4678.0 | 107 |
| 4679.0 | 106 |
| 4680.0 | 107 |
| 4681.0 | 106 |
| 4682.0 | 105 |
| 4683.0 | 106 |
| 4684.0 | 105 |
| 4685.0 | 106 |
| 4686.0 | 107 |
| 4687.0 | 108 |
| 4688.0 | 107 |
| 4689.0 | 106 |
| 4690.0 | 105 |
| 4691.0 | 104 |
| 4692.0 | 105 |
| 4693.0 | 106 |
| 4694.0 | 107 |
| 4695.0 | 108 |
| 4696.0 | 107 |
| 4697.0 | 106 |
| 4698.0 | 105 |
| 4699.0 | 104 |
| 4700.0 | 103 |
| 4701.0 | 104 |
| 4702.0 | 103 |
| 4703.0 | 102 |
| 4704.0 | 101 |
| 4705.0 | 102 |
| 4706.0 | 101 |
| 4707.0 | 100 |
| 4708.0 | 99 |
| 4709.0 | 100 |
| 4710.0 | 101 |
| 4711.0 | 100 |
| 4712.0 | 99 |
| 4713.0 | 98 |
| 4714.0 | 97 |
| 4715.0 | 98 |
| 4716.0 | 99 |
| 4717.0 | 100 |
| 4718.0 | 99 |
| 4719.0 | 98 |
| 4720.0 | 99 |
| 4721.0 | 100 |
| 4722.0 | 101 |
| 4723.0 | 100 |
| 4724.0 | 101 |
| 4725.0 | 100 |
| 4726.0 | 101 |
| 4727.0 | 100 |
| 4728.0 | 99 |
| 4729.0 | 98 |
| 4730.0 | 99 |
| 4731.0 | 98 |
| 4732.0 | 99 |
| 4733.0 | 100 |
| 4734.0 | 99 |
| 4735.0 | 98 |
| 4736.0 | 99 |
| 4737.0 | 100 |
| 4738.0 | 101 |
| 4739.0 | 100 |
| 4740.0 | 101 |
| 4741.0 | 102 |
| 4742.0 | 101 |
| 4743.0 | 102 |
| 4744.0 | 101 |
| 4745.0 | 102 |
| 4746.0 | 101 |
| 4747.0 | 100 |
| 4748.0 | 99 |
| 4749.0 | 98 |
| 4750.0 | 97 |
| 4751.0 | 98 |
| 4752.0 | 97 |
| 4753.0 | 96 |
| 4754.0 | 97 |
| 4755.0 | 98 |
| 4756.0 | 97 |
| 4757.0 | 98 |
| 4758.0 | 97 |
| 4759.0 | 96 |
| 4760.0 | 97 |
| 4761.0 | 98 |
| 4762.0 | 99 |
| 4763.0 | 100 |
| 4764.0 | 101 |
| 4765.0 | 102 |
| 4766.0 | 101 |
| 4767.0 | 100 |
| 4768.0 | 101 |
| 4769.0 | 102 |
| 4770.0 | 101 |
| 4771.0 | 102 |
| 4772.0 | 101 |
| 4773.0 | 102 |
| 4774.0 | 103 |
| 4775.0 | 104 |
| 4776.0 | 105 |
| 4777.0 | 106 |
| 4778.0 | 105 |
| 4779.0 | 106 |
| 4780.0 | 105 |
| 4781.0 | 104 |
| 4782.0 | 103 |
| 4783.0 | 104 |
| 4784.0 | 105 |
| 4785.0 | 106 |
| 4786.0 | 105 |
| 4787.0 | 106 |
| 4788.0 | 107 |
| 4789.0 | 108 |
| 4790.0 | 109 |
| 4791.0 | 110 |
| 4792.0 | 109 |
| 4793.0 | 110 |
| 4794.0 | 109 |
| 4795.0 | 108 |
| 4796.0 | 107 |
| 4797.0 | 106 |
| 4798.0 | 105 |
| 4799.0 | 106 |
| 4800.0 | 107 |
| 4801.0 | 108 |
| 4802.0 | 109 |
| 4803.0 | 110 |
| 4804.0 | 111 |
| 4805.0 | 110 |
| 4806.0 | 111 |
| 4807.0 | 110 |
| 4808.0 | 111 |
| 4809.0 | 110 |
| 4810.0 | 111 |
| 4811.0 | 112 |
| 4812.0 | 113 |
| 4813.0 | 114 |
| 4814.0 | 113 |
| 4815.0 | 114 |
| 4816.0 | 113 |
| 4817.0 | 114 |
| 4818.0 | 115 |
| 4819.0 | 114 |
| 4820.0 | 115 |
| 4821.0 | 114 |
| 4822.0 | 115 |
| 4823.0 | 116 |
| 4824.0 | 115 |
| 4825.0 | 114 |
| 4826.0 | 113 |
| 4827.0 | 114 |
| 4828.0 | 115 |
| 4829.0 | 114 |
| 4830.0 | 115 |
| 4831.0 | 116 |
| 4832.0 | 117 |
| 4833.0 | 118 |
| 4834.0 | 117 |
| 4835.0 | 118 |
| 4836.0 | 117 |
| 4837.0 | 118 |
| 4838.0 | 117 |
| 4839.0 | 118 |
| 4840.0 | 117 |
| 4841.0 | 118 |
| 4842.0 | 119 |
| 4843.0 | 118 |
| 4844.0 | 117 |
| 4845.0 | 118 |
| 4846.0 | 119 |
| 4847.0 | 120 |
| 4848.0 | 121 |
| 4849.0 | 120 |
| 4850.0 | 119 |
| 4851.0 | 120 |
| 4852.0 | 119 |
| 4853.0 | 120 |
| 4854.0 | 121 |
| 4855.0 | 120 |
| 4856.0 | 119 |
| 4857.0 | 118 |
| 4858.0 | 117 |
| 4859.0 | 118 |
| 4860.0 | 117 |
| 4861.0 | 116 |
| 4862.0 | 115 |
| 4863.0 | 114 |
| 4864.0 | 115 |
| 4865.0 | 116 |
| 4866.0 | 115 |
| 4867.0 | 114 |
| 4868.0 | 113 |
| 4869.0 | 114 |
| 4870.0 | 113 |
| 4871.0 | 112 |
| 4872.0 | 113 |
| 4873.0 | 112 |
| 4874.0 | 113 |
| 4875.0 | 114 |
| 4876.0 | 115 |
| 4877.0 | 116 |
| 4878.0 | 115 |
| 4879.0 | 114 |
| 4880.0 | 115 |
| 4881.0 | 116 |
| 4882.0 | 117 |
| 4883.0 | 116 |
| 4884.0 | 115 |
| 4885.0 | 114 |
| 4886.0 | 113 |
| 4887.0 | 114 |
| 4888.0 | 115 |
| 4889.0 | 116 |
| 4890.0 | 115 |
| 4891.0 | 116 |
| 4892.0 | 117 |
| 4893.0 | 118 |
| 4894.0 | 119 |
| 4895.0 | 120 |
| 4896.0 | 121 |
| 4897.0 | 122 |
| 4898.0 | 121 |
| 4899.0 | 120 |
| 4900.0 | 121 |
| 4901.0 | 122 |
| 4902.0 | 121 |
| 4903.0 | 120 |
| 4904.0 | 121 |
| 4905.0 | 120 |
| 4906.0 | 121 |
| 4907.0 | 122 |
| 4908.0 | 121 |
| 4909.0 | 122 |
| 4910.0 | 121 |
| 4911.0 | 120 |
| 4912.0 | 121 |
| 4913.0 | 122 |
| 4914.0 | 123 |
| 4915.0 | 124 |
| 4916.0 | 123 |
| 4917.0 | 122 |
| 4918.0 | 123 |
| 4919.0 | 122 |
| 4920.0 | 123 |
| 4921.0 | 122 |
| 4922.0 | 121 |
| 4923.0 | 122 |
| 4924.0 | 123 |
| 4925.0 | 122 |
| 4926.0 | 123 |
| 4927.0 | 122 |
| 4928.0 | 123 |
| 4929.0 | 122 |
| 4930.0 | 121 |
| 4931.0 | 120 |
| 4932.0 | 119 |
| 4933.0 | 118 |
| 4934.0 | 119 |
| 4935.0 | 120 |
| 4936.0 | 119 |
| 4937.0 | 118 |
| 4938.0 | 119 |
| 4939.0 | 118 |
| 4940.0 | 119 |
| 4941.0 | 120 |
| 4942.0 | 119 |
| 4943.0 | 118 |
| 4944.0 | 117 |
| 4945.0 | 116 |
| 4946.0 | 115 |
| 4947.0 | 114 |
| 4948.0 | 113 |
| 4949.0 | 112 |
| 4950.0 | 111 |
| 4951.0 | 110 |
| 4952.0 | 111 |
| 4953.0 | 112 |
| 4954.0 | 111 |
| 4955.0 | 112 |
| 4956.0 | 113 |
| 4957.0 | 114 |
| 4958.0 | 115 |
| 4959.0 | 116 |
| 4960.0 | 117 |
| 4961.0 | 118 |
| 4962.0 | 119 |
| 4963.0 | 118 |
| 4964.0 | 117 |
| 4965.0 | 116 |
| 4966.0 | 117 |
| 4967.0 | 116 |
| 4968.0 | 117 |
| 4969.0 | 116 |
| 4970.0 | 117 |
| 4971.0 | 118 |
| 4972.0 | 119 |
| 4973.0 | 118 |
| 4974.0 | 119 |
| 4975.0 | 120 |
| 4976.0 | 121 |
| 4977.0 | 120 |
| 4978.0 | 121 |
| 4979.0 | 120 |
| 4980.0 | 121 |
| 4981.0 | 122 |
| 4982.0 | 121 |
| 4983.0 | 120 |
| 4984.0 | 119 |
| 4985.0 | 120 |
| 4986.0 | 119 |
| 4987.0 | 120 |
| 4988.0 | 119 |
| 4989.0 | 120 |
| 4990.0 | 121 |
| 4991.0 | 122 |
| 4992.0 | 123 |
| 4993.0 | 122 |
| 4994.0 | 121 |
| 4995.0 | 120 |
| 4996.0 | 119 |
| 4997.0 | 118 |
| 4998.0 | 119 |
| 4999.0 | 120 |
| 5000.0 | 121 |
| 5001.0 | 122 |
| 5002.0 | 121 |
| 5003.0 | 122 |
| 5004.0 | 123 |
| 5005.0 | 122 |
| 5006.0 | 121 |
| 5007.0 | 122 |
| 5008.0 | 121 |
| 5009.0 | 120 |
| 5010.0 | 119 |
| 5011.0 | 120 |
| 5012.0 | 119 |
| 5013.0 | 118 |
| 5014.0 | 117 |
| 5015.0 | 116 |
| 5016.0 | 117 |
| 5017.0 | 116 |
| 5018.0 | 117 |
| 5019.0 | 118 |
| 5020.0 | 117 |
| 5021.0 | 118 |
| 5022.0 | 117 |
| 5023.0 | 116 |
| 5024.0 | 117 |
| 5025.0 | 118 |
| 5026.0 | 119 |
| 5027.0 | 120 |
| 5028.0 | 121 |
| 5029.0 | 120 |
| 5030.0 | 121 |
| 5031.0 | 122 |
| 5032.0 | 123 |
| 5033.0 | 124 |
| 5034.0 | 125 |
| 5035.0 | 126 |
| 5036.0 | 127 |
| 5037.0 | 126 |
| 5038.0 | 127 |
| 5039.0 | 126 |
| 5040.0 | 125 |
| 5041.0 | 124 |
| 5042.0 | 123 |
| 5043.0 | 124 |
| 5044.0 | 125 |
| 5045.0 | 124 |
| 5046.0 | 125 |
| 5047.0 | 124 |
| 5048.0 | 125 |
| 5049.0 | 126 |
| 5050.0 | 125 |
| 5051.0 | 126 |
| 5052.0 | 127 |
| 5053.0 | 126 |
| 5054.0 | 127 |
| 5055.0 | 128 |
| 5056.0 | 127 |
| 5057.0 | 126 |
| 5058.0 | 127 |
| 5059.0 | 128 |
| 5060.0 | 129 |
| 5061.0 | 130 |
| 5062.0 | 131 |
| 5063.0 | 130 |
| 5064.0 | 131 |
| 5065.0 | 130 |
| 5066.0 | 131 |
| 5067.0 | 130 |
| 5068.0 | 131 |
| 5069.0 | 130 |
| 5070.0 | 131 |
| 5071.0 | 132 |
| 5072.0 | 131 |
| 5073.0 | 132 |
| 5074.0 | 131 |
| 5075.0 | 130 |
| 5076.0 | 129 |
| 5077.0 | 130 |
| 5078.0 | 129 |
| 5079.0 | 130 |
| 5080.0 | 129 |
| 5081.0 | 128 |
| 5082.0 | 127 |
| 5083.0 | 128 |
| 5084.0 | 127 |
| 5085.0 | 128 |
| 5086.0 | 129 |
| 5087.0 | 128 |
| 5088.0 | 129 |
| 5089.0 | 128 |
| 5090.0 | 129 |
| 5091.0 | 130 |
| 5092.0 | 131 |
| 5093.0 | 132 |
| 5094.0 | 131 |
| 5095.0 | 132 |
| 5096.0 | 133 |
| 5097.0 | 132 |
| 5098.0 | 131 |
| 5099.0 | 130 |
| 5100.0 | 129 |
| 5101.0 | 130 |
| 5102.0 | 131 |
| 5103.0 | 132 |
| 5104.0 | 133 |
| 5105.0 | 134 |
| 5106.0 | 135 |
| 5107.0 | 134 |
| 5108.0 | 133 |
| 5109.0 | 134 |
| 5110.0 | 135 |
| 5111.0 | 134 |
| 5112.0 | 135 |
| 5113.0 | 136 |
| 5114.0 | 135 |
| 5115.0 | 134 |
| 5116.0 | 133 |
| 5117.0 | 134 |
| 5118.0 | 135 |
| 5119.0 | 134 |
| 5120.0 | 133 |
| 5121.0 | 134 |
| 5122.0 | 135 |
| 5123.0 | 134 |
| 5124.0 | 133 |
| 5125.0 | 134 |
| 5126.0 | 135 |
| 5127.0 | 136 |
| 5128.0 | 137 |
| 5129.0 | 136 |
| 5130.0 | 135 |
| 5131.0 | 136 |
| 5132.0 | 135 |
| 5133.0 | 136 |
| 5134.0 | 135 |
| 5135.0 | 134 |
| 5136.0 | 133 |
| 5137.0 | 132 |
| 5138.0 | 133 |
| 5139.0 | 132 |
| 5140.0 | 133 |
| 5141.0 | 134 |
| 5142.0 | 133 |
| 5143.0 | 132 |
| 5144.0 | 131 |
| 5145.0 | 130 |
| 5146.0 | 129 |
| 5147.0 | 128 |
| 5148.0 | 129 |
| 5149.0 | 130 |
| 5150.0 | 131 |
| 5151.0 | 130 |
| 5152.0 | 129 |
| 5153.0 | 130 |
| 5154.0 | 129 |
| 5155.0 | 128 |
| 5156.0 | 129 |
| 5157.0 | 128 |
| 5158.0 | 127 |
| 5159.0 | 126 |
| 5160.0 | 127 |
| 5161.0 | 126 |
| 5162.0 | 127 |
| 5163.0 | 126 |
| 5164.0 | 125 |
| 5165.0 | 124 |
| 5166.0 | 125 |
| 5167.0 | 124 |
| 5168.0 | 125 |
| 5169.0 | 124 |
| 5170.0 | 125 |
| 5171.0 | 126 |
| 5172.0 | 125 |
| 5173.0 | 126 |
| 5174.0 | 125 |
| 5175.0 | 124 |
| 5176.0 | 125 |
| 5177.0 | 124 |
| 5178.0 | 123 |
| 5179.0 | 124 |
| 5180.0 | 123 |
| 5181.0 | 122 |
| 5182.0 | 121 |
| 5183.0 | 120 |
| 5184.0 | 121 |
| 5185.0 | 120 |
| 5186.0 | 119 |
| 5187.0 | 120 |
| 5188.0 | 119 |
| 5189.0 | 120 |
| 5190.0 | 121 |
| 5191.0 | 120 |
| 5192.0 | 119 |
| 5193.0 | 120 |
| 5194.0 | 119 |
| 5195.0 | 118 |
| 5196.0 | 117 |
| 5197.0 | 118 |
| 5198.0 | 119 |
| 5199.0 | 118 |
| 5200.0 | 117 |
| 5201.0 | 116 |
| 5202.0 | 117 |
| 5203.0 | 116 |
| 5204.0 | 115 |
| 5205.0 | 116 |
| 5206.0 | 117 |
| 5207.0 | 116 |
| 5208.0 | 115 |
| 5209.0 | 116 |
| 5210.0 | 117 |
| 5211.0 | 118 |
| 5212.0 | 119 |
| 5213.0 | 120 |
| 5214.0 | 121 |
| 5215.0 | 122 |
| 5216.0 | 121 |
| 5217.0 | 120 |
| 5218.0 | 121 |
| 5219.0 | 120 |
| 5220.0 | 121 |
| 5221.0 | 120 |
| 5222.0 | 119 |
| 5223.0 | 118 |
| 5224.0 | 119 |
| 5225.0 | 120 |
| 5226.0 | 119 |
| 5227.0 | 120 |
| 5228.0 | 119 |
| 5229.0 | 120 |
| 5230.0 | 121 |
| 5231.0 | 122 |
| 5232.0 | 121 |
| 5233.0 | 122 |
| 5234.0 | 123 |
| 5235.0 | 124 |
| 5236.0 | 123 |
| 5237.0 | 122 |
| 5238.0 | 123 |
| 5239.0 | 122 |
| 5240.0 | 121 |
| 5241.0 | 120 |
| 5242.0 | 121 |
| 5243.0 | 122 |
| 5244.0 | 123 |
| 5245.0 | 124 |
| 5246.0 | 125 |
| 5247.0 | 126 |
| 5248.0 | 127 |
| 5249.0 | 128 |
| 5250.0 | 127 |
| 5251.0 | 126 |
| 5252.0 | 127 |
| 5253.0 | 126 |
| 5254.0 | 125 |
| 5255.0 | 124 |
| 5256.0 | 123 |
| 5257.0 | 124 |
| 5258.0 | 125 |
| 5259.0 | 126 |
| 5260.0 | 127 |
| 5261.0 | 128 |
| 5262.0 | 127 |
| 5263.0 | 126 |
| 5264.0 | 125 |
| 5265.0 | 124 |
| 5266.0 | 123 |
| 5267.0 | 124 |
| 5268.0 | 125 |
| 5269.0 | 124 |
| 5270.0 | 125 |
| 5271.0 | 126 |
| 5272.0 | 125 |
| 5273.0 | 124 |
| 5274.0 | 123 |
| 5275.0 | 122 |
| 5276.0 | 123 |
| 5277.0 | 124 |
| 5278.0 | 125 |
| 5279.0 | 124 |
| 5280.0 | 123 |
| 5281.0 | 122 |
| 5282.0 | 121 |
| 5283.0 | 122 |
| 5284.0 | 123 |
| 5285.0 | 124 |
| 5286.0 | 125 |
| 5287.0 | 126 |
| 5288.0 | 127 |
| 5289.0 | 126 |
| 5290.0 | 127 |
| 5291.0 | 128 |
| 5292.0 | 129 |
| 5293.0 | 128 |
| 5294.0 | 129 |
| 5295.0 | 128 |
| 5296.0 | 127 |
| 5297.0 | 128 |
| 5298.0 | 129 |
| 5299.0 | 130 |
| 5300.0 | 131 |
| 5301.0 | 130 |
| 5302.0 | 131 |
| 5303.0 | 132 |
| 5304.0 | 133 |
| 5305.0 | 132 |
| 5306.0 | 131 |
| 5307.0 | 130 |
| 5308.0 | 131 |
| 5309.0 | 132 |
| 5310.0 | 133 |
| 5311.0 | 134 |
| 5312.0 | 133 |
| 5313.0 | 134 |
| 5314.0 | 133 |
| 5315.0 | 132 |
| 5316.0 | 131 |
| 5317.0 | 132 |
| 5318.0 | 131 |
| 5319.0 | 132 |
| 5320.0 | 131 |
| 5321.0 | 130 |
| 5322.0 | 131 |
| 5323.0 | 132 |
| 5324.0 | 131 |
| 5325.0 | 132 |
| 5326.0 | 133 |
| 5327.0 | 132 |
| 5328.0 | 133 |
| 5329.0 | 134 |
| 5330.0 | 133 |
| 5331.0 | 132 |
| 5332.0 | 131 |
| 5333.0 | 132 |
| 5334.0 | 133 |
| 5335.0 | 134 |
| 5336.0 | 135 |
| 5337.0 | 136 |
| 5338.0 | 137 |
| 5339.0 | 138 |
| 5340.0 | 139 |
| 5341.0 | 140 |
| 5342.0 | 139 |
| 5343.0 | 140 |
| 5344.0 | 141 |
| 5345.0 | 142 |
| 5346.0 | 143 |
| 5347.0 | 142 |
| 5348.0 | 141 |
| 5349.0 | 142 |
| 5350.0 | 141 |
| 5351.0 | 140 |
| 5352.0 | 141 |
| 5353.0 | 140 |
| 5354.0 | 139 |
| 5355.0 | 138 |
| 5356.0 | 139 |
| 5357.0 | 140 |
| 5358.0 | 139 |
| 5359.0 | 138 |
| 5360.0 | 139 |
| 5361.0 | 138 |
| 5362.0 | 137 |
| 5363.0 | 136 |
| 5364.0 | 135 |
| 5365.0 | 134 |
| 5366.0 | 135 |
| 5367.0 | 134 |
| 5368.0 | 133 |
| 5369.0 | 132 |
| 5370.0 | 133 |
| 5371.0 | 132 |
| 5372.0 | 133 |
| 5373.0 | 134 |
| 5374.0 | 133 |
| 5375.0 | 132 |
| 5376.0 | 133 |
| 5377.0 | 134 |
| 5378.0 | 135 |
| 5379.0 | 134 |
| 5380.0 | 133 |
| 5381.0 | 132 |
| 5382.0 | 131 |
| 5383.0 | 130 |
| 5384.0 | 129 |
| 5385.0 | 130 |
| 5386.0 | 129 |
| 5387.0 | 128 |
| 5388.0 | 127 |
| 5389.0 | 128 |
| 5390.0 | 129 |
| 5391.0 | 130 |
| 5392.0 | 129 |
| 5393.0 | 128 |
| 5394.0 | 129 |
| 5395.0 | 128 |
| 5396.0 | 127 |
| 5397.0 | 126 |
| 5398.0 | 125 |
| 5399.0 | 124 |
| 5400.0 | 123 |
| 5401.0 | 122 |
| 5402.0 | 123 |
| 5403.0 | 122 |
| 5404.0 | 121 |
| 5405.0 | 120 |
| 5406.0 | 119 |
| 5407.0 | 120 |
| 5408.0 | 119 |
| 5409.0 | 118 |
| 5410.0 | 117 |
| 5411.0 | 116 |
| 5412.0 | 115 |
| 5413.0 | 116 |
| 5414.0 | 115 |
| 5415.0 | 116 |
| 5416.0 | 115 |
| 5417.0 | 116 |
| 5418.0 | 115 |
| 5419.0 | 116 |
| 5420.0 | 115 |
| 5421.0 | 116 |
| 5422.0 | 115 |
| 5423.0 | 116 |
| 5424.0 | 115 |
| 5425.0 | 116 |
| 5426.0 | 117 |
| 5427.0 | 116 |
| 5428.0 | 117 |
| 5429.0 | 118 |
| 5430.0 | 119 |
| 5431.0 | 118 |
| 5432.0 | 119 |
| 5433.0 | 120 |
| 5434.0 | 121 |
| 5435.0 | 122 |
| 5436.0 | 121 |
| 5437.0 | 120 |
| 5438.0 | 121 |
| 5439.0 | 120 |
| 5440.0 | 121 |
| 5441.0 | 122 |
| 5442.0 | 123 |
| 5443.0 | 122 |
| 5444.0 | 123 |
| 5445.0 | 122 |
| 5446.0 | 121 |
| 5447.0 | 120 |
| 5448.0 | 121 |
| 5449.0 | 120 |
| 5450.0 | 121 |
| 5451.0 | 120 |
| 5452.0 | 121 |
| 5453.0 | 122 |
| 5454.0 | 121 |
| 5455.0 | 120 |
| 5456.0 | 121 |
| 5457.0 | 122 |
| 5458.0 | 121 |
| 5459.0 | 122 |
| 5460.0 | 123 |
| 5461.0 | 122 |
| 5462.0 | 121 |
| 5463.0 | 122 |
| 5464.0 | 123 |
| 5465.0 | 124 |
| 5466.0 | 123 |
| 5467.0 | 122 |
| 5468.0 | 123 |
| 5469.0 | 122 |
| 5470.0 | 121 |
| 5471.0 | 120 |
| 5472.0 | 119 |
| 5473.0 | 118 |
| 5474.0 | 119 |
| 5475.0 | 118 |
| 5476.0 | 117 |
| 5477.0 | 116 |
| 5478.0 | 115 |
| 5479.0 | 114 |
| 5480.0 | 115 |
| 5481.0 | 114 |
| 5482.0 | 113 |
| 5483.0 | 112 |
| 5484.0 | 113 |
| 5485.0 | 112 |
| 5486.0 | 113 |
| 5487.0 | 112 |
| 5488.0 | 111 |
| 5489.0 | 110 |
| 5490.0 | 109 |
| 5491.0 | 108 |
| 5492.0 | 107 |
| 5493.0 | 108 |
| 5494.0 | 109 |
| 5495.0 | 110 |
| 5496.0 | 109 |
| 5497.0 | 108 |
| 5498.0 | 109 |
| 5499.0 | 108 |
| 5500.0 | 109 |
| 5501.0 | 110 |
| 5502.0 | 109 |
| 5503.0 | 108 |
| 5504.0 | 107 |
| 5505.0 | 108 |
| 5506.0 | 109 |
| 5507.0 | 108 |
| 5508.0 | 107 |
| 5509.0 | 108 |
| 5510.0 | 109 |
| 5511.0 | 110 |
| 5512.0 | 111 |
| 5513.0 | 112 |
| 5514.0 | 111 |
| 5515.0 | 112 |
| 5516.0 | 113 |
| 5517.0 | 112 |
| 5518.0 | 111 |
| 5519.0 | 110 |
| 5520.0 | 109 |
| 5521.0 | 108 |
| 5522.0 | 109 |
| 5523.0 | 110 |
| 5524.0 | 111 |
| 5525.0 | 110 |
| 5526.0 | 109 |
| 5527.0 | 110 |
| 5528.0 | 111 |
| 5529.0 | 112 |
| 5530.0 | 113 |
| 5531.0 | 114 |
| 5532.0 | 115 |
| 5533.0 | 114 |
| 5534.0 | 113 |
| 5535.0 | 112 |
| 5536.0 | 113 |
| 5537.0 | 114 |
| 5538.0 | 115 |
| 5539.0 | 114 |
| 5540.0 | 113 |
| 5541.0 | 112 |
| 5542.0 | 113 |
| 5543.0 | 112 |
| 5544.0 | 113 |
| 5545.0 | 112 |
| 5546.0 | 111 |
| 5547.0 | 112 |
| 5548.0 | 113 |
| 5549.0 | 114 |
| 5550.0 | 115 |
| 5551.0 | 114 |
| 5552.0 | 115 |
| 5553.0 | 116 |
| 5554.0 | 117 |
| 5555.0 | 118 |
| 5556.0 | 119 |
| 5557.0 | 120 |
| 5558.0 | 121 |
| 5559.0 | 120 |
| 5560.0 | 119 |
| 5561.0 | 118 |
| 5562.0 | 119 |
| 5563.0 | 118 |
| 5564.0 | 117 |
| 5565.0 | 118 |
| 5566.0 | 117 |
| 5567.0 | 118 |
| 5568.0 | 117 |
| 5569.0 | 118 |
| 5570.0 | 119 |
| 5571.0 | 118 |
| 5572.0 | 119 |
| 5573.0 | 118 |
| 5574.0 | 117 |
| 5575.0 | 118 |
| 5576.0 | 119 |
| 5577.0 | 118 |
| 5578.0 | 117 |
| 5579.0 | 116 |
| 5580.0 | 115 |
| 5581.0 | 116 |
| 5582.0 | 117 |
| 5583.0 | 118 |
| 5584.0 | 119 |
| 5585.0 | 120 |
| 5586.0 | 119 |
| 5587.0 | 120 |
| 5588.0 | 119 |
| 5589.0 | 120 |
| 5590.0 | 121 |
| 5591.0 | 120 |
| 5592.0 | 119 |
| 5593.0 | 118 |
| 5594.0 | 117 |
| 5595.0 | 116 |
| 5596.0 | 117 |
| 5597.0 | 116 |
| 5598.0 | 115 |
| 5599.0 | 116 |
| 5600.0 | 117 |
| 5601.0 | 116 |
| 5602.0 | 117 |
| 5603.0 | 116 |
| 5604.0 | 117 |
| 5605.0 | 118 |
| 5606.0 | 119 |
| 5607.0 | 118 |
| 5608.0 | 117 |
| 5609.0 | 118 |
| 5610.0 | 117 |
| 5611.0 | 118 |
| 5612.0 | 119 |
| 5613.0 | 118 |
| 5614.0 | 117 |
| 5615.0 | 118 |
| 5616.0 | 117 |
| 5617.0 | 116 |
| 5618.0 | 117 |
| 5619.0 | 118 |
| 5620.0 | 117 |
| 5621.0 | 118 |
| 5622.0 | 117 |
| 5623.0 | 118 |
| 5624.0 | 117 |
| 5625.0 | 116 |
| 5626.0 | 117 |
| 5627.0 | 118 |
| 5628.0 | 119 |
| 5629.0 | 120 |
| 5630.0 | 121 |
| 5631.0 | 120 |
| 5632.0 | 119 |
| 5633.0 | 118 |
| 5634.0 | 119 |
| 5635.0 | 118 |
| 5636.0 | 117 |
| 5637.0 | 118 |
| 5638.0 | 119 |
| 5639.0 | 118 |
| 5640.0 | 119 |
| 5641.0 | 120 |
| 5642.0 | 121 |
| 5643.0 | 122 |
| 5644.0 | 121 |
| 5645.0 | 122 |
| 5646.0 | 121 |
| 5647.0 | 120 |
| 5648.0 | 119 |
| 5649.0 | 118 |
| 5650.0 | 119 |
| 5651.0 | 120 |
| 5652.0 | 121 |
| 5653.0 | 120 |
| 5654.0 | 119 |
| 5655.0 | 118 |
| 5656.0 | 119 |
| 5657.0 | 118 |
| 5658.0 | 119 |
| 5659.0 | 120 |
| 5660.0 | 119 |
| 5661.0 | 118 |
| 5662.0 | 119 |
| 5663.0 | 118 |
| 5664.0 | 117 |
| 5665.0 | 116 |
| 5666.0 | 115 |
| 5667.0 | 114 |
| 5668.0 | 113 |
| 5669.0 | 112 |
| 5670.0 | 113 |
| 5671.0 | 114 |
| 5672.0 | 113 |
| 5673.0 | 114 |
| 5674.0 | 113 |
| 5675.0 | 112 |
| 5676.0 | 113 |
| 5677.0 | 114 |
| 5678.0 | 115 |
| 5679.0 | 116 |
| 5680.0 | 117 |
| 5681.0 | 116 |
| 5682.0 | 115 |
| 5683.0 | 116 |
| 5684.0 | 117 |
| 5685.0 | 116 |
| 5686.0 | 117 |
| 5687.0 | 116 |
| 5688.0 | 115 |
| 5689.0 | 114 |
| 5690.0 | 113 |
| 5691.0 | 114 |
| 5692.0 | 115 |
| 5693.0 | 116 |
| 5694.0 | 115 |
| 5695.0 | 116 |
| 5696.0 | 115 |
| 5697.0 | 116 |
| 5698.0 | 117 |
| 5699.0 | 118 |
| 5700.0 | 119 |
| 5701.0 | 118 |
| 5702.0 | 119 |
| 5703.0 | 120 |
| 5704.0 | 121 |
| 5705.0 | 120 |
| 5706.0 | 119 |
| 5707.0 | 120 |
| 5708.0 | 119 |
| 5709.0 | 118 |
| 5710.0 | 117 |
| 5711.0 | 116 |
| 5712.0 | 115 |
| 5713.0 | 114 |
| 5714.0 | 113 |
| 5715.0 | 112 |
| 5716.0 | 111 |
| 5717.0 | 112 |
| 5718.0 | 113 |
| 5719.0 | 112 |
| 5720.0 | 111 |
| 5721.0 | 112 |
| 5722.0 | 113 |
| 5723.0 | 112 |
| 5724.0 | 111 |
| 5725.0 | 110 |
| 5726.0 | 111 |
| 5727.0 | 112 |
| 5728.0 | 113 |
| 5729.0 | 112 |
| 5730.0 | 111 |
| 5731.0 | 110 |
| 5732.0 | 109 |
| 5733.0 | 110 |
| 5734.0 | 111 |
| 5735.0 | 112 |
| 5736.0 | 113 |
| 5737.0 | 114 |
| 5738.0 | 113 |
| 5739.0 | 114 |
| 5740.0 | 113 |
| 5741.0 | 114 |
| 5742.0 | 113 |
| 5743.0 | 112 |
| 5744.0 | 113 |
| 5745.0 | 112 |
| 5746.0 | 111 |
| 5747.0 | 110 |
| 5748.0 | 109 |
| 5749.0 | 110 |
| 5750.0 | 109 |
| 5751.0 | 108 |
| 5752.0 | 107 |
| 5753.0 | 106 |
| 5754.0 | 105 |
| 5755.0 | 106 |
| 5756.0 | 107 |
| 5757.0 | 106 |
| 5758.0 | 105 |
| 5759.0 | 106 |
| 5760.0 | 105 |
| 5761.0 | 104 |
| 5762.0 | 105 |
| 5763.0 | 104 |
| 5764.0 | 105 |
| 5765.0 | 106 |
| 5766.0 | 107 |
| 5767.0 | 108 |
| 5768.0 | 107 |
| 5769.0 | 108 |
| 5770.0 | 109 |
| 5771.0 | 110 |
| 5772.0 | 109 |
| 5773.0 | 110 |
| 5774.0 | 109 |
| 5775.0 | 108 |
| 5776.0 | 109 |
| 5777.0 | 108 |
| 5778.0 | 107 |
| 5779.0 | 106 |
| 5780.0 | 107 |
| 5781.0 | 108 |
| 5782.0 | 107 |
| 5783.0 | 108 |
| 5784.0 | 107 |
| 5785.0 | 106 |
| 5786.0 | 105 |
| 5787.0 | 104 |
| 5788.0 | 105 |
| 5789.0 | 106 |
| 5790.0 | 105 |
| 5791.0 | 106 |
| 5792.0 | 105 |
| 5793.0 | 106 |
| 5794.0 | 105 |
| 5795.0 | 104 |
| 5796.0 | 103 |
| 5797.0 | 102 |
| 5798.0 | 103 |
| 5799.0 | 104 |
| 5800.0 | 103 |
| 5801.0 | 102 |
| 5802.0 | 103 |
| 5803.0 | 102 |
| 5804.0 | 101 |
| 5805.0 | 102 |
| 5806.0 | 101 |
| 5807.0 | 100 |
| 5808.0 | 99 |
| 5809.0 | 100 |
| 5810.0 | 101 |
| 5811.0 | 102 |
| 5812.0 | 103 |
| 5813.0 | 102 |
| 5814.0 | 101 |
| 5815.0 | 100 |
| 5816.0 | 99 |
| 5817.0 | 100 |
| 5818.0 | 101 |
| 5819.0 | 100 |
| 5820.0 | 99 |
| 5821.0 | 98 |
| 5822.0 | 99 |
| 5823.0 | 98 |
| 5824.0 | 97 |
| 5825.0 | 96 |
| 5826.0 | 95 |
| 5827.0 | 94 |
| 5828.0 | 93 |
| 5829.0 | 92 |
| 5830.0 | 93 |
| 5831.0 | 94 |
| 5832.0 | 95 |
| 5833.0 | 96 |
| 5834.0 | 95 |
| 5835.0 | 96 |
| 5836.0 | 97 |
| 5837.0 | 98 |
| 5838.0 | 97 |
| 5839.0 | 98 |
| 5840.0 | 97 |
| 5841.0 | 96 |
| 5842.0 | 95 |
| 5843.0 | 96 |
| 5844.0 | 95 |
| 5845.0 | 94 |
| 5846.0 | 93 |
| 5847.0 | 92 |
| 5848.0 | 93 |
| 5849.0 | 92 |
| 5850.0 | 93 |
| 5851.0 | 94 |
| 5852.0 | 93 |
| 5853.0 | 94 |
| 5854.0 | 93 |
| 5855.0 | 92 |
| 5856.0 | 93 |
| 5857.0 | 92 |
| 5858.0 | 91 |
| 5859.0 | 92 |
| 5860.0 | 93 |
| 5861.0 | 92 |
| 5862.0 | 91 |
| 5863.0 | 92 |
| 5864.0 | 91 |
| 5865.0 | 90 |
| 5866.0 | 89 |
| 5867.0 | 90 |
| 5868.0 | 89 |
| 5869.0 | 88 |
| 5870.0 | 89 |
| 5871.0 | 88 |
| 5872.0 | 89 |
| 5873.0 | 90 |
| 5874.0 | 89 |
| 5875.0 | 88 |
| 5876.0 | 89 |
| 5877.0 | 90 |
| 5878.0 | 89 |
| 5879.0 | 90 |
| 5880.0 | 89 |
| 5881.0 | 90 |
| 5882.0 | 91 |
| 5883.0 | 90 |
| 5884.0 | 91 |
| 5885.0 | 92 |
| 5886.0 | 91 |
| 5887.0 | 92 |
| 5888.0 | 93 |
| 5889.0 | 94 |
| 5890.0 | 95 |
| 5891.0 | 94 |
| 5892.0 | 95 |
| 5893.0 | 96 |
| 5894.0 | 97 |
| 5895.0 | 96 |
| 5896.0 | 97 |
| 5897.0 | 98 |
| 5898.0 | 97 |
| 5899.0 | 98 |
| 5900.0 | 99 |
| 5901.0 | 98 |
| 5902.0 | 99 |
| 5903.0 | 100 |
| 5904.0 | 101 |
| 5905.0 | 100 |
| 5906.0 | 101 |
| 5907.0 | 102 |
| 5908.0 | 101 |
| 5909.0 | 102 |
| 5910.0 | 101 |
| 5911.0 | 100 |
| 5912.0 | 101 |
| 5913.0 | 100 |
| 5914.0 | 99 |
| 5915.0 | 100 |
| 5916.0 | 99 |
| 5917.0 | 98 |
| 5918.0 | 97 |
| 5919.0 | 98 |
| 5920.0 | 99 |
| 5921.0 | 100 |
| 5922.0 | 99 |
| 5923.0 | 98 |
| 5924.0 | 97 |
| 5925.0 | 96 |
| 5926.0 | 97 |
| 5927.0 | 98 |
| 5928.0 | 99 |
| 5929.0 | 100 |
| 5930.0 | 99 |
| 5931.0 | 100 |
| 5932.0 | 99 |
| 5933.0 | 98 |
| 5934.0 | 99 |
| 5935.0 | 100 |
| 5936.0 | 99 |
| 5937.0 | 100 |
| 5938.0 | 101 |
| 5939.0 | 102 |
| 5940.0 | 103 |
| 5941.0 | 102 |
| 5942.0 | 101 |
| 5943.0 | 102 |
| 5944.0 | 101 |
| 5945.0 | 100 |
| 5946.0 | 99 |
| 5947.0 | 100 |
| 5948.0 | 101 |
| 5949.0 | 100 |
| 5950.0 | 101 |
| 5951.0 | 102 |
| 5952.0 | 101 |
| 5953.0 | 100 |
| 5954.0 | 101 |
| 5955.0 | 100 |
| 5956.0 | 101 |
| 5957.0 | 100 |
| 5958.0 | 99 |
| 5959.0 | 100 |
| 5960.0 | 101 |
| 5961.0 | 102 |
| 5962.0 | 101 |
| 5963.0 | 102 |
| 5964.0 | 103 |
| 5965.0 | 104 |
| 5966.0 | 103 |
| 5967.0 | 104 |
| 5968.0 | 105 |
| 5969.0 | 104 |
| 5970.0 | 103 |
| 5971.0 | 104 |
| 5972.0 | 103 |
| 5973.0 | 104 |
| 5974.0 | 105 |
| 5975.0 | 106 |
| 5976.0 | 107 |
| 5977.0 | 108 |
| 5978.0 | 109 |
| 5979.0 | 110 |
| 5980.0 | 109 |
| 5981.0 | 108 |
| 5982.0 | 109 |
| 5983.0 | 110 |
| 5984.0 | 111 |
| 5985.0 | 112 |
| 5986.0 | 113 |
| 5987.0 | 114 |
| 5988.0 | 115 |
| 5989.0 | 114 |
| 5990.0 | 115 |
| 5991.0 | 114 |
| 5992.0 | 115 |
| 5993.0 | 116 |
| 5994.0 | 115 |
| 5995.0 | 114 |
| 5996.0 | 115 |
| 5997.0 | 116 |
| 5998.0 | 117 |
| 5999.0 | 118 |
| 6000.0 | 119 |
| 6001.0 | 118 |
| 6002.0 | 119 |
| 6003.0 | 118 |
| 6004.0 | 119 |
| 6005.0 | 118 |
| 6006.0 | 117 |
| 6007.0 | 118 |
| 6008.0 | 119 |
| 6009.0 | 120 |
| 6010.0 | 119 |
| 6011.0 | 118 |
| 6012.0 | 119 |
| 6013.0 | 120 |
| 6014.0 | 121 |
| 6015.0 | 122 |
| 6016.0 | 123 |
| 6017.0 | 122 |
| 6018.0 | 121 |
| 6019.0 | 122 |
| 6020.0 | 123 |
| 6021.0 | 122 |
| 6022.0 | 121 |
| 6023.0 | 122 |
| 6024.0 | 121 |
| 6025.0 | 120 |
| 6026.0 | 121 |
| 6027.0 | 120 |
| 6028.0 | 121 |
| 6029.0 | 122 |
| 6030.0 | 121 |
| 6031.0 | 122 |
| 6032.0 | 121 |
| 6033.0 | 120 |
| 6034.0 | 119 |
| 6035.0 | 118 |
| 6036.0 | 119 |
| 6037.0 | 120 |
| 6038.0 | 119 |
| 6039.0 | 118 |
| 6040.0 | 119 |
| 6041.0 | 118 |
| 6042.0 | 117 |
| 6043.0 | 116 |
| 6044.0 | 115 |
| 6045.0 | 116 |
| 6046.0 | 117 |
| 6047.0 | 116 |
| 6048.0 | 117 |
| 6049.0 | 118 |
| 6050.0 | 117 |
| 6051.0 | 116 |
| 6052.0 | 115 |
| 6053.0 | 116 |
| 6054.0 | 117 |
| 6055.0 | 118 |
| 6056.0 | 117 |
| 6057.0 | 118 |
| 6058.0 | 117 |
| 6059.0 | 118 |
| 6060.0 | 119 |
| 6061.0 | 120 |
| 6062.0 | 119 |
| 6063.0 | 118 |
| 6064.0 | 119 |
| 6065.0 | 120 |
| 6066.0 | 119 |
| 6067.0 | 120 |
| 6068.0 | 119 |
| 6069.0 | 118 |
| 6070.0 | 117 |
| 6071.0 | 116 |
| 6072.0 | 115 |
| 6073.0 | 116 |
| 6074.0 | 115 |
| 6075.0 | 116 |
| 6076.0 | 117 |
| 6077.0 | 116 |
| 6078.0 | 115 |
| 6079.0 | 116 |
| 6080.0 | 115 |
| 6081.0 | 116 |
| 6082.0 | 115 |
| 6083.0 | 116 |
| 6084.0 | 115 |
| 6085.0 | 116 |
| 6086.0 | 117 |
| 6087.0 | 118 |
| 6088.0 | 119 |
| 6089.0 | 118 |
| 6090.0 | 117 |
| 6091.0 | 116 |
| 6092.0 | 115 |
| 6093.0 | 114 |
| 6094.0 | 115 |
| 6095.0 | 116 |
| 6096.0 | 117 |
| 6097.0 | 118 |
| 6098.0 | 117 |
| 6099.0 | 116 |
| 6100.0 | 115 |
| 6101.0 | 114 |
| 6102.0 | 115 |
| 6103.0 | 116 |
| 6104.0 | 117 |
| 6105.0 | 118 |
| 6106.0 | 117 |
| 6107.0 | 116 |
| 6108.0 | 117 |
| 6109.0 | 118 |
| 6110.0 | 117 |
| 6111.0 | 116 |
| 6112.0 | 115 |
| 6113.0 | 116 |
| 6114.0 | 115 |
| 6115.0 | 114 |
| 6116.0 | 113 |
| 6117.0 | 112 |
| 6118.0 | 111 |
| 6119.0 | 110 |
| 6120.0 | 111 |
| 6121.0 | 110 |
| 6122.0 | 109 |
| 6123.0 | 110 |
| 6124.0 | 111 |
| 6125.0 | 110 |
| 6126.0 | 109 |
| 6127.0 | 110 |
| 6128.0 | 109 |
| 6129.0 | 108 |
| 6130.0 | 109 |
| 6131.0 | 108 |
| 6132.0 | 107 |
| 6133.0 | 108 |
| 6134.0 | 107 |
| 6135.0 | 106 |
| 6136.0 | 107 |
| 6137.0 | 106 |
| 6138.0 | 105 |
| 6139.0 | 104 |
| 6140.0 | 105 |
| 6141.0 | 106 |
| 6142.0 | 105 |
| 6143.0 | 104 |
| 6144.0 | 103 |
| 6145.0 | 104 |
| 6146.0 | 103 |
| 6147.0 | 104 |
| 6148.0 | 105 |
| 6149.0 | 106 |
| 6150.0 | 105 |
| 6151.0 | 106 |
| 6152.0 | 105 |
| 6153.0 | 106 |
| 6154.0 | 107 |
| 6155.0 | 108 |
| 6156.0 | 109 |
| 6157.0 | 108 |
| 6158.0 | 107 |
| 6159.0 | 108 |
| 6160.0 | 109 |
| 6161.0 | 110 |
| 6162.0 | 109 |
| 6163.0 | 110 |
| 6164.0 | 109 |
| 6165.0 | 108 |
| 6166.0 | 109 |
| 6167.0 | 110 |
| 6168.0 | 111 |
| 6169.0 | 110 |
| 6170.0 | 109 |
| 6171.0 | 108 |
| 6172.0 | 109 |
| 6173.0 | 110 |
| 6174.0 | 111 |
| 6175.0 | 110 |
| 6176.0 | 111 |
| 6177.0 | 112 |
| 6178.0 | 111 |
| 6179.0 | 110 |
| 6180.0 | 111 |
| 6181.0 | 112 |
| 6182.0 | 111 |
| 6183.0 | 112 |
| 6184.0 | 113 |
| 6185.0 | 112 |
| 6186.0 | 111 |
| 6187.0 | 110 |
| 6188.0 | 111 |
| 6189.0 | 112 |
| 6190.0 | 113 |
| 6191.0 | 114 |
| 6192.0 | 113 |
| 6193.0 | 114 |
| 6194.0 | 113 |
| 6195.0 | 112 |
| 6196.0 | 113 |
| 6197.0 | 114 |
| 6198.0 | 113 |
| 6199.0 | 114 |
| 6200.0 | 115 |
| 6201.0 | 116 |
| 6202.0 | 117 |
| 6203.0 | 116 |
| 6204.0 | 117 |
| 6205.0 | 118 |
| 6206.0 | 119 |
| 6207.0 | 118 |
| 6208.0 | 119 |
| 6209.0 | 118 |
| 6210.0 | 119 |
| 6211.0 | 118 |
| 6212.0 | 119 |
| 6213.0 | 120 |
| 6214.0 | 119 |
| 6215.0 | 120 |
| 6216.0 | 119 |
| 6217.0 | 120 |
| 6218.0 | 121 |
| 6219.0 | 120 |
| 6220.0 | 119 |
| 6221.0 | 118 |
| 6222.0 | 117 |
| 6223.0 | 116 |
| 6224.0 | 117 |
| 6225.0 | 118 |
| 6226.0 | 119 |
| 6227.0 | 120 |
| 6228.0 | 121 |
| 6229.0 | 120 |
| 6230.0 | 121 |
| 6231.0 | 120 |
| 6232.0 | 119 |
| 6233.0 | 118 |
| 6234.0 | 119 |
| 6235.0 | 120 |
| 6236.0 | 119 |
| 6237.0 | 118 |
| 6238.0 | 117 |
| 6239.0 | 116 |
| 6240.0 | 117 |
| 6241.0 | 116 |
| 6242.0 | 115 |
| 6243.0 | 116 |
| 6244.0 | 117 |
| 6245.0 | 116 |
| 6246.0 | 115 |
| 6247.0 | 116 |
| 6248.0 | 117 |
| 6249.0 | 116 |
| 6250.0 | 117 |
| 6251.0 | 118 |
| 6252.0 | 117 |
| 6253.0 | 116 |
| 6254.0 | 117 |
| 6255.0 | 118 |
| 6256.0 | 119 |
| 6257.0 | 120 |
| 6258.0 | 119 |
| 6259.0 | 118 |
| 6260.0 | 117 |
| 6261.0 | 118 |
| 6262.0 | 119 |
| 6263.0 | 120 |
| 6264.0 | 121 |
| 6265.0 | 120 |
| 6266.0 | 121 |
| 6267.0 | 122 |
| 6268.0 | 121 |
| 6269.0 | 122 |
| 6270.0 | 123 |
| 6271.0 | 122 |
| 6272.0 | 123 |
| 6273.0 | 124 |
| 6274.0 | 125 |
| 6275.0 | 124 |
| 6276.0 | 125 |
| 6277.0 | 126 |
| 6278.0 | 127 |
| 6279.0 | 126 |
| 6280.0 | 127 |
| 6281.0 | 126 |
| 6282.0 | 127 |
| 6283.0 | 126 |
| 6284.0 | 127 |
| 6285.0 | 126 |
| 6286.0 | 125 |
| 6287.0 | 126 |
| 6288.0 | 125 |
| 6289.0 | 126 |
| 6290.0 | 127 |
| 6291.0 | 126 |
| 6292.0 | 127 |
| 6293.0 | 126 |
| 6294.0 | 125 |
| 6295.0 | 124 |
| 6296.0 | 125 |
| 6297.0 | 124 |
| 6298.0 | 125 |
| 6299.0 | 124 |
| 6300.0 | 123 |
| 6301.0 | 124 |
| 6302.0 | 123 |
| 6303.0 | 122 |
| 6304.0 | 123 |
| 6305.0 | 124 |
| 6306.0 | 123 |
| 6307.0 | 124 |
| 6308.0 | 125 |
| 6309.0 | 126 |
| 6310.0 | 127 |
| 6311.0 | 126 |
| 6312.0 | 125 |
| 6313.0 | 124 |
| 6314.0 | 125 |
| 6315.0 | 126 |
| 6316.0 | 125 |
| 6317.0 | 126 |
| 6318.0 | 127 |
| 6319.0 | 126 |
| 6320.0 | 125 |
| 6321.0 | 124 |
| 6322.0 | 125 |
| 6323.0 | 124 |
| 6324.0 | 125 |
| 6325.0 | 126 |
| 6326.0 | 125 |
| 6327.0 | 124 |
| 6328.0 | 123 |
| 6329.0 | 124 |
| 6330.0 | 125 |
| 6331.0 | 124 |
| 6332.0 | 123 |
| 6333.0 | 124 |
| 6334.0 | 125 |
| 6335.0 | 124 |
| 6336.0 | 123 |
| 6337.0 | 122 |
| 6338.0 | 123 |
| 6339.0 | 122 |
| 6340.0 | 123 |
| 6341.0 | 124 |
| 6342.0 | 125 |
| 6343.0 | 124 |
| 6344.0 | 125 |
| 6345.0 | 126 |
| 6346.0 | 127 |
| 6347.0 | 128 |
| 6348.0 | 127 |
| 6349.0 | 126 |
| 6350.0 | 125 |
| 6351.0 | 126 |
| 6352.0 | 127 |
| 6353.0 | 128 |
| 6354.0 | 129 |
| 6355.0 | 130 |
| 6356.0 | 129 |
| 6357.0 | 130 |
| 6358.0 | 129 |
| 6359.0 | 130 |
| 6360.0 | 129 |
| 6361.0 | 128 |
| 6362.0 | 129 |
| 6363.0 | 128 |
| 6364.0 | 127 |
| 6365.0 | 126 |
| 6366.0 | 125 |
| 6367.0 | 126 |
| 6368.0 | 127 |
| 6369.0 | 128 |
| 6370.0 | 129 |
| 6371.0 | 128 |
| 6372.0 | 127 |
| 6373.0 | 128 |
| 6374.0 | 127 |
| 6375.0 | 126 |
| 6376.0 | 125 |
| 6377.0 | 124 |
| 6378.0 | 123 |
| 6379.0 | 122 |
| 6380.0 | 121 |
| 6381.0 | 120 |
| 6382.0 | 121 |
| 6383.0 | 122 |
| 6384.0 | 121 |
| 6385.0 | 122 |
| 6386.0 | 123 |
| 6387.0 | 124 |
| 6388.0 | 123 |
| 6389.0 | 122 |
| 6390.0 | 121 |
| 6391.0 | 122 |
| 6392.0 | 123 |
| 6393.0 | 122 |
| 6394.0 | 121 |
| 6395.0 | 120 |
| 6396.0 | 121 |
| 6397.0 | 120 |
| 6398.0 | 119 |
| 6399.0 | 118 |
| 6400.0 | 119 |
| 6401.0 | 120 |
| 6402.0 | 119 |
| 6403.0 | 118 |
| 6404.0 | 117 |
| 6405.0 | 118 |
| 6406.0 | 117 |
| 6407.0 | 118 |
| 6408.0 | 119 |
| 6409.0 | 118 |
| 6410.0 | 117 |
| 6411.0 | 118 |
| 6412.0 | 119 |
| 6413.0 | 118 |
| 6414.0 | 119 |
| 6415.0 | 120 |
| 6416.0 | 119 |
| 6417.0 | 120 |
| 6418.0 | 121 |
| 6419.0 | 120 |
| 6420.0 | 119 |
| 6421.0 | 120 |
| 6422.0 | 119 |
| 6423.0 | 118 |
| 6424.0 | 117 |
| 6425.0 | 118 |
| 6426.0 | 119 |
| 6427.0 | 120 |
| 6428.0 | 121 |
| 6429.0 | 120 |
| 6430.0 | 119 |
| 6431.0 | 120 |
| 6432.0 | 121 |
| 6433.0 | 122 |
| 6434.0 | 123 |
| 6435.0 | 122 |
| 6436.0 | 121 |
| 6437.0 | 120 |
| 6438.0 | 121 |
| 6439.0 | 120 |
| 6440.0 | 121 |
| 6441.0 | 120 |
| 6442.0 | 121 |
| 6443.0 | 122 |
| 6444.0 | 121 |
| 6445.0 | 122 |
| 6446.0 | 123 |
| 6447.0 | 124 |
| 6448.0 | 125 |
| 6449.0 | 124 |
| 6450.0 | 125 |
| 6451.0 | 126 |
| 6452.0 | 127 |
| 6453.0 | 126 |
| 6454.0 | 127 |
| 6455.0 | 128 |
| 6456.0 | 129 |
| 6457.0 | 130 |
| 6458.0 | 131 |
| 6459.0 | 130 |
| 6460.0 | 129 |
| 6461.0 | 130 |
| 6462.0 | 129 |
| 6463.0 | 128 |
| 6464.0 | 127 |
| 6465.0 | 126 |
| 6466.0 | 125 |
| 6467.0 | 126 |
| 6468.0 | 125 |
| 6469.0 | 124 |
| 6470.0 | 125 |
| 6471.0 | 126 |
| 6472.0 | 127 |
| 6473.0 | 126 |
| 6474.0 | 127 |
| 6475.0 | 126 |
| 6476.0 | 125 |
| 6477.0 | 126 |
| 6478.0 | 127 |
| 6479.0 | 128 |
| 6480.0 | 127 |
| 6481.0 | 128 |
| 6482.0 | 129 |
| 6483.0 | 130 |
| 6484.0 | 131 |
| 6485.0 | 130 |
| 6486.0 | 131 |
| 6487.0 | 132 |
| 6488.0 | 133 |
| 6489.0 | 134 |
| 6490.0 | 133 |
| 6491.0 | 132 |
| 6492.0 | 133 |
| 6493.0 | 134 |
| 6494.0 | 133 |
| 6495.0 | 132 |
| 6496.0 | 131 |
| 6497.0 | 130 |
| 6498.0 | 131 |
| 6499.0 | 132 |
| 6500.0 | 131 |
| 6501.0 | 130 |
| 6502.0 | 131 |
| 6503.0 | 132 |
| 6504.0 | 131 |
| 6505.0 | 132 |
| 6506.0 | 133 |
| 6507.0 | 132 |
| 6508.0 | 131 |
| 6509.0 | 132 |
| 6510.0 | 131 |
| 6511.0 | 130 |
| 6512.0 | 131 |
| 6513.0 | 130 |
| 6514.0 | 129 |
| 6515.0 | 130 |
| 6516.0 | 129 |
| 6517.0 | 130 |
| 6518.0 | 131 |
| 6519.0 | 130 |
| 6520.0 | 129 |
| 6521.0 | 128 |
| 6522.0 | 129 |
| 6523.0 | 130 |
| 6524.0 | 129 |
| 6525.0 | 130 |
| 6526.0 | 131 |
| 6527.0 | 130 |
| 6528.0 | 131 |
| 6529.0 | 132 |
| 6530.0 | 131 |
| 6531.0 | 130 |
| 6532.0 | 129 |
| 6533.0 | 128 |
| 6534.0 | 129 |
| 6535.0 | 128 |
| 6536.0 | 129 |
| 6537.0 | 128 |
| 6538.0 | 127 |
| 6539.0 | 128 |
| 6540.0 | 129 |
| 6541.0 | 130 |
| 6542.0 | 129 |
| 6543.0 | 128 |
| 6544.0 | 129 |
| 6545.0 | 130 |
| 6546.0 | 131 |
| 6547.0 | 130 |
| 6548.0 | 129 |
| 6549.0 | 128 |
| 6550.0 | 127 |
| 6551.0 | 128 |
| 6552.0 | 129 |
| 6553.0 | 128 |
| 6554.0 | 129 |
| 6555.0 | 130 |
| 6556.0 | 129 |
| 6557.0 | 130 |
| 6558.0 | 131 |
| 6559.0 | 132 |
| 6560.0 | 133 |
| 6561.0 | 134 |
| 6562.0 | 135 |
| 6563.0 | 134 |
| 6564.0 | 135 |
| 6565.0 | 136 |
| 6566.0 | 135 |
| 6567.0 | 134 |
| 6568.0 | 133 |
| 6569.0 | 134 |
| 6570.0 | 135 |
| 6571.0 | 134 |
| 6572.0 | 135 |
| 6573.0 | 134 |
| 6574.0 | 133 |
| 6575.0 | 132 |
| 6576.0 | 133 |
| 6577.0 | 134 |
| 6578.0 | 135 |
| 6579.0 | 136 |
| 6580.0 | 137 |
| 6581.0 | 138 |
| 6582.0 | 139 |
| 6583.0 | 138 |
| 6584.0 | 137 |
| 6585.0 | 138 |
| 6586.0 | 137 |
| 6587.0 | 136 |
| 6588.0 | 137 |
| 6589.0 | 138 |
| 6590.0 | 137 |
| 6591.0 | 138 |
| 6592.0 | 137 |
| 6593.0 | 136 |
| 6594.0 | 135 |
| 6595.0 | 136 |
| 6596.0 | 137 |
| 6597.0 | 138 |
| 6598.0 | 139 |
| 6599.0 | 138 |
| 6600.0 | 137 |
| 6601.0 | 138 |
| 6602.0 | 137 |
| 6603.0 | 138 |
| 6604.0 | 139 |
| 6605.0 | 140 |
| 6606.0 | 139 |
| 6607.0 | 140 |
| 6608.0 | 141 |
| 6609.0 | 140 |
| 6610.0 | 139 |
| 6611.0 | 140 |
| 6612.0 | 139 |
| 6613.0 | 140 |
| 6614.0 | 141 |
| 6615.0 | 140 |
| 6616.0 | 141 |
| 6617.0 | 142 |
| 6618.0 | 143 |
| 6619.0 | 142 |
| 6620.0 | 143 |
| 6621.0 | 144 |
| 6622.0 | 143 |
| 6623.0 | 144 |
| 6624.0 | 143 |
| 6625.0 | 142 |
| 6626.0 | 141 |
| 6627.0 | 142 |
| 6628.0 | 143 |
| 6629.0 | 142 |
| 6630.0 | 143 |
| 6631.0 | 142 |
| 6632.0 | 141 |
| 6633.0 | 142 |
| 6634.0 | 143 |
| 6635.0 | 142 |
| 6636.0 | 143 |
| 6637.0 | 144 |
| 6638.0 | 145 |
| 6639.0 | 144 |
| 6640.0 | 143 |
| 6641.0 | 142 |
| 6642.0 | 143 |
| 6643.0 | 142 |
| 6644.0 | 141 |
| 6645.0 | 142 |
| 6646.0 | 141 |
| 6647.0 | 140 |
| 6648.0 | 139 |
| 6649.0 | 140 |
| 6650.0 | 141 |
| 6651.0 | 140 |
| 6652.0 | 141 |
| 6653.0 | 140 |
| 6654.0 | 141 |
| 6655.0 | 142 |
| 6656.0 | 143 |
| 6657.0 | 142 |
| 6658.0 | 141 |
| 6659.0 | 142 |
| 6660.0 | 143 |
| 6661.0 | 142 |
| 6662.0 | 141 |
| 6663.0 | 142 |
| 6664.0 | 143 |
| 6665.0 | 144 |
| 6666.0 | 143 |
| 6667.0 | 142 |
| 6668.0 | 143 |
| 6669.0 | 144 |
| 6670.0 | 143 |
| 6671.0 | 142 |
| 6672.0 | 141 |
| 6673.0 | 142 |
| 6674.0 | 141 |
| 6675.0 | 142 |
| 6676.0 | 143 |
| 6677.0 | 142 |
| 6678.0 | 143 |
| 6679.0 | 142 |
| 6680.0 | 143 |
| 6681.0 | 144 |
| 6682.0 | 143 |
| 6683.0 | 144 |
| 6684.0 | 143 |
| 6685.0 | 144 |
| 6686.0 | 143 |
| 6687.0 | 144 |
| 6688.0 | 143 |
| 6689.0 | 144 |
| 6690.0 | 143 |
| 6691.0 | 142 |
| 6692.0 | 141 |
| 6693.0 | 142 |
| 6694.0 | 143 |
| 6695.0 | 144 |
| 6696.0 | 143 |
| 6697.0 | 144 |
| 6698.0 | 143 |
| 6699.0 | 142 |
| 6700.0 | 141 |
| 6701.0 | 142 |
| 6702.0 | 143 |
| 6703.0 | 142 |
| 6704.0 | 143 |
| 6705.0 | 144 |
| 6706.0 | 143 |
| 6707.0 | 142 |
| 6708.0 | 141 |
| 6709.0 | 142 |
| 6710.0 | 143 |
| 6711.0 | 144 |
| 6712.0 | 143 |
| 6713.0 | 142 |
| 6714.0 | 141 |
| 6715.0 | 140 |
| 6716.0 | 139 |
| 6717.0 | 140 |
| 6718.0 | 141 |
| 6719.0 | 142 |
| 6720.0 | 141 |
| 6721.0 | 140 |
| 6722.0 | 141 |
| 6723.0 | 142 |
| 6724.0 | 141 |
| 6725.0 | 140 |
| 6726.0 | 141 |
| 6727.0 | 142 |
| 6728.0 | 143 |
| 6729.0 | 142 |
| 6730.0 | 141 |
| 6731.0 | 140 |
| 6732.0 | 139 |
| 6733.0 | 140 |
| 6734.0 | 139 |
| 6735.0 | 140 |
| 6736.0 | 139 |
| 6737.0 | 138 |
| 6738.0 | 137 |
| 6739.0 | 138 |
| 6740.0 | 139 |
| 6741.0 | 138 |
| 6742.0 | 139 |
| 6743.0 | 140 |
| 6744.0 | 139 |
| 6745.0 | 138 |
| 6746.0 | 137 |
| 6747.0 | 136 |
| 6748.0 | 137 |
| 6749.0 | 138 |
| 6750.0 | 139 |
| 6751.0 | 140 |
| 6752.0 | 139 |
| 6753.0 | 140 |
| 6754.0 | 139 |
| 6755.0 | 138 |
| 6756.0 | 137 |
| 6757.0 | 136 |
| 6758.0 | 137 |
| 6759.0 | 138 |
| 6760.0 | 139 |
| 6761.0 | 138 |
| 6762.0 | 139 |
| 6763.0 | 140 |
| 6764.0 | 141 |
| 6765.0 | 140 |
| 6766.0 | 139 |
| 6767.0 | 140 |
| 6768.0 | 139 |
| 6769.0 | 138 |
| 6770.0 | 137 |
| 6771.0 | 136 |
| 6772.0 | 135 |
| 6773.0 | 134 |
| 6774.0 | 133 |
| 6775.0 | 134 |
| 6776.0 | 133 |
| 6777.0 | 132 |
| 6778.0 | 133 |
| 6779.0 | 134 |
| 6780.0 | 133 |
| 6781.0 | 134 |
| 6782.0 | 135 |
| 6783.0 | 136 |
| 6784.0 | 137 |
| 6785.0 | 136 |
| 6786.0 | 137 |
| 6787.0 | 138 |
| 6788.0 | 137 |
| 6789.0 | 136 |
| 6790.0 | 137 |
| 6791.0 | 136 |
| 6792.0 | 137 |
| 6793.0 | 136 |
| 6794.0 | 137 |
| 6795.0 | 136 |
| 6796.0 | 135 |
| 6797.0 | 134 |
| 6798.0 | 135 |
| 6799.0 | 134 |
| 6800.0 | 133 |
| 6801.0 | 134 |
| 6802.0 | 133 |
| 6803.0 | 132 |
| 6804.0 | 131 |
| 6805.0 | 130 |
| 6806.0 | 129 |
| 6807.0 | 128 |
| 6808.0 | 129 |
| 6809.0 | 130 |
| 6810.0 | 131 |
| 6811.0 | 132 |
| 6812.0 | 133 |
| 6813.0 | 134 |
| 6814.0 | 133 |
| 6815.0 | 132 |
| 6816.0 | 131 |
| 6817.0 | 130 |
| 6818.0 | 129 |
| 6819.0 | 130 |
| 6820.0 | 131 |
| 6821.0 | 130 |
| 6822.0 | 131 |
| 6823.0 | 130 |
| 6824.0 | 131 |
| 6825.0 | 130 |
| 6826.0 | 131 |
| 6827.0 | 132 |
| 6828.0 | 133 |
| 6829.0 | 132 |
| 6830.0 | 131 |
| 6831.0 | 132 |
| 6832.0 | 131 |
| 6833.0 | 130 |
| 6834.0 | 131 |
| 6835.0 | 130 |
| 6836.0 | 131 |
| 6837.0 | 132 |
| 6838.0 | 131 |
| 6839.0 | 132 |
| 6840.0 | 133 |
| 6841.0 | 134 |
| 6842.0 | 133 |
| 6843.0 | 132 |
| 6844.0 | 131 |
| 6845.0 | 132 |
| 6846.0 | 131 |
| 6847.0 | 132 |
| 6848.0 | 131 |
| 6849.0 | 132 |
| 6850.0 | 133 |
| 6851.0 | 132 |
| 6852.0 | 133 |
| 6853.0 | 134 |
| 6854.0 | 133 |
| 6855.0 | 134 |
| 6856.0 | 135 |
| 6857.0 | 134 |
| 6858.0 | 133 |
| 6859.0 | 132 |
| 6860.0 | 133 |
| 6861.0 | 132 |
| 6862.0 | 133 |
| 6863.0 | 134 |
| 6864.0 | 135 |
| 6865.0 | 134 |
| 6866.0 | 135 |
| 6867.0 | 136 |
| 6868.0 | 135 |
| 6869.0 | 136 |
| 6870.0 | 135 |
| 6871.0 | 136 |
| 6872.0 | 135 |
| 6873.0 | 136 |
| 6874.0 | 137 |
| 6875.0 | 138 |
| 6876.0 | 139 |
| 6877.0 | 140 |
| 6878.0 | 139 |
| 6879.0 | 140 |
| 6880.0 | 139 |
| 6881.0 | 140 |
| 6882.0 | 139 |
| 6883.0 | 140 |
| 6884.0 | 139 |
| 6885.0 | 138 |
| 6886.0 | 139 |
| 6887.0 | 138 |
| 6888.0 | 137 |
| 6889.0 | 136 |
| 6890.0 | 137 |
| 6891.0 | 138 |
| 6892.0 | 137 |
| 6893.0 | 138 |
| 6894.0 | 139 |
| 6895.0 | 140 |
| 6896.0 | 141 |
| 6897.0 | 142 |
| 6898.0 | 141 |
| 6899.0 | 142 |
| 6900.0 | 143 |
| 6901.0 | 142 |
| 6902.0 | 141 |
| 6903.0 | 140 |
| 6904.0 | 141 |
| 6905.0 | 140 |
| 6906.0 | 141 |
| 6907.0 | 142 |
| 6908.0 | 141 |
| 6909.0 | 142 |
| 6910.0 | 141 |
| 6911.0 | 140 |
| 6912.0 | 141 |
| 6913.0 | 140 |
| 6914.0 | 141 |
| 6915.0 | 140 |
| 6916.0 | 139 |
| 6917.0 | 138 |
| 6918.0 | 137 |
| 6919.0 | 138 |
| 6920.0 | 139 |
| 6921.0 | 138 |
| 6922.0 | 137 |
| 6923.0 | 138 |
| 6924.0 | 139 |
| 6925.0 | 138 |
| 6926.0 | 137 |
| 6927.0 | 138 |
| 6928.0 | 139 |
| 6929.0 | 138 |
| 6930.0 | 139 |
| 6931.0 | 140 |
| 6932.0 | 139 |
| 6933.0 | 138 |
| 6934.0 | 137 |
| 6935.0 | 136 |
| 6936.0 | 135 |
| 6937.0 | 134 |
| 6938.0 | 135 |
| 6939.0 | 136 |
| 6940.0 | 137 |
| 6941.0 | 138 |
| 6942.0 | 137 |
| 6943.0 | 136 |
| 6944.0 | 137 |
| 6945.0 | 138 |
| 6946.0 | 137 |
| 6947.0 | 138 |
| 6948.0 | 137 |
| 6949.0 | 138 |
| 6950.0 | 137 |
| 6951.0 | 136 |
| 6952.0 | 135 |
| 6953.0 | 134 |
| 6954.0 | 135 |
| 6955.0 | 134 |
| 6956.0 | 133 |
| 6957.0 | 132 |
| 6958.0 | 131 |
| 6959.0 | 130 |
| 6960.0 | 129 |
| 6961.0 | 130 |
| 6962.0 | 131 |
| 6963.0 | 130 |
| 6964.0 | 129 |
| 6965.0 | 128 |
| 6966.0 | 129 |
| 6967.0 | 130 |
| 6968.0 | 129 |
| 6969.0 | 130 |
| 6970.0 | 131 |
| 6971.0 | 130 |
| 6972.0 | 129 |
| 6973.0 | 130 |
| 6974.0 | 131 |
| 6975.0 | 132 |
| 6976.0 | 133 |
| 6977.0 | 132 |
| 6978.0 | 131 |
| 6979.0 | 132 |
| 6980.0 | 133 |
| 6981.0 | 134 |
| 6982.0 | 133 |
| 6983.0 | 134 |
| 6984.0 | 133 |
| 6985.0 | 134 |
| 6986.0 | 133 |
| 6987.0 | 134 |
| 6988.0 | 133 |
| 6989.0 | 132 |
| 6990.0 | 133 |
| 6991.0 | 134 |
| 6992.0 | 135 |
| 6993.0 | 134 |
| 6994.0 | 135 |
| 6995.0 | 136 |
| 6996.0 | 135 |
| 6997.0 | 134 |
| 6998.0 | 135 |
| 6999.0 | 136 |
| 7000.0 | 137 |
| 7001.0 | 138 |
| 7002.0 | 137 |
| 7003.0 | 138 |
| 7004.0 | 139 |
| 7005.0 | 138 |
| 7006.0 | 137 |
| 7007.0 | 138 |
| 7008.0 | 139 |
| 7009.0 | 138 |
| 7010.0 | 139 |
| 7011.0 | 138 |
| 7012.0 | 137 |
| 7013.0 | 138 |
| 7014.0 | 137 |
| 7015.0 | 138 |
| 7016.0 | 139 |
| 7017.0 | 140 |
| 7018.0 | 141 |
| 7019.0 | 142 |
| 7020.0 | 141 |
| 7021.0 | 142 |
| 7022.0 | 141 |
| 7023.0 | 140 |
| 7024.0 | 141 |
| 7025.0 | 140 |
| 7026.0 | 141 |
| 7027.0 | 140 |
| 7028.0 | 139 |
| 7029.0 | 138 |
| 7030.0 | 139 |
| 7031.0 | 138 |
| 7032.0 | 139 |
| 7033.0 | 140 |
| 7034.0 | 141 |
| 7035.0 | 142 |
| 7036.0 | 141 |
| 7037.0 | 142 |
| 7038.0 | 143 |
| 7039.0 | 142 |
| 7040.0 | 141 |
| 7041.0 | 142 |
| 7042.0 | 143 |
| 7043.0 | 142 |
| 7044.0 | 141 |
| 7045.0 | 140 |
| 7046.0 | 141 |
| 7047.0 | 140 |
| 7048.0 | 139 |
| 7049.0 | 140 |
| 7050.0 | 141 |
| 7051.0 | 140 |
| 7052.0 | 141 |
| 7053.0 | 142 |
| 7054.0 | 141 |
| 7055.0 | 140 |
| 7056.0 | 141 |
| 7057.0 | 140 |
| 7058.0 | 139 |
| 7059.0 | 140 |
| 7060.0 | 139 |
| 7061.0 | 138 |
| 7062.0 | 137 |
| 7063.0 | 138 |
| 7064.0 | 139 |
| 7065.0 | 138 |
| 7066.0 | 139 |
| 7067.0 | 138 |
| 7068.0 | 137 |
| 7069.0 | 136 |
| 7070.0 | 135 |
| 7071.0 | 136 |
| 7072.0 | 135 |
| 7073.0 | 136 |
| 7074.0 | 137 |
| 7075.0 | 138 |
| 7076.0 | 137 |
| 7077.0 | 138 |
| 7078.0 | 139 |
| 7079.0 | 138 |
| 7080.0 | 139 |
| 7081.0 | 140 |
| 7082.0 | 139 |
| 7083.0 | 140 |
| 7084.0 | 141 |
| 7085.0 | 140 |
| 7086.0 | 139 |
| 7087.0 | 140 |
| 7088.0 | 141 |
| 7089.0 | 142 |
| 7090.0 | 143 |
| 7091.0 | 144 |
| 7092.0 | 143 |
| 7093.0 | 144 |
| 7094.0 | 145 |
| 7095.0 | 144 |
| 7096.0 | 145 |
| 7097.0 | 146 |
| 7098.0 | 145 |
| 7099.0 | 146 |
| 7100.0 | 147 |
| 7101.0 | 146 |
| 7102.0 | 145 |
| 7103.0 | 146 |
| 7104.0 | 147 |
| 7105.0 | 146 |
| 7106.0 | 147 |
| 7107.0 | 148 |
| 7108.0 | 149 |
| 7109.0 | 148 |
| 7110.0 | 147 |
| 7111.0 | 146 |
| 7112.0 | 147 |
| 7113.0 | 148 |
| 7114.0 | 149 |
| 7115.0 | 150 |
| 7116.0 | 151 |
| 7117.0 | 150 |
| 7118.0 | 151 |
| 7119.0 | 152 |
| 7120.0 | 151 |
| 7121.0 | 152 |
| 7122.0 | 153 |
| 7123.0 | 152 |
| 7124.0 | 151 |
| 7125.0 | 152 |
| 7126.0 | 151 |
| 7127.0 | 152 |
| 7128.0 | 153 |
| 7129.0 | 154 |
| 7130.0 | 155 |
| 7131.0 | 154 |
| 7132.0 | 153 |
| 7133.0 | 152 |
| 7134.0 | 151 |
| 7135.0 | 152 |
| 7136.0 | 153 |
| 7137.0 | 154 |
| 7138.0 | 153 |
| 7139.0 | 154 |
| 7140.0 | 155 |
| 7141.0 | 156 |
| 7142.0 | 157 |
| 7143.0 | 156 |
| 7144.0 | 155 |
| 7145.0 | 154 |
| 7146.0 | 155 |
| 7147.0 | 154 |
| 7148.0 | 153 |
| 7149.0 | 154 |
| 7150.0 | 155 |
| 7151.0 | 156 |
| 7152.0 | 157 |
| 7153.0 | 158 |
| 7154.0 | 157 |
| 7155.0 | 158 |
| 7156.0 | 157 |
| 7157.0 | 156 |
| 7158.0 | 157 |
| 7159.0 | 156 |
| 7160.0 | 157 |
| 7161.0 | 158 |
| 7162.0 | 159 |
| 7163.0 | 160 |
| 7164.0 | 159 |
| 7165.0 | 160 |
| 7166.0 | 161 |
| 7167.0 | 160 |
| 7168.0 | 161 |
| 7169.0 | 160 |
| 7170.0 | 159 |
| 7171.0 | 158 |
| 7172.0 | 159 |
| 7173.0 | 158 |
| 7174.0 | 159 |
| 7175.0 | 158 |
| 7176.0 | 157 |
| 7177.0 | 156 |
| 7178.0 | 155 |
| 7179.0 | 156 |
| 7180.0 | 157 |
| 7181.0 | 158 |
| 7182.0 | 157 |
| 7183.0 | 156 |
| 7184.0 | 155 |
| 7185.0 | 156 |
| 7186.0 | 155 |
| 7187.0 | 154 |
| 7188.0 | 155 |
| 7189.0 | 154 |
| 7190.0 | 155 |
| 7191.0 | 156 |
| 7192.0 | 157 |
| 7193.0 | 158 |
| 7194.0 | 157 |
| 7195.0 | 156 |
| 7196.0 | 157 |
| 7197.0 | 156 |
| 7198.0 | 155 |
| 7199.0 | 154 |
| 7200.0 | 155 |
| 7201.0 | 156 |
| 7202.0 | 155 |
| 7203.0 | 156 |
| 7204.0 | 157 |
| 7205.0 | 156 |
| 7206.0 | 155 |
| 7207.0 | 156 |
| 7208.0 | 155 |
| 7209.0 | 154 |
| 7210.0 | 153 |
| 7211.0 | 152 |
| 7212.0 | 151 |
| 7213.0 | 152 |
| 7214.0 | 151 |
| 7215.0 | 150 |
| 7216.0 | 151 |
| 7217.0 | 152 |
| 7218.0 | 151 |
| 7219.0 | 150 |
| 7220.0 | 151 |
| 7221.0 | 150 |
| 7222.0 | 151 |
| 7223.0 | 150 |
| 7224.0 | 151 |
| 7225.0 | 152 |
| 7226.0 | 153 |
| 7227.0 | 152 |
| 7228.0 | 151 |
| 7229.0 | 150 |
| 7230.0 | 149 |
| 7231.0 | 150 |
| 7232.0 | 149 |
| 7233.0 | 150 |
| 7234.0 | 151 |
| 7235.0 | 150 |
| 7236.0 | 151 |
| 7237.0 | 150 |
| 7238.0 | 151 |
| 7239.0 | 152 |
| 7240.0 | 151 |
| 7241.0 | 152 |
| 7242.0 | 151 |
| 7243.0 | 152 |
| 7244.0 | 151 |
| 7245.0 | 152 |
| 7246.0 | 153 |
| 7247.0 | 152 |
| 7248.0 | 151 |
| 7249.0 | 152 |
| 7250.0 | 151 |
| 7251.0 | 150 |
| 7252.0 | 151 |
| 7253.0 | 150 |
| 7254.0 | 151 |
| 7255.0 | 152 |
| 7256.0 | 151 |
| 7257.0 | 150 |
| 7258.0 | 151 |
| 7259.0 | 150 |
| 7260.0 | 151 |
| 7261.0 | 152 |
| 7262.0 | 151 |
| 7263.0 | 152 |
| 7264.0 | 153 |
| 7265.0 | 152 |
| 7266.0 | 151 |
| 7267.0 | 150 |
| 7268.0 | 151 |
| 7269.0 | 150 |
| 7270.0 | 151 |
| 7271.0 | 150 |
| 7272.0 | 149 |
| 7273.0 | 150 |
| 7274.0 | 151 |
| 7275.0 | 152 |
| 7276.0 | 151 |
| 7277.0 | 152 |
| 7278.0 | 153 |
| 7279.0 | 154 |
| 7280.0 | 155 |
| 7281.0 | 154 |
| 7282.0 | 153 |
| 7283.0 | 154 |
| 7284.0 | 155 |
| 7285.0 | 156 |
| 7286.0 | 155 |
| 7287.0 | 156 |
| 7288.0 | 155 |
| 7289.0 | 156 |
| 7290.0 | 157 |
| 7291.0 | 158 |
| 7292.0 | 159 |
| 7293.0 | 160 |
| 7294.0 | 159 |
| 7295.0 | 160 |
| 7296.0 | 159 |
| 7297.0 | 158 |
| 7298.0 | 157 |
| 7299.0 | 156 |
| 7300.0 | 157 |
| 7301.0 | 158 |
| 7302.0 | 157 |
| 7303.0 | 158 |
| 7304.0 | 159 |
| 7305.0 | 160 |
| 7306.0 | 159 |
| 7307.0 | 160 |
| 7308.0 | 161 |
| 7309.0 | 162 |
| 7310.0 | 163 |
| 7311.0 | 164 |
| 7312.0 | 165 |
| 7313.0 | 166 |
| 7314.0 | 167 |
| 7315.0 | 168 |
| 7316.0 | 167 |
| 7317.0 | 168 |
| 7318.0 | 167 |
| 7319.0 | 168 |
| 7320.0 | 167 |
| 7321.0 | 166 |
| 7322.0 | 167 |
| 7323.0 | 166 |
| 7324.0 | 167 |
| 7325.0 | 168 |
| 7326.0 | 169 |
| 7327.0 | 170 |
| 7328.0 | 171 |
| 7329.0 | 172 |
| 7330.0 | 173 |
| 7331.0 | 172 |
| 7332.0 | 171 |
| 7333.0 | 172 |
| 7334.0 | 171 |
| 7335.0 | 170 |
| 7336.0 | 169 |
| 7337.0 | 170 |
| 7338.0 | 169 |
| 7339.0 | 168 |
| 7340.0 | 169 |
| 7341.0 | 168 |
| 7342.0 | 169 |
| 7343.0 | 170 |
| 7344.0 | 169 |
| 7345.0 | 170 |
| 7346.0 | 171 |
| 7347.0 | 172 |
| 7348.0 | 171 |
| 7349.0 | 172 |
| 7350.0 | 171 |
| 7351.0 | 170 |
| 7352.0 | 169 |
| 7353.0 | 168 |
| 7354.0 | 169 |
| 7355.0 | 170 |
| 7356.0 | 171 |
| 7357.0 | 172 |
| 7358.0 | 173 |
| 7359.0 | 172 |
| 7360.0 | 173 |
| 7361.0 | 174 |
| 7362.0 | 173 |
| 7363.0 | 174 |
| 7364.0 | 175 |
| 7365.0 | 174 |
| 7366.0 | 173 |
| 7367.0 | 172 |
| 7368.0 | 171 |
| 7369.0 | 170 |
| 7370.0 | 171 |
| 7371.0 | 172 |
| 7372.0 | 171 |
| 7373.0 | 172 |
| 7374.0 | 171 |
| 7375.0 | 170 |
| 7376.0 | 171 |
| 7377.0 | 170 |
| 7378.0 | 169 |
| 7379.0 | 168 |
| 7380.0 | 167 |
| 7381.0 | 168 |
| 7382.0 | 167 |
| 7383.0 | 166 |
| 7384.0 | 167 |
| 7385.0 | 166 |
| 7386.0 | 167 |
| 7387.0 | 168 |
| 7388.0 | 167 |
| 7389.0 | 166 |
| 7390.0 | 167 |
| 7391.0 | 166 |
| 7392.0 | 167 |
| 7393.0 | 166 |
| 7394.0 | 167 |
| 7395.0 | 168 |
| 7396.0 | 167 |
| 7397.0 | 168 |
| 7398.0 | 167 |
| 7399.0 | 168 |
| 7400.0 | 169 |
| 7401.0 | 170 |
| 7402.0 | 169 |
| 7403.0 | 168 |
| 7404.0 | 169 |
| 7405.0 | 168 |
| 7406.0 | 167 |
| 7407.0 | 168 |
| 7408.0 | 167 |
| 7409.0 | 166 |
| 7410.0 | 165 |
| 7411.0 | 166 |
| 7412.0 | 167 |
| 7413.0 | 166 |
| 7414.0 | 165 |
| 7415.0 | 164 |
| 7416.0 | 163 |
| 7417.0 | 162 |
| 7418.0 | 163 |
| 7419.0 | 162 |
| 7420.0 | 161 |
| 7421.0 | 160 |
| 7422.0 | 159 |
| 7423.0 | 160 |
| 7424.0 | 161 |
| 7425.0 | 162 |
| 7426.0 | 163 |
| 7427.0 | 162 |
| 7428.0 | 163 |
| 7429.0 | 164 |
| 7430.0 | 163 |
| 7431.0 | 164 |
| 7432.0 | 165 |
| 7433.0 | 164 |
| 7434.0 | 163 |
| 7435.0 | 164 |
| 7436.0 | 165 |
| 7437.0 | 166 |
| 7438.0 | 167 |
| 7439.0 | 166 |
| 7440.0 | 165 |
| 7441.0 | 164 |
| 7442.0 | 165 |
| 7443.0 | 164 |
| 7444.0 | 163 |
| 7445.0 | 162 |
| 7446.0 | 161 |
| 7447.0 | 160 |
| 7448.0 | 159 |
| 7449.0 | 160 |
| 7450.0 | 161 |
| 7451.0 | 162 |
| 7452.0 | 161 |
| 7453.0 | 162 |
| 7454.0 | 161 |
| 7455.0 | 162 |
| 7456.0 | 163 |
| 7457.0 | 164 |
| 7458.0 | 165 |
| 7459.0 | 164 |
| 7460.0 | 163 |
| 7461.0 | 162 |
| 7462.0 | 163 |
| 7463.0 | 164 |
| 7464.0 | 163 |
| 7465.0 | 162 |
| 7466.0 | 163 |
| 7467.0 | 164 |
| 7468.0 | 165 |
| 7469.0 | 164 |
| 7470.0 | 165 |
| 7471.0 | 164 |
| 7472.0 | 165 |
| 7473.0 | 164 |
| 7474.0 | 165 |
| 7475.0 | 164 |
| 7476.0 | 163 |
| 7477.0 | 164 |
| 7478.0 | 163 |
| 7479.0 | 162 |
| 7480.0 | 161 |
| 7481.0 | 162 |
| 7482.0 | 161 |
| 7483.0 | 162 |
| 7484.0 | 161 |
| 7485.0 | 162 |
| 7486.0 | 161 |
| 7487.0 | 162 |
| 7488.0 | 163 |
| 7489.0 | 162 |
| 7490.0 | 161 |
| 7491.0 | 162 |
| 7492.0 | 163 |
| 7493.0 | 164 |
| 7494.0 | 165 |
| 7495.0 | 164 |
| 7496.0 | 163 |
| 7497.0 | 162 |
| 7498.0 | 161 |
| 7499.0 | 160 |
| 7500.0 | 159 |
| 7501.0 | 158 |
| 7502.0 | 159 |
| 7503.0 | 160 |
| 7504.0 | 159 |
| 7505.0 | 158 |
| 7506.0 | 157 |
| 7507.0 | 158 |
| 7508.0 | 157 |
| 7509.0 | 156 |
| 7510.0 | 155 |
| 7511.0 | 156 |
| 7512.0 | 157 |
| 7513.0 | 158 |
| 7514.0 | 157 |
| 7515.0 | 158 |
| 7516.0 | 159 |
| 7517.0 | 158 |
| 7518.0 | 157 |
| 7519.0 | 158 |
| 7520.0 | 157 |
| 7521.0 | 158 |
| 7522.0 | 157 |
| 7523.0 | 156 |
| 7524.0 | 157 |
| 7525.0 | 156 |
| 7526.0 | 157 |
| 7527.0 | 156 |
| 7528.0 | 157 |
| 7529.0 | 158 |
| 7530.0 | 157 |
| 7531.0 | 156 |
| 7532.0 | 157 |
| 7533.0 | 158 |
| 7534.0 | 157 |
| 7535.0 | 158 |
| 7536.0 | 159 |
| 7537.0 | 160 |
| 7538.0 | 161 |
| 7539.0 | 162 |
| 7540.0 | 163 |
| 7541.0 | 164 |
| 7542.0 | 165 |
| 7543.0 | 166 |
| 7544.0 | 167 |
| 7545.0 | 168 |
| 7546.0 | 167 |
| 7547.0 | 168 |
| 7548.0 | 167 |
| 7549.0 | 166 |
| 7550.0 | 167 |
| 7551.0 | 168 |
| 7552.0 | 167 |
| 7553.0 | 168 |
| 7554.0 | 167 |
| 7555.0 | 166 |
| 7556.0 | 165 |
| 7557.0 | 164 |
| 7558.0 | 165 |
| 7559.0 | 166 |
| 7560.0 | 165 |
| 7561.0 | 164 |
| 7562.0 | 165 |
| 7563.0 | 164 |
| 7564.0 | 165 |
| 7565.0 | 164 |
| 7566.0 | 163 |
| 7567.0 | 162 |
| 7568.0 | 161 |
| 7569.0 | 160 |
| 7570.0 | 161 |
| 7571.0 | 160 |
| 7572.0 | 161 |
| 7573.0 | 160 |
| 7574.0 | 159 |
| 7575.0 | 160 |
| 7576.0 | 159 |
| 7577.0 | 160 |
| 7578.0 | 159 |
| 7579.0 | 158 |
| 7580.0 | 159 |
| 7581.0 | 158 |
| 7582.0 | 157 |
| 7583.0 | 158 |
| 7584.0 | 159 |
| 7585.0 | 158 |
| 7586.0 | 157 |
| 7587.0 | 156 |
| 7588.0 | 157 |
| 7589.0 | 158 |
| 7590.0 | 159 |
| 7591.0 | 160 |
| 7592.0 | 159 |
| 7593.0 | 160 |
| 7594.0 | 159 |
| 7595.0 | 160 |
| 7596.0 | 161 |
| 7597.0 | 162 |
| 7598.0 | 163 |
| 7599.0 | 162 |
| 7600.0 | 161 |
| 7601.0 | 162 |
| 7602.0 | 163 |
| 7603.0 | 162 |
| 7604.0 | 163 |
| 7605.0 | 162 |
| 7606.0 | 163 |
| 7607.0 | 162 |
| 7608.0 | 161 |
| 7609.0 | 160 |
| 7610.0 | 161 |
| 7611.0 | 162 |
| 7612.0 | 161 |
| 7613.0 | 160 |
| 7614.0 | 159 |
| 7615.0 | 160 |
| 7616.0 | 161 |
| 7617.0 | 162 |
| 7618.0 | 161 |
| 7619.0 | 160 |
| 7620.0 | 161 |
| 7621.0 | 162 |
| 7622.0 | 161 |
| 7623.0 | 160 |
| 7624.0 | 161 |
| 7625.0 | 162 |
| 7626.0 | 161 |
| 7627.0 | 162 |
| 7628.0 | 161 |
| 7629.0 | 160 |
| 7630.0 | 159 |
| 7631.0 | 160 |
| 7632.0 | 161 |
| 7633.0 | 162 |
| 7634.0 | 163 |
| 7635.0 | 162 |
| 7636.0 | 163 |
| 7637.0 | 164 |
| 7638.0 | 165 |
| 7639.0 | 166 |
| 7640.0 | 167 |
| 7641.0 | 168 |
| 7642.0 | 169 |
| 7643.0 | 170 |
| 7644.0 | 169 |
| 7645.0 | 168 |
| 7646.0 | 169 |
| 7647.0 | 170 |
| 7648.0 | 171 |
| 7649.0 | 172 |
| 7650.0 | 171 |
| 7651.0 | 170 |
| 7652.0 | 171 |
| 7653.0 | 172 |
| 7654.0 | 173 |
| 7655.0 | 174 |
| 7656.0 | 175 |
| 7657.0 | 174 |
| 7658.0 | 175 |
| 7659.0 | 176 |
| 7660.0 | 175 |
| 7661.0 | 176 |
| 7662.0 | 175 |
| 7663.0 | 176 |
| 7664.0 | 175 |
| 7665.0 | 174 |
| 7666.0 | 175 |
| 7667.0 | 176 |
| 7668.0 | 175 |
| 7669.0 | 174 |
| 7670.0 | 175 |
| 7671.0 | 174 |
| 7672.0 | 173 |
| 7673.0 | 172 |
| 7674.0 | 173 |
| 7675.0 | 174 |
| 7676.0 | 175 |
| 7677.0 | 174 |
| 7678.0 | 173 |
| 7679.0 | 174 |
| 7680.0 | 173 |
| 7681.0 | 172 |
| 7682.0 | 171 |
| 7683.0 | 172 |
| 7684.0 | 171 |
| 7685.0 | 172 |
| 7686.0 | 171 |
| 7687.0 | 170 |
| 7688.0 | 169 |
| 7689.0 | 170 |
| 7690.0 | 171 |
| 7691.0 | 172 |
| 7692.0 | 173 |
| 7693.0 | 172 |
| 7694.0 | 171 |
| 7695.0 | 170 |
| 7696.0 | 171 |
| 7697.0 | 170 |
| 7698.0 | 169 |
| 7699.0 | 170 |
| 7700.0 | 169 |
| 7701.0 | 170 |
| 7702.0 | 171 |
| 7703.0 | 170 |
| 7704.0 | 171 |
| 7705.0 | 170 |
| 7706.0 | 169 |
| 7707.0 | 170 |
| 7708.0 | 169 |
| 7709.0 | 170 |
| 7710.0 | 169 |
| 7711.0 | 170 |
| 7712.0 | 171 |
| 7713.0 | 172 |
| 7714.0 | 171 |
| 7715.0 | 170 |
| 7716.0 | 169 |
| 7717.0 | 168 |
| 7718.0 | 167 |
| 7719.0 | 166 |
| 7720.0 | 165 |
| 7721.0 | 164 |
| 7722.0 | 163 |
| 7723.0 | 164 |
| 7724.0 | 163 |
| 7725.0 | 164 |
| 7726.0 | 163 |
| 7727.0 | 164 |
| 7728.0 | 165 |
| 7729.0 | 164 |
| 7730.0 | 163 |
| 7731.0 | 164 |
| 7732.0 | 163 |
| 7733.0 | 162 |
| 7734.0 | 161 |
| 7735.0 | 160 |
| 7736.0 | 161 |
| 7737.0 | 160 |
| 7738.0 | 159 |
| 7739.0 | 158 |
| 7740.0 | 159 |
| 7741.0 | 160 |
| 7742.0 | 159 |
| 7743.0 | 158 |
| 7744.0 | 157 |
| 7745.0 | 156 |
| 7746.0 | 155 |
| 7747.0 | 156 |
| 7748.0 | 157 |
| 7749.0 | 156 |
| 7750.0 | 155 |
| 7751.0 | 156 |
| 7752.0 | 155 |
| 7753.0 | 156 |
| 7754.0 | 155 |
| 7755.0 | 154 |
| 7756.0 | 155 |
| 7757.0 | 156 |
| 7758.0 | 155 |
| 7759.0 | 154 |
| 7760.0 | 153 |
| 7761.0 | 154 |
| 7762.0 | 153 |
| 7763.0 | 152 |
| 7764.0 | 153 |
| 7765.0 | 152 |
| 7766.0 | 153 |
| 7767.0 | 152 |
| 7768.0 | 151 |
| 7769.0 | 150 |
| 7770.0 | 149 |
| 7771.0 | 148 |
| 7772.0 | 147 |
| 7773.0 | 148 |
| 7774.0 | 147 |
| 7775.0 | 148 |
| 7776.0 | 149 |
| 7777.0 | 148 |
| 7778.0 | 149 |
| 7779.0 | 148 |
| 7780.0 | 147 |
| 7781.0 | 146 |
| 7782.0 | 145 |
| 7783.0 | 146 |
| 7784.0 | 147 |
| 7785.0 | 146 |
| 7786.0 | 147 |
| 7787.0 | 148 |
| 7788.0 | 149 |
| 7789.0 | 148 |
| 7790.0 | 149 |
| 7791.0 | 148 |
| 7792.0 | 149 |
| 7793.0 | 150 |
| 7794.0 | 151 |
| 7795.0 | 150 |
| 7796.0 | 149 |
| 7797.0 | 150 |
| 7798.0 | 151 |
| 7799.0 | 150 |
| 7800.0 | 149 |
| 7801.0 | 150 |
| 7802.0 | 151 |
| 7803.0 | 150 |
| 7804.0 | 149 |
| 7805.0 | 148 |
| 7806.0 | 147 |
| 7807.0 | 148 |
| 7808.0 | 149 |
| 7809.0 | 150 |
| 7810.0 | 149 |
| 7811.0 | 150 |
| 7812.0 | 149 |
| 7813.0 | 150 |
| 7814.0 | 149 |
| 7815.0 | 150 |
| 7816.0 | 149 |
| 7817.0 | 148 |
| 7818.0 | 149 |
| 7819.0 | 150 |
| 7820.0 | 151 |
| 7821.0 | 152 |
| 7822.0 | 153 |
| 7823.0 | 152 |
| 7824.0 | 151 |
| 7825.0 | 150 |
| 7826.0 | 151 |
| 7827.0 | 152 |
| 7828.0 | 151 |
| 7829.0 | 150 |
| 7830.0 | 151 |
| 7831.0 | 152 |
| 7832.0 | 151 |
| 7833.0 | 152 |
| 7834.0 | 151 |
| 7835.0 | 152 |
| 7836.0 | 151 |
| 7837.0 | 152 |
| 7838.0 | 153 |
| 7839.0 | 154 |
| 7840.0 | 153 |
| 7841.0 | 154 |
| 7842.0 | 155 |
| 7843.0 | 156 |
| 7844.0 | 157 |
| 7845.0 | 158 |
| 7846.0 | 159 |
| 7847.0 | 158 |
| 7848.0 | 157 |
| 7849.0 | 156 |
| 7850.0 | 155 |
| 7851.0 | 156 |
| 7852.0 | 155 |
| 7853.0 | 156 |
| 7854.0 | 155 |
| 7855.0 | 156 |
| 7856.0 | 155 |
| 7857.0 | 154 |
| 7858.0 | 155 |
| 7859.0 | 154 |
| 7860.0 | 155 |
| 7861.0 | 154 |
| 7862.0 | 155 |
| 7863.0 | 156 |
| 7864.0 | 155 |
| 7865.0 | 154 |
| 7866.0 | 155 |
| 7867.0 | 156 |
| 7868.0 | 157 |
| 7869.0 | 156 |
| 7870.0 | 157 |
| 7871.0 | 158 |
| 7872.0 | 159 |
| 7873.0 | 158 |
| 7874.0 | 157 |
| 7875.0 | 156 |
| 7876.0 | 157 |
| 7877.0 | 156 |
| 7878.0 | 155 |
| 7879.0 | 154 |
| 7880.0 | 153 |
| 7881.0 | 152 |
| 7882.0 | 151 |
| 7883.0 | 150 |
| 7884.0 | 151 |
| 7885.0 | 152 |
| 7886.0 | 153 |
| 7887.0 | 154 |
| 7888.0 | 155 |
| 7889.0 | 154 |
| 7890.0 | 153 |
| 7891.0 | 152 |
| 7892.0 | 151 |
| 7893.0 | 152 |
| 7894.0 | 153 |
| 7895.0 | 152 |
| 7896.0 | 151 |
| 7897.0 | 152 |
| 7898.0 | 151 |
| 7899.0 | 150 |
| 7900.0 | 149 |
| 7901.0 | 148 |
| 7902.0 | 149 |
| 7903.0 | 150 |
| 7904.0 | 149 |
| 7905.0 | 150 |
| 7906.0 | 151 |
| 7907.0 | 152 |
| 7908.0 | 151 |
| 7909.0 | 150 |
| 7910.0 | 151 |
| 7911.0 | 150 |
| 7912.0 | 151 |
| 7913.0 | 152 |
| 7914.0 | 153 |
| 7915.0 | 152 |
| 7916.0 | 153 |
| 7917.0 | 154 |
| 7918.0 | 155 |
| 7919.0 | 156 |
| 7920.0 | 155 |
| 7921.0 | 156 |
| 7922.0 | 157 |
| 7923.0 | 156 |
| 7924.0 | 155 |
| 7925.0 | 156 |
| 7926.0 | 155 |
| 7927.0 | 154 |
| 7928.0 | 153 |
| 7929.0 | 152 |
| 7930.0 | 151 |
| 7931.0 | 150 |
| 7932.0 | 151 |
| 7933.0 | 150 |
| 7934.0 | 151 |
| 7935.0 | 150 |
| 7936.0 | 151 |
| 7937.0 | 150 |
| 7938.0 | 149 |
| 7939.0 | 150 |
| 7940.0 | 149 |
| 7941.0 | 148 |
| 7942.0 | 149 |
| 7943.0 | 150 |
| 7944.0 | 149 |
| 7945.0 | 150 |
| 7946.0 | 149 |
| 7947.0 | 150 |
| 7948.0 | 149 |
| 7949.0 | 148 |
| 7950.0 | 147 |
| 7951.0 | 148 |
| 7952.0 | 149 |
| 7953.0 | 148 |
| 7954.0 | 149 |
| 7955.0 | 150 |
| 7956.0 | 149 |
| 7957.0 | 148 |
| 7958.0 | 149 |
| 7959.0 | 148 |
| 7960.0 | 147 |
| 7961.0 | 146 |
| 7962.0 | 147 |
| 7963.0 | 146 |
| 7964.0 | 147 |
| 7965.0 | 148 |
| 7966.0 | 147 |
| 7967.0 | 148 |
| 7968.0 | 147 |
| 7969.0 | 146 |
| 7970.0 | 145 |
| 7971.0 | 146 |
| 7972.0 | 145 |
| 7973.0 | 144 |
| 7974.0 | 145 |
| 7975.0 | 144 |
| 7976.0 | 143 |
| 7977.0 | 144 |
| 7978.0 | 143 |
| 7979.0 | 142 |
| 7980.0 | 141 |
| 7981.0 | 140 |
| 7982.0 | 141 |
| 7983.0 | 142 |
| 7984.0 | 141 |
| 7985.0 | 142 |
| 7986.0 | 141 |
| 7987.0 | 140 |
| 7988.0 | 141 |
| 7989.0 | 142 |
| 7990.0 | 141 |
| 7991.0 | 140 |
| 7992.0 | 139 |
| 7993.0 | 140 |
| 7994.0 | 141 |
| 7995.0 | 140 |
| 7996.0 | 141 |
| 7997.0 | 142 |
| 7998.0 | 143 |
| 7999.0 | 144 |
| 8000.0 | 143 |
| 8001.0 | 142 |
| 8002.0 | 143 |
| 8003.0 | 142 |
| 8004.0 | 141 |
| 8005.0 | 140 |
| 8006.0 | 141 |
| 8007.0 | 140 |
| 8008.0 | 139 |
| 8009.0 | 138 |
| 8010.0 | 137 |
| 8011.0 | 136 |
| 8012.0 | 135 |
| 8013.0 | 134 |
| 8014.0 | 133 |
| 8015.0 | 134 |
| 8016.0 | 135 |
| 8017.0 | 134 |
| 8018.0 | 135 |
| 8019.0 | 136 |
| 8020.0 | 135 |
| 8021.0 | 134 |
| 8022.0 | 135 |
| 8023.0 | 134 |
| 8024.0 | 135 |
| 8025.0 | 136 |
| 8026.0 | 135 |
| 8027.0 | 136 |
| 8028.0 | 135 |
| 8029.0 | 134 |
| 8030.0 | 133 |
| 8031.0 | 134 |
| 8032.0 | 133 |
| 8033.0 | 132 |
| 8034.0 | 133 |
| 8035.0 | 132 |
| 8036.0 | 131 |
| 8037.0 | 130 |
| 8038.0 | 131 |
| 8039.0 | 130 |
| 8040.0 | 131 |
| 8041.0 | 130 |
| 8042.0 | 131 |
| 8043.0 | 130 |
| 8044.0 | 131 |
| 8045.0 | 130 |
| 8046.0 | 129 |
| 8047.0 | 130 |
| 8048.0 | 131 |
| 8049.0 | 132 |
| 8050.0 | 133 |
| 8051.0 | 132 |
| 8052.0 | 133 |
| 8053.0 | 132 |
| 8054.0 | 133 |
| 8055.0 | 132 |
| 8056.0 | 131 |
| 8057.0 | 130 |
| 8058.0 | 129 |
| 8059.0 | 128 |
| 8060.0 | 129 |
| 8061.0 | 128 |
| 8062.0 | 127 |
| 8063.0 | 126 |
| 8064.0 | 127 |
| 8065.0 | 128 |
| 8066.0 | 129 |
| 8067.0 | 128 |
| 8068.0 | 127 |
| 8069.0 | 126 |
| 8070.0 | 125 |
| 8071.0 | 124 |
| 8072.0 | 125 |
| 8073.0 | 124 |
| 8074.0 | 123 |
| 8075.0 | 122 |
| 8076.0 | 123 |
| 8077.0 | 122 |
| 8078.0 | 121 |
| 8079.0 | 120 |
| 8080.0 | 121 |
| 8081.0 | 120 |
| 8082.0 | 119 |
| 8083.0 | 118 |
| 8084.0 | 117 |
| 8085.0 | 116 |
| 8086.0 | 117 |
| 8087.0 | 116 |
| 8088.0 | 117 |
| 8089.0 | 116 |
| 8090.0 | 117 |
| 8091.0 | 118 |
| 8092.0 | 119 |
| 8093.0 | 120 |
| 8094.0 | 119 |
| 8095.0 | 118 |
| 8096.0 | 117 |
| 8097.0 | 116 |
| 8098.0 | 117 |
| 8099.0 | 118 |
| 8100.0 | 119 |
| 8101.0 | 118 |
| 8102.0 | 117 |
| 8103.0 | 118 |
| 8104.0 | 117 |
| 8105.0 | 118 |
| 8106.0 | 117 |
| 8107.0 | 118 |
| 8108.0 | 117 |
| 8109.0 | 118 |
| 8110.0 | 119 |
| 8111.0 | 118 |
| 8112.0 | 119 |
| 8113.0 | 120 |
| 8114.0 | 119 |
| 8115.0 | 118 |
| 8116.0 | 117 |
| 8117.0 | 116 |
| 8118.0 | 115 |
| 8119.0 | 114 |
| 8120.0 | 113 |
| 8121.0 | 112 |
| 8122.0 | 113 |
| 8123.0 | 114 |
| 8124.0 | 113 |
| 8125.0 | 114 |
| 8126.0 | 115 |
| 8127.0 | 114 |
| 8128.0 | 113 |
| 8129.0 | 114 |
| 8130.0 | 113 |
| 8131.0 | 112 |
| 8132.0 | 111 |
| 8133.0 | 112 |
| 8134.0 | 113 |
| 8135.0 | 114 |
| 8136.0 | 113 |
| 8137.0 | 112 |
| 8138.0 | 111 |
| 8139.0 | 110 |
| 8140.0 | 111 |
| 8141.0 | 112 |
| 8142.0 | 111 |
| 8143.0 | 112 |
| 8144.0 | 111 |
| 8145.0 | 110 |
| 8146.0 | 111 |
| 8147.0 | 112 |
| 8148.0 | 111 |
| 8149.0 | 110 |
| 8150.0 | 109 |
| 8151.0 | 108 |
| 8152.0 | 109 |
| 8153.0 | 108 |
| 8154.0 | 107 |
| 8155.0 | 108 |
| 8156.0 | 107 |
| 8157.0 | 108 |
| 8158.0 | 107 |
| 8159.0 | 106 |
| 8160.0 | 107 |
| 8161.0 | 108 |
| 8162.0 | 107 |
| 8163.0 | 108 |
| 8164.0 | 109 |
| 8165.0 | 108 |
| 8166.0 | 109 |
| 8167.0 | 108 |
| 8168.0 | 109 |
| 8169.0 | 108 |
| 8170.0 | 109 |
| 8171.0 | 110 |
| 8172.0 | 111 |
| 8173.0 | 112 |
| 8174.0 | 111 |
| 8175.0 | 110 |
| 8176.0 | 111 |
| 8177.0 | 112 |
| 8178.0 | 113 |
| 8179.0 | 114 |
| 8180.0 | 115 |
| 8181.0 | 116 |
| 8182.0 | 115 |
| 8183.0 | 116 |
| 8184.0 | 115 |
| 8185.0 | 114 |
| 8186.0 | 115 |
| 8187.0 | 116 |
| 8188.0 | 115 |
| 8189.0 | 114 |
| 8190.0 | 115 |
| 8191.0 | 116 |
| 8192.0 | 117 |
| 8193.0 | 116 |
| 8194.0 | 115 |
| 8195.0 | 114 |
| 8196.0 | 113 |
| 8197.0 | 112 |
| 8198.0 | 113 |
| 8199.0 | 112 |
| 8200.0 | 113 |
| 8201.0 | 114 |
| 8202.0 | 113 |
| 8203.0 | 112 |
| 8204.0 | 111 |
| 8205.0 | 112 |
| 8206.0 | 111 |
| 8207.0 | 110 |
| 8208.0 | 109 |
| 8209.0 | 110 |
| 8210.0 | 111 |
| 8211.0 | 112 |
| 8212.0 | 111 |
| 8213.0 | 112 |
| 8214.0 | 113 |
| 8215.0 | 112 |
| 8216.0 | 113 |
| 8217.0 | 112 |
| 8218.0 | 111 |
| 8219.0 | 112 |
| 8220.0 | 111 |
| 8221.0 | 110 |
| 8222.0 | 111 |
| 8223.0 | 112 |
| 8224.0 | 111 |
| 8225.0 | 112 |
| 8226.0 | 113 |
| 8227.0 | 112 |
| 8228.0 | 113 |
| 8229.0 | 112 |
| 8230.0 | 113 |
| 8231.0 | 114 |
| 8232.0 | 113 |
| 8233.0 | 112 |
| 8234.0 | 113 |
| 8235.0 | 112 |
| 8236.0 | 113 |
| 8237.0 | 114 |
| 8238.0 | 113 |
| 8239.0 | 114 |
| 8240.0 | 115 |
| 8241.0 | 114 |
| 8242.0 | 115 |
| 8243.0 | 114 |
| 8244.0 | 115 |
| 8245.0 | 114 |
| 8246.0 | 113 |
| 8247.0 | 112 |
| 8248.0 | 113 |
| 8249.0 | 114 |
| 8250.0 | 115 |
| 8251.0 | 114 |
| 8252.0 | 113 |
| 8253.0 | 114 |
| 8254.0 | 113 |
| 8255.0 | 112 |
| 8256.0 | 111 |
| 8257.0 | 112 |
| 8258.0 | 113 |
| 8259.0 | 114 |
| 8260.0 | 115 |
| 8261.0 | 116 |
| 8262.0 | 117 |
| 8263.0 | 118 |
| 8264.0 | 117 |
| 8265.0 | 118 |
| 8266.0 | 117 |
| 8267.0 | 118 |
| 8268.0 | 119 |
| 8269.0 | 118 |
| 8270.0 | 119 |
| 8271.0 | 118 |
| 8272.0 | 119 |
| 8273.0 | 118 |
| 8274.0 | 117 |
| 8275.0 | 118 |
| 8276.0 | 119 |
| 8277.0 | 120 |
| 8278.0 | 121 |
| 8279.0 | 122 |
| 8280.0 | 123 |
| 8281.0 | 122 |
| 8282.0 | 123 |
| 8283.0 | 122 |
| 8284.0 | 123 |
| 8285.0 | 122 |
| 8286.0 | 123 |
| 8287.0 | 122 |
| 8288.0 | 123 |
| 8289.0 | 122 |
| 8290.0 | 121 |
| 8291.0 | 120 |
| 8292.0 | 121 |
| 8293.0 | 122 |
| 8294.0 | 123 |
| 8295.0 | 124 |
| 8296.0 | 125 |
| 8297.0 | 124 |
| 8298.0 | 125 |
| 8299.0 | 124 |
| 8300.0 | 125 |
| 8301.0 | 124 |
| 8302.0 | 123 |
| 8303.0 | 122 |
| 8304.0 | 121 |
| 8305.0 | 120 |
| 8306.0 | 121 |
| 8307.0 | 122 |
| 8308.0 | 123 |
| 8309.0 | 122 |
| 8310.0 | 121 |
| 8311.0 | 120 |
| 8312.0 | 119 |
| 8313.0 | 120 |
| 8314.0 | 121 |
| 8315.0 | 122 |
| 8316.0 | 123 |
| 8317.0 | 122 |
| 8318.0 | 123 |
| 8319.0 | 124 |
| 8320.0 | 125 |
| 8321.0 | 124 |
| 8322.0 | 123 |
| 8323.0 | 124 |
| 8324.0 | 125 |
| 8325.0 | 124 |
| 8326.0 | 123 |
| 8327.0 | 122 |
| 8328.0 | 123 |
| 8329.0 | 122 |
| 8330.0 | 121 |
| 8331.0 | 120 |
| 8332.0 | 119 |
| 8333.0 | 118 |
| 8334.0 | 117 |
| 8335.0 | 118 |
| 8336.0 | 119 |
| 8337.0 | 120 |
| 8338.0 | 121 |
| 8339.0 | 122 |
| 8340.0 | 123 |
| 8341.0 | 122 |
| 8342.0 | 121 |
| 8343.0 | 122 |
| 8344.0 | 121 |
| 8345.0 | 120 |
| 8346.0 | 121 |
| 8347.0 | 122 |
| 8348.0 | 123 |
| 8349.0 | 124 |
| 8350.0 | 125 |
| 8351.0 | 126 |
| 8352.0 | 127 |
| 8353.0 | 126 |
| 8354.0 | 127 |
| 8355.0 | 128 |
| 8356.0 | 127 |
| 8357.0 | 128 |
| 8358.0 | 129 |
| 8359.0 | 130 |
| 8360.0 | 129 |
| 8361.0 | 128 |
| 8362.0 | 127 |
| 8363.0 | 126 |
| 8364.0 | 127 |
| 8365.0 | 126 |
| 8366.0 | 125 |
| 8367.0 | 126 |
| 8368.0 | 127 |
| 8369.0 | 126 |
| 8370.0 | 125 |
| 8371.0 | 124 |
| 8372.0 | 125 |
| 8373.0 | 124 |
| 8374.0 | 123 |
| 8375.0 | 124 |
| 8376.0 | 123 |
| 8377.0 | 122 |
| 8378.0 | 123 |
| 8379.0 | 124 |
| 8380.0 | 123 |
| 8381.0 | 122 |
| 8382.0 | 121 |
| 8383.0 | 120 |
| 8384.0 | 121 |
| 8385.0 | 120 |
| 8386.0 | 119 |
| 8387.0 | 120 |
| 8388.0 | 121 |
| 8389.0 | 122 |
| 8390.0 | 123 |
| 8391.0 | 124 |
| 8392.0 | 125 |
| 8393.0 | 124 |
| 8394.0 | 123 |
| 8395.0 | 124 |
| 8396.0 | 125 |
| 8397.0 | 124 |
| 8398.0 | 123 |
| 8399.0 | 122 |
| 8400.0 | 123 |
| 8401.0 | 122 |
| 8402.0 | 121 |
| 8403.0 | 120 |
| 8404.0 | 119 |
| 8405.0 | 118 |
| 8406.0 | 119 |
| 8407.0 | 120 |
| 8408.0 | 121 |
| 8409.0 | 120 |
| 8410.0 | 119 |
| 8411.0 | 118 |
| 8412.0 | 117 |
| 8413.0 | 116 |
| 8414.0 | 117 |
| 8415.0 | 116 |
| 8416.0 | 115 |
| 8417.0 | 114 |
| 8418.0 | 113 |
| 8419.0 | 112 |
| 8420.0 | 111 |
| 8421.0 | 112 |
| 8422.0 | 111 |
| 8423.0 | 110 |
| 8424.0 | 109 |
| 8425.0 | 108 |
| 8426.0 | 109 |
| 8427.0 | 110 |
| 8428.0 | 109 |
| 8429.0 | 108 |
| 8430.0 | 109 |
| 8431.0 | 108 |
| 8432.0 | 107 |
| 8433.0 | 108 |
| 8434.0 | 109 |
| 8435.0 | 110 |
| 8436.0 | 109 |
| 8437.0 | 108 |
| 8438.0 | 109 |
| 8439.0 | 108 |
| 8440.0 | 109 |
| 8441.0 | 108 |
| 8442.0 | 109 |
| 8443.0 | 108 |
| 8444.0 | 109 |
| 8445.0 | 108 |
| 8446.0 | 109 |
| 8447.0 | 110 |
| 8448.0 | 109 |
| 8449.0 | 110 |
| 8450.0 | 109 |
| 8451.0 | 108 |
| 8452.0 | 107 |
| 8453.0 | 108 |
| 8454.0 | 109 |
| 8455.0 | 108 |
| 8456.0 | 109 |
| 8457.0 | 108 |
| 8458.0 | 109 |
| 8459.0 | 110 |
| 8460.0 | 109 |
| 8461.0 | 110 |
| 8462.0 | 109 |
| 8463.0 | 110 |
| 8464.0 | 111 |
| 8465.0 | 110 |
| 8466.0 | 111 |
| 8467.0 | 110 |
| 8468.0 | 111 |
| 8469.0 | 110 |
| 8470.0 | 109 |
| 8471.0 | 108 |
| 8472.0 | 109 |
| 8473.0 | 108 |
| 8474.0 | 107 |
| 8475.0 | 108 |
| 8476.0 | 109 |
| 8477.0 | 110 |
| 8478.0 | 109 |
| 8479.0 | 108 |
| 8480.0 | 107 |
| 8481.0 | 106 |
| 8482.0 | 105 |
| 8483.0 | 104 |
| 8484.0 | 103 |
| 8485.0 | 102 |
| 8486.0 | 101 |
| 8487.0 | 102 |
| 8488.0 | 103 |
| 8489.0 | 102 |
| 8490.0 | 103 |
| 8491.0 | 102 |
| 8492.0 | 103 |
| 8493.0 | 104 |
| 8494.0 | 105 |
| 8495.0 | 106 |
| 8496.0 | 105 |
| 8497.0 | 106 |
| 8498.0 | 105 |
| 8499.0 | 104 |
| 8500.0 | 105 |
| 8501.0 | 106 |
| 8502.0 | 105 |
| 8503.0 | 106 |
| 8504.0 | 105 |
| 8505.0 | 104 |
| 8506.0 | 105 |
| 8507.0 | 104 |
| 8508.0 | 105 |
| 8509.0 | 106 |
| 8510.0 | 105 |
| 8511.0 | 104 |
| 8512.0 | 105 |
| 8513.0 | 106 |
| 8514.0 | 105 |
| 8515.0 | 104 |
| 8516.0 | 103 |
| 8517.0 | 104 |
| 8518.0 | 103 |
| 8519.0 | 102 |
| 8520.0 | 101 |
| 8521.0 | 100 |
| 8522.0 | 99 |
| 8523.0 | 100 |
| 8524.0 | 99 |
| 8525.0 | 100 |
| 8526.0 | 101 |
| 8527.0 | 102 |
| 8528.0 | 101 |
| 8529.0 | 100 |
| 8530.0 | 101 |
| 8531.0 | 102 |
| 8532.0 | 101 |
| 8533.0 | 102 |
| 8534.0 | 101 |
| 8535.0 | 100 |
| 8536.0 | 101 |
| 8537.0 | 100 |
| 8538.0 | 101 |
| 8539.0 | 100 |
| 8540.0 | 99 |
| 8541.0 | 100 |
| 8542.0 | 99 |
| 8543.0 | 100 |
| 8544.0 | 99 |
| 8545.0 | 100 |
| 8546.0 | 101 |
| 8547.0 | 102 |
| 8548.0 | 101 |
| 8549.0 | 102 |
| 8550.0 | 101 |
| 8551.0 | 102 |
| 8552.0 | 103 |
| 8553.0 | 102 |
| 8554.0 | 101 |
| 8555.0 | 102 |
| 8556.0 | 101 |
| 8557.0 | 100 |
| 8558.0 | 101 |
| 8559.0 | 100 |
| 8560.0 | 101 |
| 8561.0 | 100 |
| 8562.0 | 99 |
| 8563.0 | 98 |
| 8564.0 | 97 |
| 8565.0 | 98 |
| 8566.0 | 99 |
| 8567.0 | 100 |
| 8568.0 | 101 |
| 8569.0 | 102 |
| 8570.0 | 101 |
| 8571.0 | 102 |
| 8572.0 | 101 |
| 8573.0 | 102 |
| 8574.0 | 103 |
| 8575.0 | 104 |
| 8576.0 | 103 |
| 8577.0 | 104 |
| 8578.0 | 105 |
| 8579.0 | 104 |
| 8580.0 | 103 |
| 8581.0 | 102 |
| 8582.0 | 103 |
| 8583.0 | 102 |
| 8584.0 | 101 |
| 8585.0 | 102 |
| 8586.0 | 103 |
| 8587.0 | 102 |
| 8588.0 | 101 |
| 8589.0 | 102 |
| 8590.0 | 103 |
| 8591.0 | 104 |
| 8592.0 | 103 |
| 8593.0 | 104 |
| 8594.0 | 105 |
| 8595.0 | 104 |
| 8596.0 | 105 |
| 8597.0 | 106 |
| 8598.0 | 105 |
| 8599.0 | 106 |
| 8600.0 | 105 |
| 8601.0 | 106 |
| 8602.0 | 105 |
| 8603.0 | 104 |
| 8604.0 | 105 |
| 8605.0 | 104 |
| 8606.0 | 103 |
| 8607.0 | 104 |
| 8608.0 | 103 |
| 8609.0 | 104 |
| 8610.0 | 103 |
| 8611.0 | 102 |
| 8612.0 | 103 |
| 8613.0 | 102 |
| 8614.0 | 101 |
| 8615.0 | 100 |
| 8616.0 | 101 |
| 8617.0 | 102 |
| 8618.0 | 103 |
| 8619.0 | 102 |
| 8620.0 | 103 |
| 8621.0 | 104 |
| 8622.0 | 103 |
| 8623.0 | 104 |
| 8624.0 | 103 |
| 8625.0 | 104 |
| 8626.0 | 105 |
| 8627.0 | 106 |
| 8628.0 | 105 |
| 8629.0 | 106 |
| 8630.0 | 105 |
| 8631.0 | 106 |
| 8632.0 | 105 |
| 8633.0 | 106 |
| 8634.0 | 107 |
| 8635.0 | 106 |
| 8636.0 | 105 |
| 8637.0 | 106 |
| 8638.0 | 105 |
| 8639.0 | 106 |
| 8640.0 | 105 |
| 8641.0 | 104 |
| 8642.0 | 105 |
| 8643.0 | 106 |
| 8644.0 | 107 |
| 8645.0 | 108 |
| 8646.0 | 107 |
| 8647.0 | 106 |
| 8648.0 | 105 |
| 8649.0 | 104 |
| 8650.0 | 105 |
| 8651.0 | 106 |
| 8652.0 | 107 |
| 8653.0 | 108 |
| 8654.0 | 109 |
| 8655.0 | 108 |
| 8656.0 | 109 |
| 8657.0 | 108 |
| 8658.0 | 109 |
| 8659.0 | 110 |
| 8660.0 | 109 |
| 8661.0 | 110 |
| 8662.0 | 109 |
| 8663.0 | 110 |
| 8664.0 | 111 |
| 8665.0 | 112 |
| 8666.0 | 111 |
| 8667.0 | 112 |
| 8668.0 | 113 |
| 8669.0 | 114 |
| 8670.0 | 113 |
| 8671.0 | 112 |
| 8672.0 | 111 |
| 8673.0 | 110 |
| 8674.0 | 109 |
| 8675.0 | 108 |
| 8676.0 | 107 |
| 8677.0 | 108 |
| 8678.0 | 107 |
| 8679.0 | 108 |
| 8680.0 | 109 |
| 8681.0 | 108 |
| 8682.0 | 107 |
| 8683.0 | 108 |
| 8684.0 | 109 |
| 8685.0 | 108 |
| 8686.0 | 109 |
| 8687.0 | 110 |
| 8688.0 | 109 |
| 8689.0 | 110 |
| 8690.0 | 109 |
| 8691.0 | 110 |
| 8692.0 | 109 |
| 8693.0 | 110 |
| 8694.0 | 111 |
| 8695.0 | 112 |
| 8696.0 | 111 |
| 8697.0 | 112 |
| 8698.0 | 111 |
| 8699.0 | 112 |
| 8700.0 | 111 |
| 8701.0 | 110 |
| 8702.0 | 111 |
| 8703.0 | 112 |
| 8704.0 | 111 |
| 8705.0 | 112 |
| 8706.0 | 113 |
| 8707.0 | 114 |
| 8708.0 | 115 |
| 8709.0 | 116 |
| 8710.0 | 117 |
| 8711.0 | 116 |
| 8712.0 | 115 |
| 8713.0 | 116 |
| 8714.0 | 115 |
| 8715.0 | 114 |
| 8716.0 | 115 |
| 8717.0 | 114 |
| 8718.0 | 113 |
| 8719.0 | 114 |
| 8720.0 | 115 |
| 8721.0 | 114 |
| 8722.0 | 113 |
| 8723.0 | 112 |
| 8724.0 | 113 |
| 8725.0 | 114 |
| 8726.0 | 115 |
| 8727.0 | 116 |
| 8728.0 | 115 |
| 8729.0 | 114 |
| 8730.0 | 113 |
| 8731.0 | 112 |
| 8732.0 | 113 |
| 8733.0 | 112 |
| 8734.0 | 113 |
| 8735.0 | 114 |
| 8736.0 | 115 |
| 8737.0 | 116 |
| 8738.0 | 117 |
| 8739.0 | 118 |
| 8740.0 | 117 |
| 8741.0 | 116 |
| 8742.0 | 117 |
| 8743.0 | 118 |
| 8744.0 | 117 |
| 8745.0 | 116 |
| 8746.0 | 117 |
| 8747.0 | 116 |
| 8748.0 | 117 |
| 8749.0 | 118 |
| 8750.0 | 117 |
| 8751.0 | 118 |
| 8752.0 | 117 |
| 8753.0 | 116 |
| 8754.0 | 117 |
| 8755.0 | 116 |
| 8756.0 | 115 |
| 8757.0 | 114 |
| 8758.0 | 113 |
| 8759.0 | 112 |
| 8760.0 | 113 |
| 8761.0 | 112 |
| 8762.0 | 111 |
| 8763.0 | 110 |
| 8764.0 | 111 |
| 8765.0 | 110 |
| 8766.0 | 109 |
| 8767.0 | 110 |
| 8768.0 | 109 |
| 8769.0 | 108 |
| 8770.0 | 109 |
| 8771.0 | 110 |
| 8772.0 | 109 |
| 8773.0 | 108 |
| 8774.0 | 107 |
| 8775.0 | 106 |
| 8776.0 | 107 |
| 8777.0 | 106 |
| 8778.0 | 107 |
| 8779.0 | 106 |
| 8780.0 | 107 |
| 8781.0 | 108 |
| 8782.0 | 109 |
| 8783.0 | 108 |
| 8784.0 | 109 |
| 8785.0 | 110 |
| 8786.0 | 111 |
| 8787.0 | 110 |
| 8788.0 | 109 |
| 8789.0 | 108 |
| 8790.0 | 107 |
| 8791.0 | 106 |
| 8792.0 | 105 |
| 8793.0 | 104 |
| 8794.0 | 103 |
| 8795.0 | 102 |
| 8796.0 | 101 |
| 8797.0 | 100 |
| 8798.0 | 101 |
| 8799.0 | 102 |
| 8800.0 | 101 |
| 8801.0 | 100 |
| 8802.0 | 101 |
| 8803.0 | 100 |
| 8804.0 | 99 |
| 8805.0 | 100 |
| 8806.0 | 99 |
| 8807.0 | 100 |
| 8808.0 | 99 |
| 8809.0 | 100 |
| 8810.0 | 99 |
| 8811.0 | 100 |
| 8812.0 | 99 |
| 8813.0 | 98 |
| 8814.0 | 97 |
| 8815.0 | 96 |
| 8816.0 | 95 |
| 8817.0 | 96 |
| 8818.0 | 95 |
| 8819.0 | 94 |
| 8820.0 | 95 |
| 8821.0 | 96 |
| 8822.0 | 95 |
| 8823.0 | 94 |
| 8824.0 | 95 |
| 8825.0 | 96 |
| 8826.0 | 95 |
| 8827.0 | 96 |
| 8828.0 | 95 |
| 8829.0 | 96 |
| 8830.0 | 97 |
| 8831.0 | 98 |
| 8832.0 | 99 |
| 8833.0 | 100 |
| 8834.0 | 101 |
| 8835.0 | 102 |
| 8836.0 | 103 |
| 8837.0 | 102 |
| 8838.0 | 101 |
| 8839.0 | 102 |
| 8840.0 | 101 |
| 8841.0 | 100 |
| 8842.0 | 101 |
| 8843.0 | 100 |
| 8844.0 | 101 |
| 8845.0 | 100 |
| 8846.0 | 99 |
| 8847.0 | 100 |
| 8848.0 | 101 |
| 8849.0 | 102 |
| 8850.0 | 103 |
| 8851.0 | 102 |
| 8852.0 | 103 |
| 8853.0 | 102 |
| 8854.0 | 101 |
| 8855.0 | 100 |
| 8856.0 | 101 |
| 8857.0 | 100 |
| 8858.0 | 101 |
| 8859.0 | 100 |
| 8860.0 | 101 |
| 8861.0 | 102 |
| 8862.0 | 103 |
| 8863.0 | 104 |
| 8864.0 | 105 |
| 8865.0 | 106 |
| 8866.0 | 107 |
| 8867.0 | 108 |
| 8868.0 | 109 |
| 8869.0 | 108 |
| 8870.0 | 109 |
| 8871.0 | 110 |
| 8872.0 | 111 |
| 8873.0 | 112 |
| 8874.0 | 111 |
| 8875.0 | 112 |
| 8876.0 | 111 |
| 8877.0 | 112 |
| 8878.0 | 111 |
| 8879.0 | 110 |
| 8880.0 | 109 |
| 8881.0 | 110 |
| 8882.0 | 111 |
| 8883.0 | 112 |
| 8884.0 | 111 |
| 8885.0 | 112 |
| 8886.0 | 113 |
| 8887.0 | 114 |
| 8888.0 | 115 |
| 8889.0 | 114 |
| 8890.0 | 115 |
| 8891.0 | 114 |
| 8892.0 | 113 |
| 8893.0 | 114 |
| 8894.0 | 115 |
| 8895.0 | 116 |
| 8896.0 | 115 |
| 8897.0 | 116 |
| 8898.0 | 115 |
| 8899.0 | 114 |
| 8900.0 | 115 |
| 8901.0 | 114 |
| 8902.0 | 115 |
| 8903.0 | 114 |
| 8904.0 | 115 |
| 8905.0 | 116 |
| 8906.0 | 117 |
| 8907.0 | 118 |
| 8908.0 | 117 |
| 8909.0 | 116 |
| 8910.0 | 115 |
| 8911.0 | 114 |
| 8912.0 | 113 |
| 8913.0 | 114 |
| 8914.0 | 113 |
| 8915.0 | 112 |
| 8916.0 | 111 |
| 8917.0 | 110 |
| 8918.0 | 109 |
| 8919.0 | 110 |
| 8920.0 | 109 |
| 8921.0 | 108 |
| 8922.0 | 109 |
| 8923.0 | 110 |
| 8924.0 | 109 |
| 8925.0 | 108 |
| 8926.0 | 109 |
| 8927.0 | 110 |
| 8928.0 | 111 |
| 8929.0 | 112 |
| 8930.0 | 111 |
| 8931.0 | 112 |
| 8932.0 | 111 |
| 8933.0 | 112 |
| 8934.0 | 113 |
| 8935.0 | 112 |
| 8936.0 | 111 |
| 8937.0 | 110 |
| 8938.0 | 109 |
| 8939.0 | 108 |
| 8940.0 | 107 |
| 8941.0 | 108 |
| 8942.0 | 109 |
| 8943.0 | 110 |
| 8944.0 | 109 |
| 8945.0 | 110 |
| 8946.0 | 109 |
| 8947.0 | 110 |
| 8948.0 | 111 |
| 8949.0 | 112 |
| 8950.0 | 113 |
| 8951.0 | 114 |
| 8952.0 | 113 |
| 8953.0 | 114 |
| 8954.0 | 113 |
| 8955.0 | 114 |
| 8956.0 | 113 |
| 8957.0 | 114 |
| 8958.0 | 113 |
| 8959.0 | 114 |
| 8960.0 | 115 |
| 8961.0 | 116 |
| 8962.0 | 117 |
| 8963.0 | 116 |
| 8964.0 | 117 |
| 8965.0 | 116 |
| 8966.0 | 117 |
| 8967.0 | 116 |
| 8968.0 | 117 |
| 8969.0 | 118 |
| 8970.0 | 119 |
| 8971.0 | 118 |
| 8972.0 | 119 |
| 8973.0 | 120 |
| 8974.0 | 121 |
| 8975.0 | 120 |
| 8976.0 | 119 |
| 8977.0 | 120 |
| 8978.0 | 119 |
| 8979.0 | 118 |
| 8980.0 | 119 |
| 8981.0 | 118 |
| 8982.0 | 117 |
| 8983.0 | 116 |
| 8984.0 | 115 |
| 8985.0 | 116 |
| 8986.0 | 115 |
| 8987.0 | 116 |
| 8988.0 | 115 |
| 8989.0 | 116 |
| 8990.0 | 115 |
| 8991.0 | 116 |
| 8992.0 | 117 |
| 8993.0 | 116 |
| 8994.0 | 115 |
| 8995.0 | 114 |
| 8996.0 | 115 |
| 8997.0 | 116 |
| 8998.0 | 115 |
| 8999.0 | 114 |
| 9000.0 | 115 |
| 9001.0 | 114 |
| 9002.0 | 113 |
| 9003.0 | 112 |
| 9004.0 | 113 |
| 9005.0 | 114 |
| 9006.0 | 115 |
| 9007.0 | 116 |
| 9008.0 | 115 |
| 9009.0 | 114 |
| 9010.0 | 113 |
| 9011.0 | 112 |
| 9012.0 | 111 |
| 9013.0 | 110 |
| 9014.0 | 111 |
| 9015.0 | 112 |
| 9016.0 | 111 |
| 9017.0 | 110 |
| 9018.0 | 109 |
| 9019.0 | 110 |
| 9020.0 | 109 |
| 9021.0 | 108 |
| 9022.0 | 107 |
| 9023.0 | 106 |
| 9024.0 | 107 |
| 9025.0 | 108 |
| 9026.0 | 107 |
| 9027.0 | 108 |
| 9028.0 | 107 |
| 9029.0 | 106 |
| 9030.0 | 105 |
| 9031.0 | 106 |
| 9032.0 | 107 |
| 9033.0 | 106 |
| 9034.0 | 105 |
| 9035.0 | 104 |
| 9036.0 | 105 |
| 9037.0 | 104 |
| 9038.0 | 103 |
| 9039.0 | 104 |
| 9040.0 | 103 |
| 9041.0 | 102 |
| 9042.0 | 101 |
| 9043.0 | 102 |
| 9044.0 | 103 |
| 9045.0 | 104 |
| 9046.0 | 103 |
| 9047.0 | 102 |
| 9048.0 | 101 |
| 9049.0 | 100 |
| 9050.0 | 99 |
| 9051.0 | 100 |
| 9052.0 | 99 |
| 9053.0 | 98 |
| 9054.0 | 97 |
| 9055.0 | 96 |
| 9056.0 | 95 |
| 9057.0 | 94 |
| 9058.0 | 93 |
| 9059.0 | 92 |
| 9060.0 | 93 |
| 9061.0 | 94 |
| 9062.0 | 95 |
| 9063.0 | 96 |
| 9064.0 | 97 |
| 9065.0 | 96 |
| 9066.0 | 97 |
| 9067.0 | 98 |
| 9068.0 | 99 |
| 9069.0 | 100 |
| 9070.0 | 101 |
| 9071.0 | 102 |
| 9072.0 | 101 |
| 9073.0 | 102 |
| 9074.0 | 101 |
| 9075.0 | 100 |
| 9076.0 | 99 |
| 9077.0 | 100 |
| 9078.0 | 101 |
| 9079.0 | 100 |
| 9080.0 | 99 |
| 9081.0 | 100 |
| 9082.0 | 101 |
| 9083.0 | 100 |
| 9084.0 | 101 |
| 9085.0 | 102 |
| 9086.0 | 101 |
| 9087.0 | 102 |
| 9088.0 | 101 |
| 9089.0 | 102 |
| 9090.0 | 103 |
| 9091.0 | 104 |
| 9092.0 | 105 |
| 9093.0 | 104 |
| 9094.0 | 103 |
| 9095.0 | 104 |
| 9096.0 | 103 |
| 9097.0 | 104 |
| 9098.0 | 103 |
| 9099.0 | 102 |
| 9100.0 | 101 |
| 9101.0 | 102 |
| 9102.0 | 101 |
| 9103.0 | 100 |
| 9104.0 | 101 |
| 9105.0 | 100 |
| 9106.0 | 101 |
| 9107.0 | 102 |
| 9108.0 | 103 |
| 9109.0 | 102 |
| 9110.0 | 103 |
| 9111.0 | 104 |
| 9112.0 | 103 |
| 9113.0 | 102 |
| 9114.0 | 103 |
| 9115.0 | 104 |
| 9116.0 | 105 |
| 9117.0 | 104 |
| 9118.0 | 105 |
| 9119.0 | 104 |
| 9120.0 | 105 |
| 9121.0 | 104 |
| 9122.0 | 105 |
| 9123.0 | 106 |
| 9124.0 | 105 |
| 9125.0 | 106 |
| 9126.0 | 107 |
| 9127.0 | 108 |
| 9128.0 | 107 |
| 9129.0 | 106 |
| 9130.0 | 105 |
| 9131.0 | 106 |
| 9132.0 | 107 |
| 9133.0 | 106 |
| 9134.0 | 107 |
| 9135.0 | 106 |
| 9136.0 | 105 |
| 9137.0 | 104 |
| 9138.0 | 105 |
| 9139.0 | 106 |
| 9140.0 | 107 |
| 9141.0 | 106 |
| 9142.0 | 105 |
| 9143.0 | 104 |
| 9144.0 | 103 |
| 9145.0 | 102 |
| 9146.0 | 103 |
| 9147.0 | 104 |
| 9148.0 | 103 |
| 9149.0 | 104 |
| 9150.0 | 103 |
| 9151.0 | 102 |
| 9152.0 | 103 |
| 9153.0 | 102 |
| 9154.0 | 101 |
| 9155.0 | 102 |
| 9156.0 | 101 |
| 9157.0 | 102 |
| 9158.0 | 101 |
| 9159.0 | 102 |
| 9160.0 | 103 |
| 9161.0 | 102 |
| 9162.0 | 103 |
| 9163.0 | 104 |
| 9164.0 | 105 |
| 9165.0 | 104 |
| 9166.0 | 103 |
| 9167.0 | 102 |
| 9168.0 | 103 |
| 9169.0 | 102 |
| 9170.0 | 101 |
| 9171.0 | 102 |
| 9172.0 | 101 |
| 9173.0 | 100 |
| 9174.0 | 99 |
| 9175.0 | 98 |
| 9176.0 | 97 |
| 9177.0 | 96 |
| 9178.0 | 97 |
| 9179.0 | 98 |
| 9180.0 | 97 |
| 9181.0 | 96 |
| 9182.0 | 95 |
| 9183.0 | 94 |
| 9184.0 | 95 |
| 9185.0 | 96 |
| 9186.0 | 95 |
| 9187.0 | 96 |
| 9188.0 | 95 |
| 9189.0 | 94 |
| 9190.0 | 95 |
| 9191.0 | 96 |
| 9192.0 | 95 |
| 9193.0 | 96 |
| 9194.0 | 95 |
| 9195.0 | 94 |
| 9196.0 | 93 |
| 9197.0 | 92 |
| 9198.0 | 91 |
| 9199.0 | 90 |
| 9200.0 | 91 |
| 9201.0 | 92 |
| 9202.0 | 91 |
| 9203.0 | 92 |
| 9204.0 | 91 |
| 9205.0 | 92 |
| 9206.0 | 93 |
| 9207.0 | 92 |
| 9208.0 | 91 |
| 9209.0 | 90 |
| 9210.0 | 89 |
| 9211.0 | 88 |
| 9212.0 | 87 |
| 9213.0 | 88 |
| 9214.0 | 89 |
| 9215.0 | 88 |
| 9216.0 | 89 |
| 9217.0 | 88 |
| 9218.0 | 89 |
| 9219.0 | 88 |
| 9220.0 | 89 |
| 9221.0 | 88 |
| 9222.0 | 87 |
| 9223.0 | 86 |
| 9224.0 | 87 |
| 9225.0 | 88 |
| 9226.0 | 87 |
| 9227.0 | 86 |
| 9228.0 | 87 |
| 9229.0 | 86 |
| 9230.0 | 85 |
| 9231.0 | 84 |
| 9232.0 | 83 |
| 9233.0 | 82 |
| 9234.0 | 81 |
| 9235.0 | 82 |
| 9236.0 | 81 |
| 9237.0 | 80 |
| 9238.0 | 81 |
| 9239.0 | 82 |
| 9240.0 | 83 |
| 9241.0 | 82 |
| 9242.0 | 83 |
| 9243.0 | 82 |
| 9244.0 | 81 |
| 9245.0 | 82 |
| 9246.0 | 81 |
| 9247.0 | 82 |
| 9248.0 | 83 |
| 9249.0 | 84 |
| 9250.0 | 85 |
| 9251.0 | 86 |
| 9252.0 | 87 |
| 9253.0 | 86 |
| 9254.0 | 85 |
| 9255.0 | 86 |
| 9256.0 | 87 |
| 9257.0 | 88 |
| 9258.0 | 87 |
| 9259.0 | 88 |
| 9260.0 | 89 |
| 9261.0 | 90 |
| 9262.0 | 91 |
| 9263.0 | 90 |
| 9264.0 | 91 |
| 9265.0 | 90 |
| 9266.0 | 89 |
| 9267.0 | 90 |
| 9268.0 | 91 |
| 9269.0 | 90 |
| 9270.0 | 91 |
| 9271.0 | 90 |
| 9272.0 | 91 |
| 9273.0 | 90 |
| 9274.0 | 89 |
| 9275.0 | 88 |
| 9276.0 | 89 |
| 9277.0 | 90 |
| 9278.0 | 91 |
| 9279.0 | 92 |
| 9280.0 | 91 |
| 9281.0 | 92 |
| 9282.0 | 91 |
| 9283.0 | 92 |
| 9284.0 | 91 |
| 9285.0 | 92 |
| 9286.0 | 91 |
| 9287.0 | 90 |
| 9288.0 | 89 |
| 9289.0 | 90 |
| 9290.0 | 89 |
| 9291.0 | 90 |
| 9292.0 | 89 |
| 9293.0 | 90 |
| 9294.0 | 91 |
| 9295.0 | 90 |
| 9296.0 | 89 |
| 9297.0 | 88 |
| 9298.0 | 87 |
| 9299.0 | 88 |
| 9300.0 | 87 |
| 9301.0 | 88 |
| 9302.0 | 89 |
| 9303.0 | 90 |
| 9304.0 | 91 |
| 9305.0 | 92 |
| 9306.0 | 93 |
| 9307.0 | 92 |
| 9308.0 | 91 |
| 9309.0 | 92 |
| 9310.0 | 93 |
| 9311.0 | 94 |
| 9312.0 | 93 |
| 9313.0 | 94 |
| 9314.0 | 95 |
| 9315.0 | 96 |
| 9316.0 | 95 |
| 9317.0 | 96 |
| 9318.0 | 97 |
| 9319.0 | 96 |
| 9320.0 | 95 |
| 9321.0 | 96 |
| 9322.0 | 95 |
| 9323.0 | 94 |
| 9324.0 | 95 |
| 9325.0 | 94 |
| 9326.0 | 93 |
| 9327.0 | 92 |
| 9328.0 | 93 |
| 9329.0 | 94 |
| 9330.0 | 95 |
| 9331.0 | 94 |
| 9332.0 | 93 |
| 9333.0 | 92 |
| 9334.0 | 93 |
| 9335.0 | 94 |
| 9336.0 | 93 |
| 9337.0 | 92 |
| 9338.0 | 93 |
| 9339.0 | 94 |
| 9340.0 | 95 |
| 9341.0 | 96 |
| 9342.0 | 95 |
| 9343.0 | 94 |
| 9344.0 | 93 |
| 9345.0 | 92 |
| 9346.0 | 91 |
| 9347.0 | 92 |
| 9348.0 | 91 |
| 9349.0 | 90 |
| 9350.0 | 89 |
| 9351.0 | 88 |
| 9352.0 | 87 |
| 9353.0 | 86 |
| 9354.0 | 85 |
| 9355.0 | 86 |
| 9356.0 | 87 |
| 9357.0 | 88 |
| 9358.0 | 89 |
| 9359.0 | 90 |
| 9360.0 | 91 |
| 9361.0 | 92 |
| 9362.0 | 91 |
| 9363.0 | 92 |
| 9364.0 | 93 |
| 9365.0 | 92 |
| 9366.0 | 91 |
| 9367.0 | 92 |
| 9368.0 | 93 |
| 9369.0 | 94 |
| 9370.0 | 95 |
| 9371.0 | 94 |
| 9372.0 | 95 |
| 9373.0 | 94 |
| 9374.0 | 93 |
| 9375.0 | 92 |
| 9376.0 | 91 |
| 9377.0 | 90 |
| 9378.0 | 89 |
| 9379.0 | 88 |
| 9380.0 | 89 |
| 9381.0 | 88 |
| 9382.0 | 89 |
| 9383.0 | 88 |
| 9384.0 | 87 |
| 9385.0 | 88 |
| 9386.0 | 87 |
| 9387.0 | 86 |
| 9388.0 | 85 |
| 9389.0 | 84 |
| 9390.0 | 83 |
| 9391.0 | 84 |
| 9392.0 | 83 |
| 9393.0 | 82 |
| 9394.0 | 81 |
| 9395.0 | 82 |
| 9396.0 | 83 |
| 9397.0 | 82 |
| 9398.0 | 81 |
| 9399.0 | 80 |
| 9400.0 | 79 |
| 9401.0 | 78 |
| 9402.0 | 79 |
| 9403.0 | 80 |
| 9404.0 | 79 |
| 9405.0 | 80 |
| 9406.0 | 81 |
| 9407.0 | 82 |
| 9408.0 | 81 |
| 9409.0 | 80 |
| 9410.0 | 81 |
| 9411.0 | 82 |
| 9412.0 | 81 |
| 9413.0 | 80 |
| 9414.0 | 79 |
| 9415.0 | 78 |
| 9416.0 | 79 |
| 9417.0 | 78 |
| 9418.0 | 77 |
| 9419.0 | 78 |
| 9420.0 | 79 |
| 9421.0 | 78 |
| 9422.0 | 77 |
| 9423.0 | 78 |
| 9424.0 | 79 |
| 9425.0 | 78 |
| 9426.0 | 77 |
| 9427.0 | 76 |
| 9428.0 | 77 |
| 9429.0 | 76 |
| 9430.0 | 77 |
| 9431.0 | 76 |
| 9432.0 | 75 |
| 9433.0 | 74 |
| 9434.0 | 75 |
| 9435.0 | 76 |
| 9436.0 | 75 |
| 9437.0 | 74 |
| 9438.0 | 73 |
| 9439.0 | 72 |
| 9440.0 | 71 |
| 9441.0 | 70 |
| 9442.0 | 69 |
| 9443.0 | 68 |
| 9444.0 | 67 |
| 9445.0 | 66 |
| 9446.0 | 67 |
| 9447.0 | 66 |
| 9448.0 | 67 |
| 9449.0 | 68 |
| 9450.0 | 67 |
| 9451.0 | 66 |
| 9452.0 | 67 |
| 9453.0 | 68 |
| 9454.0 | 67 |
| 9455.0 | 66 |
| 9456.0 | 67 |
| 9457.0 | 68 |
| 9458.0 | 69 |
| 9459.0 | 70 |
| 9460.0 | 69 |
| 9461.0 | 70 |
| 9462.0 | 69 |
| 9463.0 | 70 |
| 9464.0 | 69 |
| 9465.0 | 68 |
| 9466.0 | 69 |
| 9467.0 | 70 |
| 9468.0 | 69 |
| 9469.0 | 68 |
| 9470.0 | 67 |
| 9471.0 | 66 |
| 9472.0 | 67 |
| 9473.0 | 66 |
| 9474.0 | 65 |
| 9475.0 | 66 |
| 9476.0 | 67 |
| 9477.0 | 68 |
| 9478.0 | 69 |
| 9479.0 | 70 |
| 9480.0 | 71 |
| 9481.0 | 70 |
| 9482.0 | 69 |
| 9483.0 | 68 |
| 9484.0 | 67 |
| 9485.0 | 68 |
| 9486.0 | 69 |
| 9487.0 | 68 |
| 9488.0 | 69 |
| 9489.0 | 68 |
| 9490.0 | 69 |
| 9491.0 | 68 |
| 9492.0 | 67 |
| 9493.0 | 68 |
| 9494.0 | 67 |
| 9495.0 | 66 |
| 9496.0 | 67 |
| 9497.0 | 66 |
| 9498.0 | 67 |
| 9499.0 | 68 |
| 9500.0 | 69 |
| 9501.0 | 68 |
| 9502.0 | 69 |
| 9503.0 | 68 |
| 9504.0 | 67 |
| 9505.0 | 66 |
| 9506.0 | 67 |
| 9507.0 | 68 |
| 9508.0 | 69 |
| 9509.0 | 68 |
| 9510.0 | 67 |
| 9511.0 | 68 |
| 9512.0 | 67 |
| 9513.0 | 66 |
| 9514.0 | 67 |
| 9515.0 | 66 |
| 9516.0 | 65 |
| 9517.0 | 66 |
| 9518.0 | 65 |
| 9519.0 | 64 |
| 9520.0 | 65 |
| 9521.0 | 64 |
| 9522.0 | 63 |
| 9523.0 | 64 |
| 9524.0 | 63 |
| 9525.0 | 62 |
| 9526.0 | 61 |
| 9527.0 | 62 |
| 9528.0 | 63 |
| 9529.0 | 62 |
| 9530.0 | 61 |
| 9531.0 | 62 |
| 9532.0 | 61 |
| 9533.0 | 62 |
| 9534.0 | 63 |
| 9535.0 | 62 |
| 9536.0 | 63 |
| 9537.0 | 62 |
| 9538.0 | 63 |
| 9539.0 | 64 |
| 9540.0 | 65 |
| 9541.0 | 64 |
| 9542.0 | 63 |
| 9543.0 | 62 |
| 9544.0 | 63 |
| 9545.0 | 62 |
| 9546.0 | 63 |
| 9547.0 | 64 |
| 9548.0 | 63 |
| 9549.0 | 64 |
| 9550.0 | 63 |
| 9551.0 | 64 |
| 9552.0 | 65 |
| 9553.0 | 64 |
| 9554.0 | 63 |
| 9555.0 | 64 |
| 9556.0 | 63 |
| 9557.0 | 62 |
| 9558.0 | 61 |
| 9559.0 | 62 |
| 9560.0 | 63 |
| 9561.0 | 62 |
| 9562.0 | 61 |
| 9563.0 | 62 |
| 9564.0 | 61 |
| 9565.0 | 60 |
| 9566.0 | 61 |
| 9567.0 | 60 |
| 9568.0 | 59 |
| 9569.0 | 58 |
| 9570.0 | 59 |
| 9571.0 | 58 |
| 9572.0 | 59 |
| 9573.0 | 60 |
| 9574.0 | 59 |
| 9575.0 | 60 |
| 9576.0 | 61 |
| 9577.0 | 60 |
| 9578.0 | 61 |
| 9579.0 | 60 |
| 9580.0 | 61 |
| 9581.0 | 60 |
| 9582.0 | 61 |
| 9583.0 | 60 |
| 9584.0 | 61 |
| 9585.0 | 62 |
| 9586.0 | 63 |
| 9587.0 | 64 |
| 9588.0 | 65 |
| 9589.0 | 64 |
| 9590.0 | 63 |
| 9591.0 | 62 |
| 9592.0 | 63 |
| 9593.0 | 64 |
| 9594.0 | 65 |
| 9595.0 | 64 |
| 9596.0 | 65 |
| 9597.0 | 64 |
| 9598.0 | 65 |
| 9599.0 | 64 |
| 9600.0 | 65 |
| 9601.0 | 66 |
| 9602.0 | 65 |
| 9603.0 | 66 |
| 9604.0 | 65 |
| 9605.0 | 64 |
| 9606.0 | 63 |
| 9607.0 | 64 |
| 9608.0 | 63 |
| 9609.0 | 62 |
| 9610.0 | 61 |
| 9611.0 | 62 |
| 9612.0 | 63 |
| 9613.0 | 62 |
| 9614.0 | 63 |
| 9615.0 | 62 |
| 9616.0 | 61 |
| 9617.0 | 62 |
| 9618.0 | 61 |
| 9619.0 | 62 |
| 9620.0 | 61 |
| 9621.0 | 60 |
| 9622.0 | 59 |
| 9623.0 | 58 |
| 9624.0 | 59 |
| 9625.0 | 58 |
| 9626.0 | 59 |
| 9627.0 | 58 |
| 9628.0 | 57 |
| 9629.0 | 56 |
| 9630.0 | 55 |
| 9631.0 | 56 |
| 9632.0 | 57 |
| 9633.0 | 56 |
| 9634.0 | 57 |
| 9635.0 | 56 |
| 9636.0 | 55 |
| 9637.0 | 54 |
| 9638.0 | 53 |
| 9639.0 | 54 |
| 9640.0 | 53 |
| 9641.0 | 52 |
| 9642.0 | 51 |
| 9643.0 | 50 |
| 9644.0 | 51 |
| 9645.0 | 50 |
| 9646.0 | 51 |
| 9647.0 | 50 |
| 9648.0 | 49 |
| 9649.0 | 48 |
| 9650.0 | 49 |
| 9651.0 | 50 |
| 9652.0 | 49 |
| 9653.0 | 50 |
| 9654.0 | 51 |
| 9655.0 | 50 |
| 9656.0 | 49 |
| 9657.0 | 48 |
| 9658.0 | 47 |
| 9659.0 | 46 |
| 9660.0 | 45 |
| 9661.0 | 44 |
| 9662.0 | 45 |
| 9663.0 | 44 |
| 9664.0 | 43 |
| 9665.0 | 44 |
| 9666.0 | 43 |
| 9667.0 | 44 |
| 9668.0 | 45 |
| 9669.0 | 44 |
| 9670.0 | 45 |
| 9671.0 | 46 |
| 9672.0 | 47 |
| 9673.0 | 46 |
| 9674.0 | 45 |
| 9675.0 | 46 |
| 9676.0 | 47 |
| 9677.0 | 46 |
| 9678.0 | 47 |
| 9679.0 | 46 |
| 9680.0 | 45 |
| 9681.0 | 44 |
| 9682.0 | 43 |
| 9683.0 | 44 |
| 9684.0 | 45 |
| 9685.0 | 46 |
| 9686.0 | 47 |
| 9687.0 | 48 |
| 9688.0 | 47 |
| 9689.0 | 46 |
| 9690.0 | 47 |
| 9691.0 | 46 |
| 9692.0 | 47 |
| 9693.0 | 46 |
| 9694.0 | 45 |
| 9695.0 | 46 |
| 9696.0 | 47 |
| 9697.0 | 48 |
| 9698.0 | 47 |
| 9699.0 | 46 |
| 9700.0 | 45 |
| 9701.0 | 44 |
| 9702.0 | 45 |
| 9703.0 | 46 |
| 9704.0 | 45 |
| 9705.0 | 46 |
| 9706.0 | 47 |
| 9707.0 | 48 |
| 9708.0 | 47 |
| 9709.0 | 46 |
| 9710.0 | 45 |
| 9711.0 | 44 |
| 9712.0 | 45 |
| 9713.0 | 46 |
| 9714.0 | 45 |
| 9715.0 | 46 |
| 9716.0 | 47 |
| 9717.0 | 48 |
| 9718.0 | 49 |
| 9719.0 | 48 |
| 9720.0 | 49 |
| 9721.0 | 48 |
| 9722.0 | 49 |
| 9723.0 | 50 |
| 9724.0 | 49 |
| 9725.0 | 50 |
| 9726.0 | 49 |
| 9727.0 | 50 |
| 9728.0 | 49 |
| 9729.0 | 48 |
| 9730.0 | 47 |
| 9731.0 | 46 |
| 9732.0 | 47 |
| 9733.0 | 48 |
| 9734.0 | 49 |
| 9735.0 | 48 |
| 9736.0 | 49 |
| 9737.0 | 50 |
| 9738.0 | 49 |
| 9739.0 | 50 |
| 9740.0 | 49 |
| 9741.0 | 50 |
| 9742.0 | 49 |
| 9743.0 | 50 |
| 9744.0 | 49 |
| 9745.0 | 50 |
| 9746.0 | 49 |
| 9747.0 | 48 |
| 9748.0 | 49 |
| 9749.0 | 48 |
| 9750.0 | 47 |
| 9751.0 | 48 |
| 9752.0 | 49 |
| 9753.0 | 50 |
| 9754.0 | 49 |
| 9755.0 | 48 |
| 9756.0 | 47 |
| 9757.0 | 48 |
| 9758.0 | 49 |
| 9759.0 | 50 |
| 9760.0 | 49 |
| 9761.0 | 48 |
| 9762.0 | 47 |
| 9763.0 | 46 |
| 9764.0 | 47 |
| 9765.0 | 48 |
| 9766.0 | 47 |
| 9767.0 | 48 |
| 9768.0 | 47 |
| 9769.0 | 46 |
| 9770.0 | 45 |
| 9771.0 | 46 |
| 9772.0 | 47 |
| 9773.0 | 46 |
| 9774.0 | 47 |
| 9775.0 | 48 |
| 9776.0 | 47 |
| 9777.0 | 46 |
| 9778.0 | 47 |
| 9779.0 | 46 |
| 9780.0 | 47 |
| 9781.0 | 46 |
| 9782.0 | 47 |
| 9783.0 | 48 |
| 9784.0 | 49 |
| 9785.0 | 50 |
| 9786.0 | 51 |
| 9787.0 | 50 |
| 9788.0 | 49 |
| 9789.0 | 50 |
| 9790.0 | 51 |
| 9791.0 | 52 |
| 9792.0 | 51 |
| 9793.0 | 50 |
| 9794.0 | 49 |
| 9795.0 | 50 |
| 9796.0 | 51 |
| 9797.0 | 52 |
| 9798.0 | 53 |
| 9799.0 | 54 |
| 9800.0 | 53 |
| 9801.0 | 52 |
| 9802.0 | 51 |
| 9803.0 | 52 |
| 9804.0 | 51 |
| 9805.0 | 52 |
| 9806.0 | 53 |
| 9807.0 | 54 |
| 9808.0 | 53 |
| 9809.0 | 52 |
| 9810.0 | 51 |
| 9811.0 | 52 |
| 9812.0 | 51 |
| 9813.0 | 52 |
| 9814.0 | 51 |
| 9815.0 | 52 |
| 9816.0 | 53 |
| 9817.0 | 54 |
| 9818.0 | 53 |
| 9819.0 | 52 |
| 9820.0 | 53 |
| 9821.0 | 54 |
| 9822.0 | 53 |
| 9823.0 | 52 |
| 9824.0 | 51 |
| 9825.0 | 50 |
| 9826.0 | 51 |
| 9827.0 | 52 |
| 9828.0 | 53 |
| 9829.0 | 54 |
| 9830.0 | 55 |
| 9831.0 | 54 |
| 9832.0 | 55 |
| 9833.0 | 54 |
| 9834.0 | 53 |
| 9835.0 | 52 |
| 9836.0 | 53 |
| 9837.0 | 52 |
| 9838.0 | 51 |
| 9839.0 | 52 |
| 9840.0 | 53 |
| 9841.0 | 54 |
| 9842.0 | 53 |
| 9843.0 | 54 |
| 9844.0 | 53 |
| 9845.0 | 52 |
| 9846.0 | 53 |
| 9847.0 | 52 |
| 9848.0 | 53 |
| 9849.0 | 52 |
| 9850.0 | 53 |
| 9851.0 | 52 |
| 9852.0 | 53 |
| 9853.0 | 54 |
| 9854.0 | 53 |
| 9855.0 | 54 |
| 9856.0 | 53 |
| 9857.0 | 52 |
| 9858.0 | 51 |
| 9859.0 | 50 |
| 9860.0 | 49 |
| 9861.0 | 50 |
| 9862.0 | 49 |
| 9863.0 | 50 |
| 9864.0 | 51 |
| 9865.0 | 50 |
| 9866.0 | 49 |
| 9867.0 | 48 |
| 9868.0 | 49 |
| 9869.0 | 48 |
| 9870.0 | 47 |
| 9871.0 | 46 |
| 9872.0 | 45 |
| 9873.0 | 44 |
| 9874.0 | 45 |
| 9875.0 | 46 |
| 9876.0 | 47 |
| 9877.0 | 46 |
| 9878.0 | 47 |
| 9879.0 | 46 |
| 9880.0 | 45 |
| 9881.0 | 46 |
| 9882.0 | 45 |
| 9883.0 | 44 |
| 9884.0 | 45 |
| 9885.0 | 46 |
| 9886.0 | 45 |
| 9887.0 | 44 |
| 9888.0 | 45 |
| 9889.0 | 44 |
| 9890.0 | 43 |
| 9891.0 | 42 |
| 9892.0 | 43 |
| 9893.0 | 44 |
| 9894.0 | 43 |
| 9895.0 | 44 |
| 9896.0 | 45 |
| 9897.0 | 46 |
| 9898.0 | 45 |
| 9899.0 | 44 |
| 9900.0 | 43 |
| 9901.0 | 44 |
| 9902.0 | 45 |
| 9903.0 | 44 |
| 9904.0 | 45 |
| 9905.0 | 44 |
| 9906.0 | 45 |
| 9907.0 | 44 |
| 9908.0 | 45 |
| 9909.0 | 44 |
| 9910.0 | 45 |
| 9911.0 | 46 |
| 9912.0 | 47 |
| 9913.0 | 46 |
| 9914.0 | 45 |
| 9915.0 | 44 |
| 9916.0 | 45 |
| 9917.0 | 44 |
| 9918.0 | 45 |
| 9919.0 | 46 |
| 9920.0 | 47 |
| 9921.0 | 46 |
| 9922.0 | 47 |
| 9923.0 | 48 |
| 9924.0 | 47 |
| 9925.0 | 46 |
| 9926.0 | 47 |
| 9927.0 | 48 |
| 9928.0 | 47 |
| 9929.0 | 46 |
| 9930.0 | 45 |
| 9931.0 | 44 |
| 9932.0 | 45 |
| 9933.0 | 46 |
| 9934.0 | 45 |
| 9935.0 | 44 |
| 9936.0 | 45 |
| 9937.0 | 44 |
| 9938.0 | 45 |
| 9939.0 | 46 |
| 9940.0 | 47 |
| 9941.0 | 48 |
| 9942.0 | 47 |
| 9943.0 | 46 |
| 9944.0 | 45 |
| 9945.0 | 44 |
| 9946.0 | 45 |
| 9947.0 | 46 |
| 9948.0 | 45 |
| 9949.0 | 44 |
| 9950.0 | 43 |
| 9951.0 | 42 |
| 9952.0 | 43 |
| 9953.0 | 44 |
| 9954.0 | 45 |
| 9955.0 | 46 |
| 9956.0 | 45 |
| 9957.0 | 44 |
| 9958.0 | 43 |
| 9959.0 | 42 |
| 9960.0 | 41 |
| 9961.0 | 40 |
| 9962.0 | 39 |
| 9963.0 | 40 |
| 9964.0 | 39 |
| 9965.0 | 40 |
| 9966.0 | 41 |
| 9967.0 | 42 |
| 9968.0 | 43 |
| 9969.0 | 42 |
| 9970.0 | 41 |
| 9971.0 | 40 |
| 9972.0 | 41 |
| 9973.0 | 40 |
| 9974.0 | 39 |
| 9975.0 | 40 |
| 9976.0 | 41 |
| 9977.0 | 40 |
| 9978.0 | 41 |
| 9979.0 | 42 |
| 9980.0 | 41 |
| 9981.0 | 42 |
| 9982.0 | 43 |
| 9983.0 | 42 |
| 9984.0 | 41 |
| 9985.0 | 40 |
| 9986.0 | 39 |
| 9987.0 | 38 |
| 9988.0 | 37 |
| 9989.0 | 38 |
| 9990.0 | 37 |
| 9991.0 | 38 |
| 9992.0 | 39 |
| 9993.0 | 38 |
| 9994.0 | 39 |
| 9995.0 | 40 |
| 9996.0 | 41 |
| 9997.0 | 40 |
| 9998.0 | 39 |
| 9999.0 | 38 |
| 10000.0 | 39 |